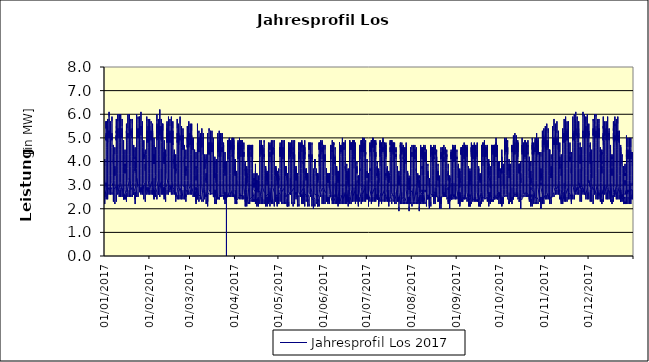
| Category | Jahresprofil Los 2017 |
|---|---|
| 01/01/2017 | 3 |
| 01/01/2017 | 3 |
| 01/01/2017 | 2.8 |
| 01/01/2017 | 2.7 |
| 01/01/2017 | 2.2 |
| 01/01/2017 | 2.6 |
| 01/01/2017 | 2.7 |
| 01/01/2017 | 2.5 |
| 01/01/2017 | 2.7 |
| 01/01/2017 | 2.6 |
| 01/01/2017 | 3.1 |
| 01/01/2017 | 2.9 |
| 01/01/2017 | 3.2 |
| 01/01/2017 | 3.3 |
| 01/01/2017 | 3.4 |
| 01/01/2017 | 3.6 |
| 01/01/2017 | 3.8 |
| 01/01/2017 | 4.1 |
| 01/01/2017 | 3.8 |
| 01/01/2017 | 3.8 |
| 01/01/2017 | 3.8 |
| 01/01/2017 | 3.3 |
| 01/01/2017 | 3.3 |
| 01/01/2017 | 2.9 |
| 01/01/2017 | 2.8 |
| 02/01/2017 | 2.6 |
| 02/01/2017 | 2.5 |
| 02/01/2017 | 2.4 |
| 02/01/2017 | 2.4 |
| 02/01/2017 | 2.9 |
| 02/01/2017 | 3.1 |
| 02/01/2017 | 4.2 |
| 02/01/2017 | 4.5 |
| 02/01/2017 | 4.5 |
| 02/01/2017 | 4.6 |
| 02/01/2017 | 5.2 |
| 02/01/2017 | 4.9 |
| 02/01/2017 | 5.1 |
| 02/01/2017 | 5 |
| 02/01/2017 | 4.9 |
| 02/01/2017 | 5.7 |
| 02/01/2017 | 5.4 |
| 02/01/2017 | 5.7 |
| 02/01/2017 | 5.4 |
| 02/01/2017 | 4.8 |
| 02/01/2017 | 4.1 |
| 02/01/2017 | 3.9 |
| 02/01/2017 | 3 |
| 02/01/2017 | 3.1 |
| 03/01/2017 | 2.7 |
| 03/01/2017 | 2.6 |
| 03/01/2017 | 2.4 |
| 03/01/2017 | 2.4 |
| 03/01/2017 | 2.9 |
| 03/01/2017 | 3.5 |
| 03/01/2017 | 4.1 |
| 03/01/2017 | 4.5 |
| 03/01/2017 | 4.8 |
| 03/01/2017 | 5 |
| 03/01/2017 | 5 |
| 03/01/2017 | 5.2 |
| 03/01/2017 | 4.8 |
| 03/01/2017 | 5.1 |
| 03/01/2017 | 5 |
| 03/01/2017 | 5.5 |
| 03/01/2017 | 5.8 |
| 03/01/2017 | 5.6 |
| 03/01/2017 | 5.2 |
| 03/01/2017 | 4.6 |
| 03/01/2017 | 4.3 |
| 03/01/2017 | 3.6 |
| 03/01/2017 | 3.2 |
| 03/01/2017 | 2.8 |
| 04/01/2017 | 2.9 |
| 04/01/2017 | 2.7 |
| 04/01/2017 | 2.6 |
| 04/01/2017 | 2.6 |
| 04/01/2017 | 2.8 |
| 04/01/2017 | 3.6 |
| 04/01/2017 | 4.1 |
| 04/01/2017 | 4.7 |
| 04/01/2017 | 4.9 |
| 04/01/2017 | 5.3 |
| 04/01/2017 | 5.3 |
| 04/01/2017 | 5 |
| 04/01/2017 | 5.3 |
| 04/01/2017 | 5.2 |
| 04/01/2017 | 5.1 |
| 04/01/2017 | 5.8 |
| 04/01/2017 | 6.1 |
| 04/01/2017 | 5.9 |
| 04/01/2017 | 5.6 |
| 04/01/2017 | 4.8 |
| 04/01/2017 | 4.4 |
| 04/01/2017 | 4 |
| 04/01/2017 | 3.4 |
| 04/01/2017 | 2.8 |
| 05/01/2017 | 2.9 |
| 05/01/2017 | 2.8 |
| 05/01/2017 | 2.6 |
| 05/01/2017 | 2.6 |
| 05/01/2017 | 2.8 |
| 05/01/2017 | 3.6 |
| 05/01/2017 | 4.6 |
| 05/01/2017 | 4.6 |
| 05/01/2017 | 4.7 |
| 05/01/2017 | 5.2 |
| 05/01/2017 | 5.1 |
| 05/01/2017 | 5.3 |
| 05/01/2017 | 5 |
| 05/01/2017 | 4.9 |
| 05/01/2017 | 5.3 |
| 05/01/2017 | 5.4 |
| 05/01/2017 | 5.7 |
| 05/01/2017 | 5.7 |
| 05/01/2017 | 5.3 |
| 05/01/2017 | 4.7 |
| 05/01/2017 | 4.3 |
| 05/01/2017 | 3.9 |
| 05/01/2017 | 3.4 |
| 05/01/2017 | 2.8 |
| 06/01/2017 | 2.9 |
| 06/01/2017 | 2.8 |
| 06/01/2017 | 2.6 |
| 06/01/2017 | 2.6 |
| 06/01/2017 | 2.7 |
| 06/01/2017 | 3.4 |
| 06/01/2017 | 4.4 |
| 06/01/2017 | 4.6 |
| 06/01/2017 | 4.8 |
| 06/01/2017 | 5.2 |
| 06/01/2017 | 5.2 |
| 06/01/2017 | 5.2 |
| 06/01/2017 | 5.2 |
| 06/01/2017 | 4.9 |
| 06/01/2017 | 5.1 |
| 06/01/2017 | 5.6 |
| 06/01/2017 | 5.9 |
| 06/01/2017 | 5.7 |
| 06/01/2017 | 5.2 |
| 06/01/2017 | 4.6 |
| 06/01/2017 | 3.9 |
| 06/01/2017 | 3.8 |
| 06/01/2017 | 3.2 |
| 06/01/2017 | 3.1 |
| 07/01/2017 | 2.9 |
| 07/01/2017 | 2.7 |
| 07/01/2017 | 2.3 |
| 07/01/2017 | 2.7 |
| 07/01/2017 | 2.6 |
| 07/01/2017 | 2.6 |
| 07/01/2017 | 3 |
| 07/01/2017 | 3.6 |
| 07/01/2017 | 3.7 |
| 07/01/2017 | 4.3 |
| 07/01/2017 | 4.1 |
| 07/01/2017 | 4.1 |
| 07/01/2017 | 4 |
| 07/01/2017 | 4.1 |
| 07/01/2017 | 3.9 |
| 07/01/2017 | 4.7 |
| 07/01/2017 | 4.6 |
| 07/01/2017 | 4.6 |
| 07/01/2017 | 4.4 |
| 07/01/2017 | 4.3 |
| 07/01/2017 | 3.9 |
| 07/01/2017 | 3.3 |
| 07/01/2017 | 3.2 |
| 07/01/2017 | 3 |
| 08/01/2017 | 2.8 |
| 08/01/2017 | 2.7 |
| 08/01/2017 | 2.4 |
| 08/01/2017 | 2.2 |
| 08/01/2017 | 2.3 |
| 08/01/2017 | 2.3 |
| 08/01/2017 | 2.5 |
| 08/01/2017 | 3 |
| 08/01/2017 | 3.2 |
| 08/01/2017 | 3.6 |
| 08/01/2017 | 3.7 |
| 08/01/2017 | 3.7 |
| 08/01/2017 | 3.8 |
| 08/01/2017 | 3.4 |
| 08/01/2017 | 3.7 |
| 08/01/2017 | 4 |
| 08/01/2017 | 4.2 |
| 08/01/2017 | 4.6 |
| 08/01/2017 | 4.3 |
| 08/01/2017 | 3.9 |
| 08/01/2017 | 3.6 |
| 08/01/2017 | 3.6 |
| 08/01/2017 | 3.2 |
| 08/01/2017 | 3 |
| 09/01/2017 | 2.8 |
| 09/01/2017 | 2.3 |
| 09/01/2017 | 2.6 |
| 09/01/2017 | 2.7 |
| 09/01/2017 | 3 |
| 09/01/2017 | 3.4 |
| 09/01/2017 | 4.3 |
| 09/01/2017 | 4.4 |
| 09/01/2017 | 5.1 |
| 09/01/2017 | 4.9 |
| 09/01/2017 | 4.9 |
| 09/01/2017 | 5.1 |
| 09/01/2017 | 4.9 |
| 09/01/2017 | 5.3 |
| 09/01/2017 | 5.2 |
| 09/01/2017 | 5.5 |
| 09/01/2017 | 5.6 |
| 09/01/2017 | 5.8 |
| 09/01/2017 | 5.4 |
| 09/01/2017 | 4.7 |
| 09/01/2017 | 4.4 |
| 09/01/2017 | 3.9 |
| 09/01/2017 | 3.3 |
| 09/01/2017 | 2.8 |
| 10/01/2017 | 3 |
| 10/01/2017 | 2.8 |
| 10/01/2017 | 2.6 |
| 10/01/2017 | 2.7 |
| 10/01/2017 | 2.9 |
| 10/01/2017 | 3.8 |
| 10/01/2017 | 4.3 |
| 10/01/2017 | 4.9 |
| 10/01/2017 | 4.9 |
| 10/01/2017 | 5.3 |
| 10/01/2017 | 5.3 |
| 10/01/2017 | 5.4 |
| 10/01/2017 | 5.1 |
| 10/01/2017 | 5 |
| 10/01/2017 | 5.3 |
| 10/01/2017 | 5.3 |
| 10/01/2017 | 6 |
| 10/01/2017 | 5.7 |
| 10/01/2017 | 5.7 |
| 10/01/2017 | 5 |
| 10/01/2017 | 4.1 |
| 10/01/2017 | 4 |
| 10/01/2017 | 3.5 |
| 10/01/2017 | 3 |
| 11/01/2017 | 2.6 |
| 11/01/2017 | 2.5 |
| 11/01/2017 | 2.8 |
| 11/01/2017 | 2.9 |
| 11/01/2017 | 3.1 |
| 11/01/2017 | 3.5 |
| 11/01/2017 | 4.5 |
| 11/01/2017 | 4.7 |
| 11/01/2017 | 4.8 |
| 11/01/2017 | 5.1 |
| 11/01/2017 | 5.1 |
| 11/01/2017 | 5.2 |
| 11/01/2017 | 5.4 |
| 11/01/2017 | 5.3 |
| 11/01/2017 | 5 |
| 11/01/2017 | 5.8 |
| 11/01/2017 | 6 |
| 11/01/2017 | 5.7 |
| 11/01/2017 | 5.3 |
| 11/01/2017 | 5 |
| 11/01/2017 | 4.1 |
| 11/01/2017 | 3.6 |
| 11/01/2017 | 3.6 |
| 11/01/2017 | 3 |
| 12/01/2017 | 2.7 |
| 12/01/2017 | 2.5 |
| 12/01/2017 | 2.8 |
| 12/01/2017 | 2.9 |
| 12/01/2017 | 3.1 |
| 12/01/2017 | 3.9 |
| 12/01/2017 | 4.5 |
| 12/01/2017 | 4.5 |
| 12/01/2017 | 5.1 |
| 12/01/2017 | 5 |
| 12/01/2017 | 5.4 |
| 12/01/2017 | 5 |
| 12/01/2017 | 5.2 |
| 12/01/2017 | 5 |
| 12/01/2017 | 5.2 |
| 12/01/2017 | 5.4 |
| 12/01/2017 | 5.6 |
| 12/01/2017 | 6 |
| 12/01/2017 | 5.5 |
| 12/01/2017 | 4.8 |
| 12/01/2017 | 4 |
| 12/01/2017 | 3.6 |
| 12/01/2017 | 3.6 |
| 12/01/2017 | 3.1 |
| 13/01/2017 | 2.7 |
| 13/01/2017 | 2.5 |
| 13/01/2017 | 2.8 |
| 13/01/2017 | 2.8 |
| 13/01/2017 | 3 |
| 13/01/2017 | 3.8 |
| 13/01/2017 | 4.3 |
| 13/01/2017 | 5 |
| 13/01/2017 | 5.2 |
| 13/01/2017 | 5.1 |
| 13/01/2017 | 5.4 |
| 13/01/2017 | 5.4 |
| 13/01/2017 | 5.3 |
| 13/01/2017 | 5 |
| 13/01/2017 | 5.1 |
| 13/01/2017 | 5.1 |
| 13/01/2017 | 5.8 |
| 13/01/2017 | 5.5 |
| 13/01/2017 | 5.4 |
| 13/01/2017 | 4.7 |
| 13/01/2017 | 4 |
| 13/01/2017 | 3.5 |
| 13/01/2017 | 3.3 |
| 13/01/2017 | 2.9 |
| 14/01/2017 | 2.6 |
| 14/01/2017 | 2.4 |
| 14/01/2017 | 2.5 |
| 14/01/2017 | 2.4 |
| 14/01/2017 | 2.8 |
| 14/01/2017 | 2.9 |
| 14/01/2017 | 3.3 |
| 14/01/2017 | 3.5 |
| 14/01/2017 | 4.1 |
| 14/01/2017 | 4.1 |
| 14/01/2017 | 4.3 |
| 14/01/2017 | 4.3 |
| 14/01/2017 | 4.1 |
| 14/01/2017 | 4.2 |
| 14/01/2017 | 4.4 |
| 14/01/2017 | 4.3 |
| 14/01/2017 | 4.5 |
| 14/01/2017 | 4.9 |
| 14/01/2017 | 4.5 |
| 14/01/2017 | 3.9 |
| 14/01/2017 | 3.5 |
| 14/01/2017 | 3.5 |
| 14/01/2017 | 3.3 |
| 14/01/2017 | 2.7 |
| 15/01/2017 | 2.5 |
| 15/01/2017 | 2.4 |
| 15/01/2017 | 2.6 |
| 15/01/2017 | 2.4 |
| 15/01/2017 | 2.5 |
| 15/01/2017 | 2.6 |
| 15/01/2017 | 2.8 |
| 15/01/2017 | 2.8 |
| 15/01/2017 | 3.5 |
| 15/01/2017 | 3.8 |
| 15/01/2017 | 3.9 |
| 15/01/2017 | 3.8 |
| 15/01/2017 | 3.9 |
| 15/01/2017 | 3.5 |
| 15/01/2017 | 3.7 |
| 15/01/2017 | 4.1 |
| 15/01/2017 | 4.1 |
| 15/01/2017 | 4.3 |
| 15/01/2017 | 4.5 |
| 15/01/2017 | 4 |
| 15/01/2017 | 3.8 |
| 15/01/2017 | 3.2 |
| 15/01/2017 | 2.9 |
| 15/01/2017 | 2.8 |
| 16/01/2017 | 2.5 |
| 16/01/2017 | 2.4 |
| 16/01/2017 | 2.3 |
| 16/01/2017 | 2.4 |
| 16/01/2017 | 2.7 |
| 16/01/2017 | 3.8 |
| 16/01/2017 | 4.2 |
| 16/01/2017 | 4.9 |
| 16/01/2017 | 5 |
| 16/01/2017 | 5.3 |
| 16/01/2017 | 5.2 |
| 16/01/2017 | 5.3 |
| 16/01/2017 | 5 |
| 16/01/2017 | 4.9 |
| 16/01/2017 | 5.1 |
| 16/01/2017 | 5.5 |
| 16/01/2017 | 5.5 |
| 16/01/2017 | 5.6 |
| 16/01/2017 | 5.6 |
| 16/01/2017 | 4.9 |
| 16/01/2017 | 4 |
| 16/01/2017 | 3.6 |
| 16/01/2017 | 3.5 |
| 16/01/2017 | 3.1 |
| 17/01/2017 | 2.7 |
| 17/01/2017 | 2.5 |
| 17/01/2017 | 2.8 |
| 17/01/2017 | 3 |
| 17/01/2017 | 3.2 |
| 17/01/2017 | 3.7 |
| 17/01/2017 | 4.7 |
| 17/01/2017 | 4.8 |
| 17/01/2017 | 4.9 |
| 17/01/2017 | 5.1 |
| 17/01/2017 | 5 |
| 17/01/2017 | 5.1 |
| 17/01/2017 | 5.2 |
| 17/01/2017 | 5.1 |
| 17/01/2017 | 5.2 |
| 17/01/2017 | 5.3 |
| 17/01/2017 | 6 |
| 17/01/2017 | 6 |
| 17/01/2017 | 5.4 |
| 17/01/2017 | 4.7 |
| 17/01/2017 | 4.3 |
| 17/01/2017 | 3.7 |
| 17/01/2017 | 3.2 |
| 17/01/2017 | 3.2 |
| 18/01/2017 | 2.8 |
| 18/01/2017 | 2.7 |
| 18/01/2017 | 2.5 |
| 18/01/2017 | 2.6 |
| 18/01/2017 | 2.8 |
| 18/01/2017 | 3.9 |
| 18/01/2017 | 4.4 |
| 18/01/2017 | 5.1 |
| 18/01/2017 | 5.2 |
| 18/01/2017 | 5.5 |
| 18/01/2017 | 5.4 |
| 18/01/2017 | 5.4 |
| 18/01/2017 | 5.1 |
| 18/01/2017 | 5.4 |
| 18/01/2017 | 5.4 |
| 18/01/2017 | 5.3 |
| 18/01/2017 | 5.9 |
| 18/01/2017 | 6 |
| 18/01/2017 | 5.5 |
| 18/01/2017 | 4.7 |
| 18/01/2017 | 4.3 |
| 18/01/2017 | 3.8 |
| 18/01/2017 | 3.2 |
| 18/01/2017 | 3.3 |
| 19/01/2017 | 2.9 |
| 19/01/2017 | 2.7 |
| 19/01/2017 | 2.5 |
| 19/01/2017 | 2.6 |
| 19/01/2017 | 2.8 |
| 19/01/2017 | 3.8 |
| 19/01/2017 | 4.4 |
| 19/01/2017 | 5 |
| 19/01/2017 | 5 |
| 19/01/2017 | 5.3 |
| 19/01/2017 | 5.2 |
| 19/01/2017 | 5.2 |
| 19/01/2017 | 5.3 |
| 19/01/2017 | 5.1 |
| 19/01/2017 | 5.1 |
| 19/01/2017 | 5.4 |
| 19/01/2017 | 5.6 |
| 19/01/2017 | 5.8 |
| 19/01/2017 | 5.7 |
| 19/01/2017 | 5 |
| 19/01/2017 | 4.2 |
| 19/01/2017 | 3.8 |
| 19/01/2017 | 3.2 |
| 19/01/2017 | 2.8 |
| 20/01/2017 | 2.9 |
| 20/01/2017 | 2.7 |
| 20/01/2017 | 2.5 |
| 20/01/2017 | 2.6 |
| 20/01/2017 | 3.3 |
| 20/01/2017 | 3.7 |
| 20/01/2017 | 4.7 |
| 20/01/2017 | 4.9 |
| 20/01/2017 | 5.1 |
| 20/01/2017 | 5.4 |
| 20/01/2017 | 5.2 |
| 20/01/2017 | 5.1 |
| 20/01/2017 | 5 |
| 20/01/2017 | 5.1 |
| 20/01/2017 | 5 |
| 20/01/2017 | 5.2 |
| 20/01/2017 | 5.7 |
| 20/01/2017 | 5.8 |
| 20/01/2017 | 5.6 |
| 20/01/2017 | 4.9 |
| 20/01/2017 | 4.2 |
| 20/01/2017 | 3.6 |
| 20/01/2017 | 3.5 |
| 20/01/2017 | 3.1 |
| 21/01/2017 | 2.8 |
| 21/01/2017 | 2.6 |
| 21/01/2017 | 2.7 |
| 21/01/2017 | 2.6 |
| 21/01/2017 | 2.6 |
| 21/01/2017 | 2.7 |
| 21/01/2017 | 3.1 |
| 21/01/2017 | 3.8 |
| 21/01/2017 | 3.9 |
| 21/01/2017 | 4.4 |
| 21/01/2017 | 4.5 |
| 21/01/2017 | 4.4 |
| 21/01/2017 | 4.2 |
| 21/01/2017 | 4.3 |
| 21/01/2017 | 4.3 |
| 21/01/2017 | 4.3 |
| 21/01/2017 | 4.5 |
| 21/01/2017 | 4.7 |
| 21/01/2017 | 4.7 |
| 21/01/2017 | 4.1 |
| 21/01/2017 | 3.7 |
| 21/01/2017 | 3.7 |
| 21/01/2017 | 3 |
| 21/01/2017 | 2.9 |
| 22/01/2017 | 2.7 |
| 22/01/2017 | 2.6 |
| 22/01/2017 | 2.2 |
| 22/01/2017 | 2.6 |
| 22/01/2017 | 2.7 |
| 22/01/2017 | 2.4 |
| 22/01/2017 | 2.6 |
| 22/01/2017 | 3.1 |
| 22/01/2017 | 3.3 |
| 22/01/2017 | 3.6 |
| 22/01/2017 | 3.7 |
| 22/01/2017 | 4 |
| 22/01/2017 | 4 |
| 22/01/2017 | 3.6 |
| 22/01/2017 | 3.6 |
| 22/01/2017 | 3.7 |
| 22/01/2017 | 4.6 |
| 22/01/2017 | 4.6 |
| 22/01/2017 | 4.1 |
| 22/01/2017 | 4.2 |
| 22/01/2017 | 3.5 |
| 22/01/2017 | 3.4 |
| 22/01/2017 | 3.1 |
| 22/01/2017 | 3 |
| 23/01/2017 | 2.7 |
| 23/01/2017 | 2.6 |
| 23/01/2017 | 2.5 |
| 23/01/2017 | 2.6 |
| 23/01/2017 | 3 |
| 23/01/2017 | 3.7 |
| 23/01/2017 | 4.6 |
| 23/01/2017 | 4.8 |
| 23/01/2017 | 4.9 |
| 23/01/2017 | 5.1 |
| 23/01/2017 | 5 |
| 23/01/2017 | 5 |
| 23/01/2017 | 5.2 |
| 23/01/2017 | 5 |
| 23/01/2017 | 5 |
| 23/01/2017 | 5.5 |
| 23/01/2017 | 6 |
| 23/01/2017 | 5.9 |
| 23/01/2017 | 5.3 |
| 23/01/2017 | 5.1 |
| 23/01/2017 | 4.2 |
| 23/01/2017 | 3.7 |
| 23/01/2017 | 3.2 |
| 23/01/2017 | 3.3 |
| 24/01/2017 | 2.9 |
| 24/01/2017 | 2.7 |
| 24/01/2017 | 2.5 |
| 24/01/2017 | 2.7 |
| 24/01/2017 | 3 |
| 24/01/2017 | 3.6 |
| 24/01/2017 | 4.6 |
| 24/01/2017 | 4.7 |
| 24/01/2017 | 5.3 |
| 24/01/2017 | 5 |
| 24/01/2017 | 5.3 |
| 24/01/2017 | 5.3 |
| 24/01/2017 | 5.4 |
| 24/01/2017 | 5.2 |
| 24/01/2017 | 5.2 |
| 24/01/2017 | 5.4 |
| 24/01/2017 | 5.9 |
| 24/01/2017 | 5.8 |
| 24/01/2017 | 5.6 |
| 24/01/2017 | 4.9 |
| 24/01/2017 | 4.5 |
| 24/01/2017 | 3.9 |
| 24/01/2017 | 3.3 |
| 24/01/2017 | 3 |
| 25/01/2017 | 3 |
| 25/01/2017 | 2.9 |
| 25/01/2017 | 2.7 |
| 25/01/2017 | 2.8 |
| 25/01/2017 | 3.1 |
| 25/01/2017 | 3.8 |
| 25/01/2017 | 4.4 |
| 25/01/2017 | 5 |
| 25/01/2017 | 5.1 |
| 25/01/2017 | 5.3 |
| 25/01/2017 | 5.2 |
| 25/01/2017 | 5.1 |
| 25/01/2017 | 5.2 |
| 25/01/2017 | 5.5 |
| 25/01/2017 | 5.4 |
| 25/01/2017 | 5.3 |
| 25/01/2017 | 5.9 |
| 25/01/2017 | 5.8 |
| 25/01/2017 | 5.7 |
| 25/01/2017 | 4.9 |
| 25/01/2017 | 4.5 |
| 25/01/2017 | 4 |
| 25/01/2017 | 3.4 |
| 25/01/2017 | 3 |
| 26/01/2017 | 2.6 |
| 26/01/2017 | 2.9 |
| 26/01/2017 | 2.7 |
| 26/01/2017 | 2.8 |
| 26/01/2017 | 3.1 |
| 26/01/2017 | 3.7 |
| 26/01/2017 | 4.8 |
| 26/01/2017 | 4.9 |
| 26/01/2017 | 4.9 |
| 26/01/2017 | 5.1 |
| 26/01/2017 | 5.5 |
| 26/01/2017 | 5.4 |
| 26/01/2017 | 5.4 |
| 26/01/2017 | 5.2 |
| 26/01/2017 | 5.1 |
| 26/01/2017 | 5.5 |
| 26/01/2017 | 6 |
| 26/01/2017 | 6.1 |
| 26/01/2017 | 5.4 |
| 26/01/2017 | 4.7 |
| 26/01/2017 | 4.4 |
| 26/01/2017 | 3.9 |
| 26/01/2017 | 3.4 |
| 26/01/2017 | 3 |
| 27/01/2017 | 2.6 |
| 27/01/2017 | 2.9 |
| 27/01/2017 | 2.7 |
| 27/01/2017 | 2.8 |
| 27/01/2017 | 3 |
| 27/01/2017 | 3.6 |
| 27/01/2017 | 4.6 |
| 27/01/2017 | 4.9 |
| 27/01/2017 | 5 |
| 27/01/2017 | 5.2 |
| 27/01/2017 | 5.5 |
| 27/01/2017 | 5.3 |
| 27/01/2017 | 5.1 |
| 27/01/2017 | 5.2 |
| 27/01/2017 | 4.9 |
| 27/01/2017 | 5.2 |
| 27/01/2017 | 5.7 |
| 27/01/2017 | 5.6 |
| 27/01/2017 | 5.3 |
| 27/01/2017 | 4.6 |
| 27/01/2017 | 3.9 |
| 27/01/2017 | 3.8 |
| 27/01/2017 | 3.2 |
| 27/01/2017 | 2.8 |
| 28/01/2017 | 3 |
| 28/01/2017 | 2.8 |
| 28/01/2017 | 2.4 |
| 28/01/2017 | 2.8 |
| 28/01/2017 | 2.8 |
| 28/01/2017 | 3 |
| 28/01/2017 | 3.4 |
| 28/01/2017 | 3.6 |
| 28/01/2017 | 4.3 |
| 28/01/2017 | 4.2 |
| 28/01/2017 | 4.3 |
| 28/01/2017 | 4.1 |
| 28/01/2017 | 4.3 |
| 28/01/2017 | 4.3 |
| 28/01/2017 | 4.2 |
| 28/01/2017 | 4.4 |
| 28/01/2017 | 4.4 |
| 28/01/2017 | 4.9 |
| 28/01/2017 | 4.9 |
| 28/01/2017 | 4.3 |
| 28/01/2017 | 3.9 |
| 28/01/2017 | 3.3 |
| 28/01/2017 | 3.1 |
| 28/01/2017 | 3.1 |
| 29/01/2017 | 3 |
| 29/01/2017 | 2.8 |
| 29/01/2017 | 2.4 |
| 29/01/2017 | 2.3 |
| 29/01/2017 | 2.4 |
| 29/01/2017 | 2.6 |
| 29/01/2017 | 2.9 |
| 29/01/2017 | 2.9 |
| 29/01/2017 | 3.6 |
| 29/01/2017 | 3.8 |
| 29/01/2017 | 3.9 |
| 29/01/2017 | 3.7 |
| 29/01/2017 | 3.6 |
| 29/01/2017 | 3.6 |
| 29/01/2017 | 3.6 |
| 29/01/2017 | 3.9 |
| 29/01/2017 | 4.5 |
| 29/01/2017 | 4.3 |
| 29/01/2017 | 4.3 |
| 29/01/2017 | 3.8 |
| 29/01/2017 | 3.6 |
| 29/01/2017 | 3.6 |
| 29/01/2017 | 3.2 |
| 29/01/2017 | 2.7 |
| 30/01/2017 | 2.9 |
| 30/01/2017 | 2.8 |
| 30/01/2017 | 2.6 |
| 30/01/2017 | 2.7 |
| 30/01/2017 | 2.9 |
| 30/01/2017 | 3.6 |
| 30/01/2017 | 4.3 |
| 30/01/2017 | 4.6 |
| 30/01/2017 | 5.1 |
| 30/01/2017 | 4.9 |
| 30/01/2017 | 5.3 |
| 30/01/2017 | 5.2 |
| 30/01/2017 | 5.2 |
| 30/01/2017 | 4.8 |
| 30/01/2017 | 5.1 |
| 30/01/2017 | 5.3 |
| 30/01/2017 | 5.6 |
| 30/01/2017 | 5.9 |
| 30/01/2017 | 5.7 |
| 30/01/2017 | 5 |
| 30/01/2017 | 4.3 |
| 30/01/2017 | 3.6 |
| 30/01/2017 | 3.2 |
| 30/01/2017 | 3 |
| 31/01/2017 | 2.6 |
| 31/01/2017 | 2.9 |
| 31/01/2017 | 2.7 |
| 31/01/2017 | 2.8 |
| 31/01/2017 | 2.9 |
| 31/01/2017 | 3.5 |
| 31/01/2017 | 4.2 |
| 31/01/2017 | 4.6 |
| 31/01/2017 | 5 |
| 31/01/2017 | 5.3 |
| 31/01/2017 | 5.1 |
| 31/01/2017 | 5.5 |
| 31/01/2017 | 4.9 |
| 31/01/2017 | 5 |
| 31/01/2017 | 4.8 |
| 31/01/2017 | 5.1 |
| 31/01/2017 | 5.6 |
| 31/01/2017 | 5.8 |
| 31/01/2017 | 5.5 |
| 31/01/2017 | 4.8 |
| 31/01/2017 | 4.1 |
| 31/01/2017 | 3.8 |
| 31/01/2017 | 3.4 |
| 31/01/2017 | 3.2 |
| 01/02/2017 | 2.8 |
| 01/02/2017 | 2.6 |
| 01/02/2017 | 2.8 |
| 01/02/2017 | 2.9 |
| 01/02/2017 | 3.1 |
| 01/02/2017 | 3.7 |
| 01/02/2017 | 4.5 |
| 01/02/2017 | 4.9 |
| 01/02/2017 | 5.3 |
| 01/02/2017 | 5.1 |
| 01/02/2017 | 5.5 |
| 01/02/2017 | 5.3 |
| 01/02/2017 | 5.2 |
| 01/02/2017 | 5.3 |
| 01/02/2017 | 4.9 |
| 01/02/2017 | 5 |
| 01/02/2017 | 5.5 |
| 01/02/2017 | 5.8 |
| 01/02/2017 | 5.5 |
| 01/02/2017 | 4.8 |
| 01/02/2017 | 4.1 |
| 01/02/2017 | 3.9 |
| 01/02/2017 | 3.5 |
| 01/02/2017 | 3.2 |
| 02/02/2017 | 2.8 |
| 02/02/2017 | 2.6 |
| 02/02/2017 | 2.8 |
| 02/02/2017 | 2.9 |
| 02/02/2017 | 3.1 |
| 02/02/2017 | 3.7 |
| 02/02/2017 | 4.4 |
| 02/02/2017 | 4.8 |
| 02/02/2017 | 5.1 |
| 02/02/2017 | 5 |
| 02/02/2017 | 5.3 |
| 02/02/2017 | 5.1 |
| 02/02/2017 | 4.9 |
| 02/02/2017 | 5 |
| 02/02/2017 | 5.2 |
| 02/02/2017 | 5.2 |
| 02/02/2017 | 5.7 |
| 02/02/2017 | 5.6 |
| 02/02/2017 | 5.3 |
| 02/02/2017 | 4.6 |
| 02/02/2017 | 4 |
| 02/02/2017 | 3.8 |
| 02/02/2017 | 3.5 |
| 02/02/2017 | 3.2 |
| 03/02/2017 | 2.8 |
| 03/02/2017 | 2.6 |
| 03/02/2017 | 2.8 |
| 03/02/2017 | 2.9 |
| 03/02/2017 | 3 |
| 03/02/2017 | 3.5 |
| 03/02/2017 | 4.2 |
| 03/02/2017 | 4.7 |
| 03/02/2017 | 5.2 |
| 03/02/2017 | 5.1 |
| 03/02/2017 | 5.3 |
| 03/02/2017 | 5 |
| 03/02/2017 | 5.1 |
| 03/02/2017 | 5 |
| 03/02/2017 | 5 |
| 03/02/2017 | 5 |
| 03/02/2017 | 5.4 |
| 03/02/2017 | 5.6 |
| 03/02/2017 | 5.1 |
| 03/02/2017 | 4.5 |
| 03/02/2017 | 4 |
| 03/02/2017 | 3.7 |
| 03/02/2017 | 3.2 |
| 03/02/2017 | 3 |
| 04/02/2017 | 2.7 |
| 04/02/2017 | 2.5 |
| 04/02/2017 | 2.6 |
| 04/02/2017 | 2.4 |
| 04/02/2017 | 2.8 |
| 04/02/2017 | 2.6 |
| 04/02/2017 | 3.3 |
| 04/02/2017 | 3.6 |
| 04/02/2017 | 4 |
| 04/02/2017 | 4 |
| 04/02/2017 | 4.1 |
| 04/02/2017 | 4.3 |
| 04/02/2017 | 3.9 |
| 04/02/2017 | 4.3 |
| 04/02/2017 | 4 |
| 04/02/2017 | 3.9 |
| 04/02/2017 | 4.7 |
| 04/02/2017 | 5 |
| 04/02/2017 | 4.3 |
| 04/02/2017 | 4.2 |
| 04/02/2017 | 3.5 |
| 04/02/2017 | 3.2 |
| 04/02/2017 | 3.2 |
| 04/02/2017 | 2.8 |
| 05/02/2017 | 2.7 |
| 05/02/2017 | 2.5 |
| 05/02/2017 | 2.6 |
| 05/02/2017 | 2.5 |
| 05/02/2017 | 2.7 |
| 05/02/2017 | 2.9 |
| 05/02/2017 | 3.2 |
| 05/02/2017 | 3.2 |
| 05/02/2017 | 3.4 |
| 05/02/2017 | 3.6 |
| 05/02/2017 | 4.1 |
| 05/02/2017 | 3.8 |
| 05/02/2017 | 3.7 |
| 05/02/2017 | 3.7 |
| 05/02/2017 | 3.5 |
| 05/02/2017 | 4 |
| 05/02/2017 | 4.5 |
| 05/02/2017 | 4.6 |
| 05/02/2017 | 4.5 |
| 05/02/2017 | 4 |
| 05/02/2017 | 3.8 |
| 05/02/2017 | 3.7 |
| 05/02/2017 | 3.4 |
| 05/02/2017 | 2.9 |
| 06/02/2017 | 2.7 |
| 06/02/2017 | 2.6 |
| 06/02/2017 | 2.4 |
| 06/02/2017 | 2.6 |
| 06/02/2017 | 3 |
| 06/02/2017 | 4 |
| 06/02/2017 | 4.5 |
| 06/02/2017 | 5.1 |
| 06/02/2017 | 5.2 |
| 06/02/2017 | 5.3 |
| 06/02/2017 | 5.6 |
| 06/02/2017 | 5.4 |
| 06/02/2017 | 5.5 |
| 06/02/2017 | 5.2 |
| 06/02/2017 | 4.9 |
| 06/02/2017 | 5.1 |
| 06/02/2017 | 5.8 |
| 06/02/2017 | 6 |
| 06/02/2017 | 5.7 |
| 06/02/2017 | 4.9 |
| 06/02/2017 | 4.1 |
| 06/02/2017 | 4.1 |
| 06/02/2017 | 3.5 |
| 06/02/2017 | 3.2 |
| 07/02/2017 | 2.8 |
| 07/02/2017 | 2.6 |
| 07/02/2017 | 2.9 |
| 07/02/2017 | 2.6 |
| 07/02/2017 | 3 |
| 07/02/2017 | 3.8 |
| 07/02/2017 | 4.9 |
| 07/02/2017 | 5 |
| 07/02/2017 | 5 |
| 07/02/2017 | 5.6 |
| 07/02/2017 | 5.3 |
| 07/02/2017 | 5.1 |
| 07/02/2017 | 5.1 |
| 07/02/2017 | 5.3 |
| 07/02/2017 | 5 |
| 07/02/2017 | 5.4 |
| 07/02/2017 | 5.7 |
| 07/02/2017 | 5.8 |
| 07/02/2017 | 5.5 |
| 07/02/2017 | 5.2 |
| 07/02/2017 | 4.3 |
| 07/02/2017 | 3.7 |
| 07/02/2017 | 3.6 |
| 07/02/2017 | 3.3 |
| 08/02/2017 | 2.9 |
| 08/02/2017 | 2.7 |
| 08/02/2017 | 2.5 |
| 08/02/2017 | 2.6 |
| 08/02/2017 | 3 |
| 08/02/2017 | 3.9 |
| 08/02/2017 | 4.5 |
| 08/02/2017 | 5.1 |
| 08/02/2017 | 5.2 |
| 08/02/2017 | 5.2 |
| 08/02/2017 | 5.5 |
| 08/02/2017 | 5.3 |
| 08/02/2017 | 5.3 |
| 08/02/2017 | 5.5 |
| 08/02/2017 | 5.1 |
| 08/02/2017 | 5.3 |
| 08/02/2017 | 5.9 |
| 08/02/2017 | 6.2 |
| 08/02/2017 | 5.5 |
| 08/02/2017 | 5.1 |
| 08/02/2017 | 4.2 |
| 08/02/2017 | 3.7 |
| 08/02/2017 | 3.6 |
| 08/02/2017 | 3.2 |
| 09/02/2017 | 2.8 |
| 09/02/2017 | 2.6 |
| 09/02/2017 | 2.9 |
| 09/02/2017 | 3.1 |
| 09/02/2017 | 2.9 |
| 09/02/2017 | 3.7 |
| 09/02/2017 | 4.8 |
| 09/02/2017 | 4.9 |
| 09/02/2017 | 5.4 |
| 09/02/2017 | 5.4 |
| 09/02/2017 | 5.2 |
| 09/02/2017 | 5.5 |
| 09/02/2017 | 5.4 |
| 09/02/2017 | 5.1 |
| 09/02/2017 | 5.2 |
| 09/02/2017 | 4.9 |
| 09/02/2017 | 5.4 |
| 09/02/2017 | 5.8 |
| 09/02/2017 | 5.6 |
| 09/02/2017 | 4.8 |
| 09/02/2017 | 4.5 |
| 09/02/2017 | 4.1 |
| 09/02/2017 | 3.5 |
| 09/02/2017 | 3.2 |
| 10/02/2017 | 2.7 |
| 10/02/2017 | 2.6 |
| 10/02/2017 | 2.8 |
| 10/02/2017 | 3 |
| 10/02/2017 | 3.3 |
| 10/02/2017 | 4 |
| 10/02/2017 | 4.4 |
| 10/02/2017 | 5.2 |
| 10/02/2017 | 5.3 |
| 10/02/2017 | 5.4 |
| 10/02/2017 | 5.6 |
| 10/02/2017 | 5.3 |
| 10/02/2017 | 5 |
| 10/02/2017 | 4.9 |
| 10/02/2017 | 5 |
| 10/02/2017 | 5.1 |
| 10/02/2017 | 5.4 |
| 10/02/2017 | 5.6 |
| 10/02/2017 | 5.3 |
| 10/02/2017 | 4.7 |
| 10/02/2017 | 3.9 |
| 10/02/2017 | 3.8 |
| 10/02/2017 | 3.2 |
| 10/02/2017 | 2.9 |
| 11/02/2017 | 2.6 |
| 11/02/2017 | 2.9 |
| 11/02/2017 | 2.5 |
| 11/02/2017 | 2.4 |
| 11/02/2017 | 2.9 |
| 11/02/2017 | 2.7 |
| 11/02/2017 | 3 |
| 11/02/2017 | 3.7 |
| 11/02/2017 | 3.9 |
| 11/02/2017 | 4.2 |
| 11/02/2017 | 4.2 |
| 11/02/2017 | 4.4 |
| 11/02/2017 | 4.1 |
| 11/02/2017 | 4 |
| 11/02/2017 | 4.2 |
| 11/02/2017 | 3.9 |
| 11/02/2017 | 4.6 |
| 11/02/2017 | 4.8 |
| 11/02/2017 | 4.9 |
| 11/02/2017 | 4.2 |
| 11/02/2017 | 3.8 |
| 11/02/2017 | 3.2 |
| 11/02/2017 | 3.1 |
| 11/02/2017 | 3.1 |
| 12/02/2017 | 2.9 |
| 12/02/2017 | 2.8 |
| 12/02/2017 | 2.5 |
| 12/02/2017 | 2.3 |
| 12/02/2017 | 2.5 |
| 12/02/2017 | 2.7 |
| 12/02/2017 | 2.9 |
| 12/02/2017 | 2.9 |
| 12/02/2017 | 3.6 |
| 12/02/2017 | 3.7 |
| 12/02/2017 | 3.7 |
| 12/02/2017 | 3.9 |
| 12/02/2017 | 3.8 |
| 12/02/2017 | 3.8 |
| 12/02/2017 | 3.5 |
| 12/02/2017 | 3.9 |
| 12/02/2017 | 4.1 |
| 12/02/2017 | 4.5 |
| 12/02/2017 | 4.2 |
| 12/02/2017 | 4.3 |
| 12/02/2017 | 3.5 |
| 12/02/2017 | 3.4 |
| 12/02/2017 | 3.1 |
| 12/02/2017 | 3.1 |
| 13/02/2017 | 2.9 |
| 13/02/2017 | 2.8 |
| 13/02/2017 | 2.6 |
| 13/02/2017 | 2.8 |
| 13/02/2017 | 3.2 |
| 13/02/2017 | 3.6 |
| 13/02/2017 | 4.4 |
| 13/02/2017 | 5.1 |
| 13/02/2017 | 5.1 |
| 13/02/2017 | 5.2 |
| 13/02/2017 | 5.4 |
| 13/02/2017 | 5.3 |
| 13/02/2017 | 5.3 |
| 13/02/2017 | 5 |
| 13/02/2017 | 5.2 |
| 13/02/2017 | 4.8 |
| 13/02/2017 | 5.6 |
| 13/02/2017 | 5.7 |
| 13/02/2017 | 5.3 |
| 13/02/2017 | 5.1 |
| 13/02/2017 | 4.2 |
| 13/02/2017 | 3.6 |
| 13/02/2017 | 3.6 |
| 13/02/2017 | 3.3 |
| 14/02/2017 | 2.9 |
| 14/02/2017 | 2.8 |
| 14/02/2017 | 2.6 |
| 14/02/2017 | 2.8 |
| 14/02/2017 | 3.2 |
| 14/02/2017 | 3.9 |
| 14/02/2017 | 4.7 |
| 14/02/2017 | 4.9 |
| 14/02/2017 | 4.9 |
| 14/02/2017 | 5.4 |
| 14/02/2017 | 5.1 |
| 14/02/2017 | 5.4 |
| 14/02/2017 | 4.9 |
| 14/02/2017 | 5 |
| 14/02/2017 | 5.2 |
| 14/02/2017 | 5 |
| 14/02/2017 | 5.3 |
| 14/02/2017 | 5.9 |
| 14/02/2017 | 5.6 |
| 14/02/2017 | 4.8 |
| 14/02/2017 | 4.3 |
| 14/02/2017 | 3.7 |
| 14/02/2017 | 3.2 |
| 14/02/2017 | 2.9 |
| 15/02/2017 | 3 |
| 15/02/2017 | 2.9 |
| 15/02/2017 | 2.7 |
| 15/02/2017 | 2.8 |
| 15/02/2017 | 3.2 |
| 15/02/2017 | 3.9 |
| 15/02/2017 | 4.8 |
| 15/02/2017 | 5 |
| 15/02/2017 | 5.1 |
| 15/02/2017 | 5.1 |
| 15/02/2017 | 5.3 |
| 15/02/2017 | 5.1 |
| 15/02/2017 | 5.1 |
| 15/02/2017 | 5.2 |
| 15/02/2017 | 4.8 |
| 15/02/2017 | 4.9 |
| 15/02/2017 | 5.6 |
| 15/02/2017 | 5.8 |
| 15/02/2017 | 5.5 |
| 15/02/2017 | 4.7 |
| 15/02/2017 | 4.2 |
| 15/02/2017 | 3.7 |
| 15/02/2017 | 3.1 |
| 15/02/2017 | 2.8 |
| 16/02/2017 | 3 |
| 16/02/2017 | 2.8 |
| 16/02/2017 | 2.6 |
| 16/02/2017 | 2.8 |
| 16/02/2017 | 3.1 |
| 16/02/2017 | 3.7 |
| 16/02/2017 | 4.6 |
| 16/02/2017 | 4.7 |
| 16/02/2017 | 5.2 |
| 16/02/2017 | 5.3 |
| 16/02/2017 | 5 |
| 16/02/2017 | 5.3 |
| 16/02/2017 | 5.2 |
| 16/02/2017 | 4.8 |
| 16/02/2017 | 4.9 |
| 16/02/2017 | 5 |
| 16/02/2017 | 5.5 |
| 16/02/2017 | 5.9 |
| 16/02/2017 | 5.7 |
| 16/02/2017 | 4.9 |
| 16/02/2017 | 4 |
| 16/02/2017 | 3.6 |
| 16/02/2017 | 3.6 |
| 16/02/2017 | 3.2 |
| 17/02/2017 | 2.9 |
| 17/02/2017 | 2.8 |
| 17/02/2017 | 2.6 |
| 17/02/2017 | 2.7 |
| 17/02/2017 | 3 |
| 17/02/2017 | 4 |
| 17/02/2017 | 4.3 |
| 17/02/2017 | 5 |
| 17/02/2017 | 5.2 |
| 17/02/2017 | 5.2 |
| 17/02/2017 | 5.3 |
| 17/02/2017 | 5 |
| 17/02/2017 | 4.8 |
| 17/02/2017 | 4.7 |
| 17/02/2017 | 4.7 |
| 17/02/2017 | 4.8 |
| 17/02/2017 | 5.1 |
| 17/02/2017 | 5.7 |
| 17/02/2017 | 5.4 |
| 17/02/2017 | 4.8 |
| 17/02/2017 | 4 |
| 17/02/2017 | 3.8 |
| 17/02/2017 | 3.2 |
| 17/02/2017 | 2.9 |
| 18/02/2017 | 2.8 |
| 18/02/2017 | 2.6 |
| 18/02/2017 | 2.8 |
| 18/02/2017 | 2.7 |
| 18/02/2017 | 2.7 |
| 18/02/2017 | 2.8 |
| 18/02/2017 | 3 |
| 18/02/2017 | 3.7 |
| 18/02/2017 | 3.8 |
| 18/02/2017 | 4.1 |
| 18/02/2017 | 4.1 |
| 18/02/2017 | 4.3 |
| 18/02/2017 | 4 |
| 18/02/2017 | 3.9 |
| 18/02/2017 | 4.1 |
| 18/02/2017 | 3.7 |
| 18/02/2017 | 4.4 |
| 18/02/2017 | 4.5 |
| 18/02/2017 | 4.5 |
| 18/02/2017 | 3.9 |
| 18/02/2017 | 3.9 |
| 18/02/2017 | 3.3 |
| 18/02/2017 | 3.1 |
| 18/02/2017 | 2.7 |
| 19/02/2017 | 2.6 |
| 19/02/2017 | 2.5 |
| 19/02/2017 | 2.7 |
| 19/02/2017 | 2.6 |
| 19/02/2017 | 2.3 |
| 19/02/2017 | 2.4 |
| 19/02/2017 | 2.9 |
| 19/02/2017 | 3 |
| 19/02/2017 | 3.1 |
| 19/02/2017 | 3.7 |
| 19/02/2017 | 3.6 |
| 19/02/2017 | 3.9 |
| 19/02/2017 | 3.8 |
| 19/02/2017 | 3.7 |
| 19/02/2017 | 3.5 |
| 19/02/2017 | 3.7 |
| 19/02/2017 | 4 |
| 19/02/2017 | 4.3 |
| 19/02/2017 | 4.3 |
| 19/02/2017 | 3.9 |
| 19/02/2017 | 3.6 |
| 19/02/2017 | 3.4 |
| 19/02/2017 | 3.1 |
| 19/02/2017 | 2.7 |
| 20/02/2017 | 2.5 |
| 20/02/2017 | 2.5 |
| 20/02/2017 | 2.4 |
| 20/02/2017 | 2.6 |
| 20/02/2017 | 2.9 |
| 20/02/2017 | 3.6 |
| 20/02/2017 | 4.3 |
| 20/02/2017 | 4.9 |
| 20/02/2017 | 5 |
| 20/02/2017 | 5 |
| 20/02/2017 | 5.2 |
| 20/02/2017 | 5.1 |
| 20/02/2017 | 5.1 |
| 20/02/2017 | 4.8 |
| 20/02/2017 | 4.9 |
| 20/02/2017 | 5 |
| 20/02/2017 | 5.2 |
| 20/02/2017 | 5.8 |
| 20/02/2017 | 5.4 |
| 20/02/2017 | 4.7 |
| 20/02/2017 | 4.2 |
| 20/02/2017 | 3.6 |
| 20/02/2017 | 3.1 |
| 20/02/2017 | 2.9 |
| 21/02/2017 | 2.6 |
| 21/02/2017 | 2.5 |
| 21/02/2017 | 2.4 |
| 21/02/2017 | 2.5 |
| 21/02/2017 | 2.8 |
| 21/02/2017 | 3.9 |
| 21/02/2017 | 4.5 |
| 21/02/2017 | 4.7 |
| 21/02/2017 | 5.2 |
| 21/02/2017 | 5.2 |
| 21/02/2017 | 4.9 |
| 21/02/2017 | 5.2 |
| 21/02/2017 | 5.2 |
| 21/02/2017 | 4.8 |
| 21/02/2017 | 5 |
| 21/02/2017 | 4.7 |
| 21/02/2017 | 5.5 |
| 21/02/2017 | 5.5 |
| 21/02/2017 | 5.6 |
| 21/02/2017 | 4.9 |
| 21/02/2017 | 4.3 |
| 21/02/2017 | 3.7 |
| 21/02/2017 | 3.2 |
| 21/02/2017 | 3 |
| 22/02/2017 | 2.7 |
| 22/02/2017 | 2.6 |
| 22/02/2017 | 2.4 |
| 22/02/2017 | 2.6 |
| 22/02/2017 | 2.9 |
| 22/02/2017 | 4 |
| 22/02/2017 | 4.7 |
| 22/02/2017 | 4.9 |
| 22/02/2017 | 4.9 |
| 22/02/2017 | 4.9 |
| 22/02/2017 | 5.1 |
| 22/02/2017 | 4.9 |
| 22/02/2017 | 4.9 |
| 22/02/2017 | 5 |
| 22/02/2017 | 5.1 |
| 22/02/2017 | 5.1 |
| 22/02/2017 | 5.2 |
| 22/02/2017 | 5.9 |
| 22/02/2017 | 5.6 |
| 22/02/2017 | 4.8 |
| 22/02/2017 | 4.2 |
| 22/02/2017 | 3.7 |
| 22/02/2017 | 3.2 |
| 22/02/2017 | 2.9 |
| 23/02/2017 | 2.6 |
| 23/02/2017 | 2.5 |
| 23/02/2017 | 2.4 |
| 23/02/2017 | 2.5 |
| 23/02/2017 | 2.8 |
| 23/02/2017 | 3.8 |
| 23/02/2017 | 4.4 |
| 23/02/2017 | 4.6 |
| 23/02/2017 | 5.1 |
| 23/02/2017 | 5.1 |
| 23/02/2017 | 5.3 |
| 23/02/2017 | 5.1 |
| 23/02/2017 | 5 |
| 23/02/2017 | 5.1 |
| 23/02/2017 | 4.7 |
| 23/02/2017 | 4.7 |
| 23/02/2017 | 5.2 |
| 23/02/2017 | 5.5 |
| 23/02/2017 | 5.2 |
| 23/02/2017 | 4.6 |
| 23/02/2017 | 4.1 |
| 23/02/2017 | 3.6 |
| 23/02/2017 | 3.1 |
| 23/02/2017 | 2.8 |
| 24/02/2017 | 2.5 |
| 24/02/2017 | 2.4 |
| 24/02/2017 | 2.8 |
| 24/02/2017 | 2.9 |
| 24/02/2017 | 3.2 |
| 24/02/2017 | 3.5 |
| 24/02/2017 | 4.1 |
| 24/02/2017 | 4.9 |
| 24/02/2017 | 5 |
| 24/02/2017 | 5 |
| 24/02/2017 | 5.1 |
| 24/02/2017 | 4.9 |
| 24/02/2017 | 5.1 |
| 24/02/2017 | 5 |
| 24/02/2017 | 4.5 |
| 24/02/2017 | 4.5 |
| 24/02/2017 | 4.8 |
| 24/02/2017 | 5.4 |
| 24/02/2017 | 5 |
| 24/02/2017 | 4.4 |
| 24/02/2017 | 4 |
| 24/02/2017 | 3.4 |
| 24/02/2017 | 3.3 |
| 24/02/2017 | 3 |
| 25/02/2017 | 2.9 |
| 25/02/2017 | 2.8 |
| 25/02/2017 | 2.5 |
| 25/02/2017 | 2.4 |
| 25/02/2017 | 2.4 |
| 25/02/2017 | 3 |
| 25/02/2017 | 3.1 |
| 25/02/2017 | 3.2 |
| 25/02/2017 | 3.8 |
| 25/02/2017 | 4.1 |
| 25/02/2017 | 4 |
| 25/02/2017 | 4.2 |
| 25/02/2017 | 3.9 |
| 25/02/2017 | 3.8 |
| 25/02/2017 | 4 |
| 25/02/2017 | 4 |
| 25/02/2017 | 4.3 |
| 25/02/2017 | 4.7 |
| 25/02/2017 | 4.6 |
| 25/02/2017 | 4 |
| 25/02/2017 | 3.5 |
| 25/02/2017 | 3.4 |
| 25/02/2017 | 3.2 |
| 25/02/2017 | 2.8 |
| 26/02/2017 | 2.8 |
| 26/02/2017 | 2.7 |
| 26/02/2017 | 2.4 |
| 26/02/2017 | 2.3 |
| 26/02/2017 | 2.5 |
| 26/02/2017 | 2.6 |
| 26/02/2017 | 2.5 |
| 26/02/2017 | 3 |
| 26/02/2017 | 3.2 |
| 26/02/2017 | 3.7 |
| 26/02/2017 | 3.6 |
| 26/02/2017 | 3.8 |
| 26/02/2017 | 3.7 |
| 26/02/2017 | 3.7 |
| 26/02/2017 | 3.4 |
| 26/02/2017 | 3.6 |
| 26/02/2017 | 4 |
| 26/02/2017 | 4.1 |
| 26/02/2017 | 4.5 |
| 26/02/2017 | 4.1 |
| 26/02/2017 | 3.6 |
| 26/02/2017 | 3.5 |
| 26/02/2017 | 3.2 |
| 26/02/2017 | 2.8 |
| 27/02/2017 | 2.7 |
| 27/02/2017 | 2.7 |
| 27/02/2017 | 2.6 |
| 27/02/2017 | 2.8 |
| 27/02/2017 | 3.2 |
| 27/02/2017 | 3.6 |
| 27/02/2017 | 4.1 |
| 27/02/2017 | 4.8 |
| 27/02/2017 | 4.8 |
| 27/02/2017 | 4.8 |
| 27/02/2017 | 5 |
| 27/02/2017 | 4.9 |
| 27/02/2017 | 5 |
| 27/02/2017 | 4.6 |
| 27/02/2017 | 4.7 |
| 27/02/2017 | 4.6 |
| 27/02/2017 | 4.9 |
| 27/02/2017 | 5.4 |
| 27/02/2017 | 5.5 |
| 27/02/2017 | 4.8 |
| 27/02/2017 | 4.2 |
| 27/02/2017 | 3.7 |
| 27/02/2017 | 3.2 |
| 27/02/2017 | 2.9 |
| 28/02/2017 | 2.7 |
| 28/02/2017 | 2.7 |
| 28/02/2017 | 2.6 |
| 28/02/2017 | 2.7 |
| 28/02/2017 | 3 |
| 28/02/2017 | 3.9 |
| 28/02/2017 | 4.4 |
| 28/02/2017 | 4.6 |
| 28/02/2017 | 5.1 |
| 28/02/2017 | 5 |
| 28/02/2017 | 5.2 |
| 28/02/2017 | 5 |
| 28/02/2017 | 5 |
| 28/02/2017 | 4.6 |
| 28/02/2017 | 4.8 |
| 28/02/2017 | 4.9 |
| 28/02/2017 | 5.1 |
| 28/02/2017 | 5.6 |
| 28/02/2017 | 5.7 |
| 28/02/2017 | 5 |
| 28/02/2017 | 4.4 |
| 28/02/2017 | 3.7 |
| 28/02/2017 | 3.2 |
| 28/02/2017 | 3 |
| 01/03/2017 | 2.8 |
| 01/03/2017 | 2.8 |
| 01/03/2017 | 2.6 |
| 01/03/2017 | 2.8 |
| 01/03/2017 | 3.1 |
| 01/03/2017 | 3.5 |
| 01/03/2017 | 4.5 |
| 01/03/2017 | 4.7 |
| 01/03/2017 | 4.7 |
| 01/03/2017 | 5.2 |
| 01/03/2017 | 4.9 |
| 01/03/2017 | 5.2 |
| 01/03/2017 | 4.7 |
| 01/03/2017 | 4.8 |
| 01/03/2017 | 4.8 |
| 01/03/2017 | 4.8 |
| 01/03/2017 | 4.9 |
| 01/03/2017 | 5.5 |
| 01/03/2017 | 5.6 |
| 01/03/2017 | 4.9 |
| 01/03/2017 | 4.3 |
| 01/03/2017 | 3.7 |
| 01/03/2017 | 3.2 |
| 01/03/2017 | 3 |
| 02/03/2017 | 2.8 |
| 02/03/2017 | 2.7 |
| 02/03/2017 | 2.6 |
| 02/03/2017 | 2.7 |
| 02/03/2017 | 3 |
| 02/03/2017 | 3.8 |
| 02/03/2017 | 4.3 |
| 02/03/2017 | 4.5 |
| 02/03/2017 | 4.9 |
| 02/03/2017 | 4.9 |
| 02/03/2017 | 5.1 |
| 02/03/2017 | 4.9 |
| 02/03/2017 | 4.9 |
| 02/03/2017 | 4.9 |
| 02/03/2017 | 4.5 |
| 02/03/2017 | 4.9 |
| 02/03/2017 | 4.9 |
| 02/03/2017 | 5.6 |
| 02/03/2017 | 5.3 |
| 02/03/2017 | 4.7 |
| 02/03/2017 | 4.1 |
| 02/03/2017 | 3.6 |
| 02/03/2017 | 3.1 |
| 02/03/2017 | 2.9 |
| 03/03/2017 | 2.7 |
| 03/03/2017 | 2.6 |
| 03/03/2017 | 2.5 |
| 03/03/2017 | 2.6 |
| 03/03/2017 | 2.9 |
| 03/03/2017 | 3.6 |
| 03/03/2017 | 4 |
| 03/03/2017 | 4.8 |
| 03/03/2017 | 4.9 |
| 03/03/2017 | 4.9 |
| 03/03/2017 | 4.9 |
| 03/03/2017 | 4.7 |
| 03/03/2017 | 4.9 |
| 03/03/2017 | 4.8 |
| 03/03/2017 | 4.8 |
| 03/03/2017 | 4.7 |
| 03/03/2017 | 4.5 |
| 03/03/2017 | 5 |
| 03/03/2017 | 5 |
| 03/03/2017 | 4.5 |
| 03/03/2017 | 4.1 |
| 03/03/2017 | 3.4 |
| 03/03/2017 | 3.4 |
| 03/03/2017 | 2.6 |
| 04/03/2017 | 2.6 |
| 04/03/2017 | 2.5 |
| 04/03/2017 | 2.7 |
| 04/03/2017 | 2.7 |
| 04/03/2017 | 2.7 |
| 04/03/2017 | 2.6 |
| 04/03/2017 | 3.1 |
| 04/03/2017 | 3.3 |
| 04/03/2017 | 3.8 |
| 04/03/2017 | 4 |
| 04/03/2017 | 3.9 |
| 04/03/2017 | 4.2 |
| 04/03/2017 | 3.9 |
| 04/03/2017 | 3.8 |
| 04/03/2017 | 3.9 |
| 04/03/2017 | 3.9 |
| 04/03/2017 | 3.7 |
| 04/03/2017 | 4.5 |
| 04/03/2017 | 4.2 |
| 04/03/2017 | 4.2 |
| 04/03/2017 | 3.5 |
| 04/03/2017 | 3.4 |
| 04/03/2017 | 2.8 |
| 04/03/2017 | 2.9 |
| 05/03/2017 | 2.5 |
| 05/03/2017 | 2.5 |
| 05/03/2017 | 2.2 |
| 05/03/2017 | 2.6 |
| 05/03/2017 | 2.3 |
| 05/03/2017 | 2.3 |
| 05/03/2017 | 2.6 |
| 05/03/2017 | 3.1 |
| 05/03/2017 | 3.2 |
| 05/03/2017 | 3.2 |
| 05/03/2017 | 3.6 |
| 05/03/2017 | 3.8 |
| 05/03/2017 | 3.7 |
| 05/03/2017 | 3.2 |
| 05/03/2017 | 3.4 |
| 05/03/2017 | 3.5 |
| 05/03/2017 | 3.5 |
| 05/03/2017 | 4.4 |
| 05/03/2017 | 4.1 |
| 05/03/2017 | 3.7 |
| 05/03/2017 | 3.2 |
| 05/03/2017 | 3.1 |
| 05/03/2017 | 2.8 |
| 05/03/2017 | 2.9 |
| 06/03/2017 | 2.4 |
| 06/03/2017 | 2.4 |
| 06/03/2017 | 2.4 |
| 06/03/2017 | 2.5 |
| 06/03/2017 | 2.9 |
| 06/03/2017 | 3.7 |
| 06/03/2017 | 4 |
| 06/03/2017 | 4.7 |
| 06/03/2017 | 4.7 |
| 06/03/2017 | 4.7 |
| 06/03/2017 | 4.8 |
| 06/03/2017 | 4.7 |
| 06/03/2017 | 4.8 |
| 06/03/2017 | 4.4 |
| 06/03/2017 | 4.5 |
| 06/03/2017 | 4.3 |
| 06/03/2017 | 4.7 |
| 06/03/2017 | 5.6 |
| 06/03/2017 | 5.5 |
| 06/03/2017 | 4.9 |
| 06/03/2017 | 3.8 |
| 06/03/2017 | 3.7 |
| 06/03/2017 | 3.2 |
| 06/03/2017 | 3.1 |
| 07/03/2017 | 2.4 |
| 07/03/2017 | 2.4 |
| 07/03/2017 | 2.3 |
| 07/03/2017 | 2.5 |
| 07/03/2017 | 2.7 |
| 07/03/2017 | 3.5 |
| 07/03/2017 | 4.3 |
| 07/03/2017 | 4.5 |
| 07/03/2017 | 4.9 |
| 07/03/2017 | 4.9 |
| 07/03/2017 | 5 |
| 07/03/2017 | 4.8 |
| 07/03/2017 | 4.9 |
| 07/03/2017 | 4.4 |
| 07/03/2017 | 4.5 |
| 07/03/2017 | 4.6 |
| 07/03/2017 | 4.9 |
| 07/03/2017 | 5.3 |
| 07/03/2017 | 5.2 |
| 07/03/2017 | 4.6 |
| 07/03/2017 | 3.9 |
| 07/03/2017 | 3.8 |
| 07/03/2017 | 3.3 |
| 07/03/2017 | 2.6 |
| 08/03/2017 | 2.5 |
| 08/03/2017 | 2.5 |
| 08/03/2017 | 2.4 |
| 08/03/2017 | 2.5 |
| 08/03/2017 | 2.8 |
| 08/03/2017 | 3.5 |
| 08/03/2017 | 4.4 |
| 08/03/2017 | 4.6 |
| 08/03/2017 | 4.6 |
| 08/03/2017 | 5.1 |
| 08/03/2017 | 4.7 |
| 08/03/2017 | 5 |
| 08/03/2017 | 4.6 |
| 08/03/2017 | 4.6 |
| 08/03/2017 | 4.6 |
| 08/03/2017 | 4.5 |
| 08/03/2017 | 4.7 |
| 08/03/2017 | 5.1 |
| 08/03/2017 | 5.2 |
| 08/03/2017 | 4.5 |
| 08/03/2017 | 3.8 |
| 08/03/2017 | 3.8 |
| 08/03/2017 | 3.3 |
| 08/03/2017 | 2.6 |
| 09/03/2017 | 2.4 |
| 09/03/2017 | 2.4 |
| 09/03/2017 | 2.3 |
| 09/03/2017 | 2.4 |
| 09/03/2017 | 2.7 |
| 09/03/2017 | 3.4 |
| 09/03/2017 | 4.2 |
| 09/03/2017 | 4.4 |
| 09/03/2017 | 4.8 |
| 09/03/2017 | 4.8 |
| 09/03/2017 | 4.9 |
| 09/03/2017 | 4.7 |
| 09/03/2017 | 4.7 |
| 09/03/2017 | 4.7 |
| 09/03/2017 | 4.8 |
| 09/03/2017 | 4.6 |
| 09/03/2017 | 4.7 |
| 09/03/2017 | 5.3 |
| 09/03/2017 | 5.4 |
| 09/03/2017 | 4.8 |
| 09/03/2017 | 4.1 |
| 09/03/2017 | 3.6 |
| 09/03/2017 | 3.2 |
| 09/03/2017 | 3 |
| 10/03/2017 | 2.4 |
| 10/03/2017 | 2.3 |
| 10/03/2017 | 2.3 |
| 10/03/2017 | 2.4 |
| 10/03/2017 | 3.1 |
| 10/03/2017 | 3.6 |
| 10/03/2017 | 3.9 |
| 10/03/2017 | 4.7 |
| 10/03/2017 | 4.7 |
| 10/03/2017 | 4.7 |
| 10/03/2017 | 4.8 |
| 10/03/2017 | 5 |
| 10/03/2017 | 4.8 |
| 10/03/2017 | 4.7 |
| 10/03/2017 | 4.6 |
| 10/03/2017 | 4.4 |
| 10/03/2017 | 4.3 |
| 10/03/2017 | 5.2 |
| 10/03/2017 | 5.1 |
| 10/03/2017 | 4.6 |
| 10/03/2017 | 3.6 |
| 10/03/2017 | 3.4 |
| 10/03/2017 | 2.9 |
| 10/03/2017 | 2.7 |
| 11/03/2017 | 2.7 |
| 11/03/2017 | 2.7 |
| 11/03/2017 | 2.5 |
| 11/03/2017 | 2.4 |
| 11/03/2017 | 2.4 |
| 11/03/2017 | 2.8 |
| 11/03/2017 | 3.1 |
| 11/03/2017 | 3.3 |
| 11/03/2017 | 3.7 |
| 11/03/2017 | 3.9 |
| 11/03/2017 | 3.8 |
| 11/03/2017 | 4.1 |
| 11/03/2017 | 3.8 |
| 11/03/2017 | 3.7 |
| 11/03/2017 | 3.8 |
| 11/03/2017 | 3.7 |
| 11/03/2017 | 3.7 |
| 11/03/2017 | 4.2 |
| 11/03/2017 | 4.3 |
| 11/03/2017 | 3.9 |
| 11/03/2017 | 3.6 |
| 11/03/2017 | 3 |
| 11/03/2017 | 2.9 |
| 11/03/2017 | 2.5 |
| 12/03/2017 | 2.6 |
| 12/03/2017 | 2.2 |
| 12/03/2017 | 2.4 |
| 12/03/2017 | 2.4 |
| 12/03/2017 | 2.6 |
| 12/03/2017 | 2.5 |
| 12/03/2017 | 2.7 |
| 12/03/2017 | 2.7 |
| 12/03/2017 | 3.3 |
| 12/03/2017 | 3.2 |
| 12/03/2017 | 3.5 |
| 12/03/2017 | 3.3 |
| 12/03/2017 | 3.2 |
| 12/03/2017 | 3.1 |
| 12/03/2017 | 3.3 |
| 12/03/2017 | 3.4 |
| 12/03/2017 | 3.5 |
| 12/03/2017 | 4.2 |
| 12/03/2017 | 4.3 |
| 12/03/2017 | 3.9 |
| 12/03/2017 | 3.3 |
| 12/03/2017 | 3.1 |
| 12/03/2017 | 2.9 |
| 12/03/2017 | 2.5 |
| 13/03/2017 | 2.6 |
| 13/03/2017 | 2.1 |
| 13/03/2017 | 2.6 |
| 13/03/2017 | 2.3 |
| 13/03/2017 | 2.6 |
| 13/03/2017 | 3.3 |
| 13/03/2017 | 3.9 |
| 13/03/2017 | 4.6 |
| 13/03/2017 | 4.6 |
| 13/03/2017 | 4.6 |
| 13/03/2017 | 4.7 |
| 13/03/2017 | 4.6 |
| 13/03/2017 | 4.7 |
| 13/03/2017 | 4.7 |
| 13/03/2017 | 4.3 |
| 13/03/2017 | 4.6 |
| 13/03/2017 | 4.5 |
| 13/03/2017 | 5.2 |
| 13/03/2017 | 5.1 |
| 13/03/2017 | 4.5 |
| 13/03/2017 | 3.8 |
| 13/03/2017 | 3.2 |
| 13/03/2017 | 2.8 |
| 13/03/2017 | 2.7 |
| 14/03/2017 | 2.6 |
| 14/03/2017 | 2.6 |
| 14/03/2017 | 2.6 |
| 14/03/2017 | 2.7 |
| 14/03/2017 | 3 |
| 14/03/2017 | 3.5 |
| 14/03/2017 | 4.2 |
| 14/03/2017 | 4.4 |
| 14/03/2017 | 4.8 |
| 14/03/2017 | 4.8 |
| 14/03/2017 | 4.8 |
| 14/03/2017 | 4.7 |
| 14/03/2017 | 4.7 |
| 14/03/2017 | 4.8 |
| 14/03/2017 | 4.3 |
| 14/03/2017 | 4.3 |
| 14/03/2017 | 4.7 |
| 14/03/2017 | 5.4 |
| 14/03/2017 | 5.3 |
| 14/03/2017 | 4.7 |
| 14/03/2017 | 4 |
| 14/03/2017 | 3.3 |
| 14/03/2017 | 2.9 |
| 14/03/2017 | 2.8 |
| 15/03/2017 | 2.7 |
| 15/03/2017 | 2.7 |
| 15/03/2017 | 2.6 |
| 15/03/2017 | 2.7 |
| 15/03/2017 | 3 |
| 15/03/2017 | 3.6 |
| 15/03/2017 | 4.3 |
| 15/03/2017 | 4.5 |
| 15/03/2017 | 4.5 |
| 15/03/2017 | 4.9 |
| 15/03/2017 | 5 |
| 15/03/2017 | 4.9 |
| 15/03/2017 | 4.9 |
| 15/03/2017 | 4.4 |
| 15/03/2017 | 4.4 |
| 15/03/2017 | 4.7 |
| 15/03/2017 | 4.5 |
| 15/03/2017 | 5.3 |
| 15/03/2017 | 5.3 |
| 15/03/2017 | 4.7 |
| 15/03/2017 | 3.9 |
| 15/03/2017 | 3.3 |
| 15/03/2017 | 2.9 |
| 15/03/2017 | 2.7 |
| 16/03/2017 | 2.6 |
| 16/03/2017 | 2.6 |
| 16/03/2017 | 2.6 |
| 16/03/2017 | 2.7 |
| 16/03/2017 | 3 |
| 16/03/2017 | 3.5 |
| 16/03/2017 | 4.1 |
| 16/03/2017 | 4.3 |
| 16/03/2017 | 4.7 |
| 16/03/2017 | 4.7 |
| 16/03/2017 | 4.8 |
| 16/03/2017 | 4.6 |
| 16/03/2017 | 4.7 |
| 16/03/2017 | 4.7 |
| 16/03/2017 | 4.7 |
| 16/03/2017 | 4.4 |
| 16/03/2017 | 4.7 |
| 16/03/2017 | 4.9 |
| 16/03/2017 | 5.3 |
| 16/03/2017 | 4.4 |
| 16/03/2017 | 3.8 |
| 16/03/2017 | 3.7 |
| 16/03/2017 | 2.8 |
| 16/03/2017 | 2.7 |
| 17/03/2017 | 2.6 |
| 17/03/2017 | 2.6 |
| 17/03/2017 | 2.5 |
| 17/03/2017 | 2.7 |
| 17/03/2017 | 2.9 |
| 17/03/2017 | 3.2 |
| 17/03/2017 | 3.9 |
| 17/03/2017 | 4.7 |
| 17/03/2017 | 4.7 |
| 17/03/2017 | 4.7 |
| 17/03/2017 | 4.7 |
| 17/03/2017 | 4.5 |
| 17/03/2017 | 4.8 |
| 17/03/2017 | 4.7 |
| 17/03/2017 | 4.6 |
| 17/03/2017 | 4.4 |
| 17/03/2017 | 4.5 |
| 17/03/2017 | 4.9 |
| 17/03/2017 | 5 |
| 17/03/2017 | 4.2 |
| 17/03/2017 | 3.8 |
| 17/03/2017 | 3.6 |
| 17/03/2017 | 3.1 |
| 17/03/2017 | 2.5 |
| 18/03/2017 | 2.5 |
| 18/03/2017 | 2.5 |
| 18/03/2017 | 2.3 |
| 18/03/2017 | 2.2 |
| 18/03/2017 | 2.7 |
| 18/03/2017 | 2.5 |
| 18/03/2017 | 2.8 |
| 18/03/2017 | 3.5 |
| 18/03/2017 | 3.4 |
| 18/03/2017 | 4 |
| 18/03/2017 | 3.9 |
| 18/03/2017 | 3.7 |
| 18/03/2017 | 3.5 |
| 18/03/2017 | 3.3 |
| 18/03/2017 | 3.4 |
| 18/03/2017 | 3.4 |
| 18/03/2017 | 3.7 |
| 18/03/2017 | 4.1 |
| 18/03/2017 | 4.2 |
| 18/03/2017 | 4 |
| 18/03/2017 | 3.4 |
| 18/03/2017 | 3.2 |
| 18/03/2017 | 2.6 |
| 18/03/2017 | 2.8 |
| 19/03/2017 | 2.5 |
| 19/03/2017 | 2.5 |
| 19/03/2017 | 2.3 |
| 19/03/2017 | 2.2 |
| 19/03/2017 | 2.4 |
| 19/03/2017 | 2.2 |
| 19/03/2017 | 2.5 |
| 19/03/2017 | 3 |
| 19/03/2017 | 3 |
| 19/03/2017 | 3.4 |
| 19/03/2017 | 3.2 |
| 19/03/2017 | 3.5 |
| 19/03/2017 | 3.4 |
| 19/03/2017 | 3.4 |
| 19/03/2017 | 3.1 |
| 19/03/2017 | 3.1 |
| 19/03/2017 | 3.2 |
| 19/03/2017 | 4 |
| 19/03/2017 | 4.1 |
| 19/03/2017 | 3.5 |
| 19/03/2017 | 3.1 |
| 19/03/2017 | 3.4 |
| 19/03/2017 | 2.7 |
| 19/03/2017 | 2.8 |
| 20/03/2017 | 2.4 |
| 20/03/2017 | 2.5 |
| 20/03/2017 | 2.5 |
| 20/03/2017 | 2.7 |
| 20/03/2017 | 2.9 |
| 20/03/2017 | 3.5 |
| 20/03/2017 | 4.1 |
| 20/03/2017 | 4.3 |
| 20/03/2017 | 4.7 |
| 20/03/2017 | 4.7 |
| 20/03/2017 | 4.8 |
| 20/03/2017 | 4.8 |
| 20/03/2017 | 4.4 |
| 20/03/2017 | 4.5 |
| 20/03/2017 | 4.5 |
| 20/03/2017 | 4.4 |
| 20/03/2017 | 4.8 |
| 20/03/2017 | 5 |
| 20/03/2017 | 5.2 |
| 20/03/2017 | 4.6 |
| 20/03/2017 | 4.2 |
| 20/03/2017 | 3.5 |
| 20/03/2017 | 3.1 |
| 20/03/2017 | 2.5 |
| 21/03/2017 | 2.4 |
| 21/03/2017 | 2.5 |
| 21/03/2017 | 2.4 |
| 21/03/2017 | 2.6 |
| 21/03/2017 | 2.8 |
| 21/03/2017 | 3.3 |
| 21/03/2017 | 3.9 |
| 21/03/2017 | 4.6 |
| 21/03/2017 | 4.5 |
| 21/03/2017 | 4.5 |
| 21/03/2017 | 4.5 |
| 21/03/2017 | 4.9 |
| 21/03/2017 | 4.5 |
| 21/03/2017 | 4.6 |
| 21/03/2017 | 4.7 |
| 21/03/2017 | 4.2 |
| 21/03/2017 | 4.7 |
| 21/03/2017 | 5.2 |
| 21/03/2017 | 5.3 |
| 21/03/2017 | 4.8 |
| 21/03/2017 | 3.8 |
| 21/03/2017 | 3.6 |
| 21/03/2017 | 3.2 |
| 21/03/2017 | 2.6 |
| 22/03/2017 | 2.5 |
| 22/03/2017 | 2.6 |
| 22/03/2017 | 2.5 |
| 22/03/2017 | 2.7 |
| 22/03/2017 | 2.9 |
| 22/03/2017 | 3.4 |
| 22/03/2017 | 4 |
| 22/03/2017 | 4.3 |
| 22/03/2017 | 4.7 |
| 22/03/2017 | 4.7 |
| 22/03/2017 | 4.8 |
| 22/03/2017 | 4.7 |
| 22/03/2017 | 4.8 |
| 22/03/2017 | 4.3 |
| 22/03/2017 | 4.3 |
| 22/03/2017 | 4.2 |
| 22/03/2017 | 4.7 |
| 22/03/2017 | 5 |
| 22/03/2017 | 5.2 |
| 22/03/2017 | 4.7 |
| 22/03/2017 | 3.8 |
| 22/03/2017 | 3.7 |
| 22/03/2017 | 3.2 |
| 22/03/2017 | 2.6 |
| 23/03/2017 | 2.5 |
| 23/03/2017 | 2.5 |
| 23/03/2017 | 2.5 |
| 23/03/2017 | 2.6 |
| 23/03/2017 | 2.9 |
| 23/03/2017 | 3.2 |
| 23/03/2017 | 3.9 |
| 23/03/2017 | 4.6 |
| 23/03/2017 | 4.5 |
| 23/03/2017 | 4.5 |
| 23/03/2017 | 4.5 |
| 23/03/2017 | 4.4 |
| 23/03/2017 | 4.5 |
| 23/03/2017 | 4.5 |
| 23/03/2017 | 4.6 |
| 23/03/2017 | 4.5 |
| 23/03/2017 | 4.4 |
| 23/03/2017 | 5.2 |
| 23/03/2017 | 4.8 |
| 23/03/2017 | 4.4 |
| 23/03/2017 | 3.7 |
| 23/03/2017 | 3.6 |
| 23/03/2017 | 3.2 |
| 23/03/2017 | 2.6 |
| 24/03/2017 | 2.5 |
| 24/03/2017 | 2.5 |
| 24/03/2017 | 2.4 |
| 24/03/2017 | 2.6 |
| 24/03/2017 | 2.8 |
| 24/03/2017 | 3.5 |
| 24/03/2017 | 4.1 |
| 24/03/2017 | 4.5 |
| 24/03/2017 | 4.5 |
| 24/03/2017 | 4.5 |
| 24/03/2017 | 4.5 |
| 24/03/2017 | 4.8 |
| 24/03/2017 | 4.7 |
| 24/03/2017 | 4.5 |
| 24/03/2017 | 4.5 |
| 24/03/2017 | 4.4 |
| 24/03/2017 | 4.3 |
| 24/03/2017 | 4.7 |
| 24/03/2017 | 4.6 |
| 24/03/2017 | 4.3 |
| 24/03/2017 | 3.7 |
| 24/03/2017 | 3.5 |
| 24/03/2017 | 2.9 |
| 24/03/2017 | 2.9 |
| 25/03/2017 | 2.4 |
| 25/03/2017 | 2.4 |
| 25/03/2017 | 2.2 |
| 25/03/2017 | 2.2 |
| 25/03/2017 | 2.7 |
| 25/03/2017 | 2.4 |
| 25/03/2017 | 2.6 |
| 25/03/2017 | 3.3 |
| 25/03/2017 | 3.7 |
| 25/03/2017 | 3.8 |
| 25/03/2017 | 3.7 |
| 25/03/2017 | 4 |
| 25/03/2017 | 3.9 |
| 25/03/2017 | 3.8 |
| 25/03/2017 | 3.4 |
| 25/03/2017 | 3.4 |
| 25/03/2017 | 3.9 |
| 25/03/2017 | 3.9 |
| 25/03/2017 | 4.4 |
| 25/03/2017 | 3.6 |
| 25/03/2017 | 3.3 |
| 25/03/2017 | 3.1 |
| 25/03/2017 | 3 |
| 25/03/2017 | 2.4 |
| 26/03/2017 | 2.5 |
| 26/03/2017 | 0 |
| 26/03/2017 | 2.3 |
| 26/03/2017 | 2.2 |
| 26/03/2017 | 2.4 |
| 26/03/2017 | 2.3 |
| 26/03/2017 | 2.6 |
| 26/03/2017 | 2.6 |
| 26/03/2017 | 3.2 |
| 26/03/2017 | 3.3 |
| 26/03/2017 | 3.7 |
| 26/03/2017 | 3.5 |
| 26/03/2017 | 3.3 |
| 26/03/2017 | 3.1 |
| 26/03/2017 | 3.3 |
| 26/03/2017 | 2.9 |
| 26/03/2017 | 2.9 |
| 26/03/2017 | 3.6 |
| 26/03/2017 | 3.9 |
| 26/03/2017 | 4 |
| 26/03/2017 | 3.6 |
| 26/03/2017 | 3.2 |
| 26/03/2017 | 3.1 |
| 26/03/2017 | 2.5 |
| 27/03/2017 | 2.5 |
| 27/03/2017 | 2.6 |
| 27/03/2017 | 2.5 |
| 27/03/2017 | 2.7 |
| 27/03/2017 | 2.9 |
| 27/03/2017 | 3.6 |
| 27/03/2017 | 3.9 |
| 27/03/2017 | 4.5 |
| 27/03/2017 | 4.5 |
| 27/03/2017 | 4.7 |
| 27/03/2017 | 4.9 |
| 27/03/2017 | 4.9 |
| 27/03/2017 | 4.9 |
| 27/03/2017 | 4.8 |
| 27/03/2017 | 4.4 |
| 27/03/2017 | 4.1 |
| 27/03/2017 | 4.1 |
| 27/03/2017 | 4.8 |
| 27/03/2017 | 4.9 |
| 27/03/2017 | 4.6 |
| 27/03/2017 | 4.2 |
| 27/03/2017 | 3.4 |
| 27/03/2017 | 3 |
| 27/03/2017 | 2.7 |
| 28/03/2017 | 2.5 |
| 28/03/2017 | 2.5 |
| 28/03/2017 | 2.5 |
| 28/03/2017 | 2.6 |
| 28/03/2017 | 2.8 |
| 28/03/2017 | 3.4 |
| 28/03/2017 | 4.2 |
| 28/03/2017 | 4.3 |
| 28/03/2017 | 4.8 |
| 28/03/2017 | 5 |
| 28/03/2017 | 4.6 |
| 28/03/2017 | 4.6 |
| 28/03/2017 | 4.5 |
| 28/03/2017 | 4.4 |
| 28/03/2017 | 4.5 |
| 28/03/2017 | 4.5 |
| 28/03/2017 | 4.5 |
| 28/03/2017 | 5 |
| 28/03/2017 | 5 |
| 28/03/2017 | 4.8 |
| 28/03/2017 | 3.9 |
| 28/03/2017 | 3.5 |
| 28/03/2017 | 3.1 |
| 28/03/2017 | 2.8 |
| 29/03/2017 | 2.6 |
| 29/03/2017 | 2.6 |
| 29/03/2017 | 2.5 |
| 29/03/2017 | 2.7 |
| 29/03/2017 | 2.9 |
| 29/03/2017 | 3.5 |
| 29/03/2017 | 4.3 |
| 29/03/2017 | 4.5 |
| 29/03/2017 | 4.5 |
| 29/03/2017 | 4.7 |
| 29/03/2017 | 4.8 |
| 29/03/2017 | 4.8 |
| 29/03/2017 | 4.8 |
| 29/03/2017 | 4.6 |
| 29/03/2017 | 4.7 |
| 29/03/2017 | 4.5 |
| 29/03/2017 | 4.5 |
| 29/03/2017 | 4.9 |
| 29/03/2017 | 4.9 |
| 29/03/2017 | 4.7 |
| 29/03/2017 | 3.9 |
| 29/03/2017 | 3.5 |
| 29/03/2017 | 3.2 |
| 29/03/2017 | 2.8 |
| 30/03/2017 | 2.6 |
| 30/03/2017 | 2.6 |
| 30/03/2017 | 2.5 |
| 30/03/2017 | 2.7 |
| 30/03/2017 | 2.8 |
| 30/03/2017 | 3.3 |
| 30/03/2017 | 4.2 |
| 30/03/2017 | 4.3 |
| 30/03/2017 | 4.8 |
| 30/03/2017 | 5 |
| 30/03/2017 | 4.6 |
| 30/03/2017 | 4.6 |
| 30/03/2017 | 4.5 |
| 30/03/2017 | 4.4 |
| 30/03/2017 | 4.4 |
| 30/03/2017 | 4.2 |
| 30/03/2017 | 4.3 |
| 30/03/2017 | 4.5 |
| 30/03/2017 | 5 |
| 30/03/2017 | 4.4 |
| 30/03/2017 | 4.2 |
| 30/03/2017 | 3.4 |
| 30/03/2017 | 3.1 |
| 30/03/2017 | 2.7 |
| 31/03/2017 | 2.6 |
| 31/03/2017 | 2.6 |
| 31/03/2017 | 2.5 |
| 31/03/2017 | 2.6 |
| 31/03/2017 | 2.7 |
| 31/03/2017 | 3.6 |
| 31/03/2017 | 3.9 |
| 31/03/2017 | 4.7 |
| 31/03/2017 | 4.8 |
| 31/03/2017 | 5 |
| 31/03/2017 | 4.5 |
| 31/03/2017 | 4.9 |
| 31/03/2017 | 4.7 |
| 31/03/2017 | 4.4 |
| 31/03/2017 | 4.3 |
| 31/03/2017 | 4.1 |
| 31/03/2017 | 4.2 |
| 31/03/2017 | 4.6 |
| 31/03/2017 | 4.7 |
| 31/03/2017 | 4.3 |
| 31/03/2017 | 3.8 |
| 31/03/2017 | 3.3 |
| 31/03/2017 | 2.9 |
| 31/03/2017 | 2.5 |
| 01/04/2017 | 2.5 |
| 01/04/2017 | 2.5 |
| 01/04/2017 | 2.2 |
| 01/04/2017 | 2.2 |
| 01/04/2017 | 2.6 |
| 01/04/2017 | 2.4 |
| 01/04/2017 | 2.8 |
| 01/04/2017 | 3.5 |
| 01/04/2017 | 3.4 |
| 01/04/2017 | 3.8 |
| 01/04/2017 | 3.7 |
| 01/04/2017 | 4.1 |
| 01/04/2017 | 3.8 |
| 01/04/2017 | 3.5 |
| 01/04/2017 | 3.6 |
| 01/04/2017 | 3.7 |
| 01/04/2017 | 3.5 |
| 01/04/2017 | 4 |
| 01/04/2017 | 4.1 |
| 01/04/2017 | 4 |
| 01/04/2017 | 3.3 |
| 01/04/2017 | 2.9 |
| 01/04/2017 | 2.9 |
| 01/04/2017 | 2.8 |
| 02/04/2017 | 2.4 |
| 02/04/2017 | 2.5 |
| 02/04/2017 | 2.2 |
| 02/04/2017 | 2.2 |
| 02/04/2017 | 2.3 |
| 02/04/2017 | 2.2 |
| 02/04/2017 | 2.5 |
| 02/04/2017 | 3 |
| 02/04/2017 | 3 |
| 02/04/2017 | 3.1 |
| 02/04/2017 | 3.5 |
| 02/04/2017 | 3.3 |
| 02/04/2017 | 3.2 |
| 02/04/2017 | 3 |
| 02/04/2017 | 3.2 |
| 02/04/2017 | 3 |
| 02/04/2017 | 3.1 |
| 02/04/2017 | 3.6 |
| 02/04/2017 | 3.6 |
| 02/04/2017 | 3.6 |
| 02/04/2017 | 3.6 |
| 02/04/2017 | 3.1 |
| 02/04/2017 | 2.9 |
| 02/04/2017 | 2.4 |
| 03/04/2017 | 2.4 |
| 03/04/2017 | 2.4 |
| 03/04/2017 | 2.4 |
| 03/04/2017 | 2.6 |
| 03/04/2017 | 2.8 |
| 03/04/2017 | 3.4 |
| 03/04/2017 | 4.1 |
| 03/04/2017 | 4.3 |
| 03/04/2017 | 4.8 |
| 03/04/2017 | 4.5 |
| 03/04/2017 | 4.6 |
| 03/04/2017 | 4.7 |
| 03/04/2017 | 4.7 |
| 03/04/2017 | 4.7 |
| 03/04/2017 | 4.3 |
| 03/04/2017 | 4.1 |
| 03/04/2017 | 4.4 |
| 03/04/2017 | 4.6 |
| 03/04/2017 | 4.9 |
| 03/04/2017 | 4.6 |
| 03/04/2017 | 4.1 |
| 03/04/2017 | 3.2 |
| 03/04/2017 | 2.9 |
| 03/04/2017 | 2.5 |
| 04/04/2017 | 2.4 |
| 04/04/2017 | 2.4 |
| 04/04/2017 | 2.4 |
| 04/04/2017 | 2.5 |
| 04/04/2017 | 2.7 |
| 04/04/2017 | 3.6 |
| 04/04/2017 | 3.9 |
| 04/04/2017 | 4.6 |
| 04/04/2017 | 4.6 |
| 04/04/2017 | 4.7 |
| 04/04/2017 | 4.9 |
| 04/04/2017 | 4.9 |
| 04/04/2017 | 4.9 |
| 04/04/2017 | 4.8 |
| 04/04/2017 | 4.4 |
| 04/04/2017 | 4.5 |
| 04/04/2017 | 4.3 |
| 04/04/2017 | 4.8 |
| 04/04/2017 | 5 |
| 04/04/2017 | 4.3 |
| 04/04/2017 | 3.8 |
| 04/04/2017 | 3.4 |
| 04/04/2017 | 3 |
| 04/04/2017 | 2.7 |
| 05/04/2017 | 2.5 |
| 05/04/2017 | 2.5 |
| 05/04/2017 | 2.4 |
| 05/04/2017 | 2.6 |
| 05/04/2017 | 2.8 |
| 05/04/2017 | 3.2 |
| 05/04/2017 | 4.1 |
| 05/04/2017 | 4.3 |
| 05/04/2017 | 4.8 |
| 05/04/2017 | 4.9 |
| 05/04/2017 | 4.6 |
| 05/04/2017 | 4.7 |
| 05/04/2017 | 4.6 |
| 05/04/2017 | 4.5 |
| 05/04/2017 | 4.6 |
| 05/04/2017 | 4.5 |
| 05/04/2017 | 4.2 |
| 05/04/2017 | 4.7 |
| 05/04/2017 | 4.9 |
| 05/04/2017 | 4.7 |
| 05/04/2017 | 3.8 |
| 05/04/2017 | 3.4 |
| 05/04/2017 | 3 |
| 05/04/2017 | 2.6 |
| 06/04/2017 | 2.5 |
| 06/04/2017 | 2.5 |
| 06/04/2017 | 2.4 |
| 06/04/2017 | 2.6 |
| 06/04/2017 | 2.7 |
| 06/04/2017 | 3.6 |
| 06/04/2017 | 3.9 |
| 06/04/2017 | 4.6 |
| 06/04/2017 | 4.6 |
| 06/04/2017 | 4.7 |
| 06/04/2017 | 4.9 |
| 06/04/2017 | 4.9 |
| 06/04/2017 | 4.9 |
| 06/04/2017 | 4.8 |
| 06/04/2017 | 4.3 |
| 06/04/2017 | 4.3 |
| 06/04/2017 | 4.5 |
| 06/04/2017 | 4.4 |
| 06/04/2017 | 4.5 |
| 06/04/2017 | 4.5 |
| 06/04/2017 | 4.2 |
| 06/04/2017 | 3.3 |
| 06/04/2017 | 3 |
| 06/04/2017 | 2.6 |
| 07/04/2017 | 2.5 |
| 07/04/2017 | 2.4 |
| 07/04/2017 | 2.4 |
| 07/04/2017 | 2.5 |
| 07/04/2017 | 2.6 |
| 07/04/2017 | 3.4 |
| 07/04/2017 | 4.2 |
| 07/04/2017 | 4.5 |
| 07/04/2017 | 4.6 |
| 07/04/2017 | 4.7 |
| 07/04/2017 | 4.8 |
| 07/04/2017 | 4.8 |
| 07/04/2017 | 4.5 |
| 07/04/2017 | 4.3 |
| 07/04/2017 | 4.2 |
| 07/04/2017 | 4.2 |
| 07/04/2017 | 4.4 |
| 07/04/2017 | 4.4 |
| 07/04/2017 | 4.3 |
| 07/04/2017 | 4.3 |
| 07/04/2017 | 3.7 |
| 07/04/2017 | 3.2 |
| 07/04/2017 | 3.2 |
| 07/04/2017 | 2.9 |
| 08/04/2017 | 2.4 |
| 08/04/2017 | 2.3 |
| 08/04/2017 | 2.6 |
| 08/04/2017 | 2.1 |
| 08/04/2017 | 2.6 |
| 08/04/2017 | 2.8 |
| 08/04/2017 | 2.7 |
| 08/04/2017 | 3.3 |
| 08/04/2017 | 3.7 |
| 08/04/2017 | 3.6 |
| 08/04/2017 | 4 |
| 08/04/2017 | 3.9 |
| 08/04/2017 | 3.7 |
| 08/04/2017 | 3.4 |
| 08/04/2017 | 3.6 |
| 08/04/2017 | 3.7 |
| 08/04/2017 | 3.7 |
| 08/04/2017 | 3.9 |
| 08/04/2017 | 3.8 |
| 08/04/2017 | 3.6 |
| 08/04/2017 | 3.3 |
| 08/04/2017 | 3.3 |
| 08/04/2017 | 2.8 |
| 08/04/2017 | 2.7 |
| 09/04/2017 | 2.3 |
| 09/04/2017 | 2.3 |
| 09/04/2017 | 2.1 |
| 09/04/2017 | 2.1 |
| 09/04/2017 | 2.3 |
| 09/04/2017 | 2.5 |
| 09/04/2017 | 2.3 |
| 09/04/2017 | 2.8 |
| 09/04/2017 | 2.9 |
| 09/04/2017 | 3.4 |
| 09/04/2017 | 3.3 |
| 09/04/2017 | 3.7 |
| 09/04/2017 | 3.1 |
| 09/04/2017 | 3.5 |
| 09/04/2017 | 3.2 |
| 09/04/2017 | 3 |
| 09/04/2017 | 3.2 |
| 09/04/2017 | 3.6 |
| 09/04/2017 | 3.8 |
| 09/04/2017 | 3.7 |
| 09/04/2017 | 3.5 |
| 09/04/2017 | 3 |
| 09/04/2017 | 2.8 |
| 09/04/2017 | 2.7 |
| 10/04/2017 | 2.2 |
| 10/04/2017 | 2.3 |
| 10/04/2017 | 2.3 |
| 10/04/2017 | 2.4 |
| 10/04/2017 | 2.5 |
| 10/04/2017 | 3.3 |
| 10/04/2017 | 3.7 |
| 10/04/2017 | 4.1 |
| 10/04/2017 | 4.4 |
| 10/04/2017 | 4.7 |
| 10/04/2017 | 4.5 |
| 10/04/2017 | 4.6 |
| 10/04/2017 | 4.5 |
| 10/04/2017 | 4.4 |
| 10/04/2017 | 4.4 |
| 10/04/2017 | 4 |
| 10/04/2017 | 4.5 |
| 10/04/2017 | 4.2 |
| 10/04/2017 | 4.7 |
| 10/04/2017 | 4.4 |
| 10/04/2017 | 4 |
| 10/04/2017 | 3.4 |
| 10/04/2017 | 3.1 |
| 10/04/2017 | 2.9 |
| 11/04/2017 | 2.3 |
| 11/04/2017 | 2.3 |
| 11/04/2017 | 2.2 |
| 11/04/2017 | 2.4 |
| 11/04/2017 | 2.9 |
| 11/04/2017 | 3.1 |
| 11/04/2017 | 4 |
| 11/04/2017 | 4.4 |
| 11/04/2017 | 4.7 |
| 11/04/2017 | 4.5 |
| 11/04/2017 | 4.7 |
| 11/04/2017 | 4.7 |
| 11/04/2017 | 4.7 |
| 11/04/2017 | 4.5 |
| 11/04/2017 | 4.5 |
| 11/04/2017 | 4.3 |
| 11/04/2017 | 4.3 |
| 11/04/2017 | 4.4 |
| 11/04/2017 | 4.3 |
| 11/04/2017 | 4.1 |
| 11/04/2017 | 3.7 |
| 11/04/2017 | 3.5 |
| 11/04/2017 | 3.2 |
| 11/04/2017 | 2.5 |
| 12/04/2017 | 2.4 |
| 12/04/2017 | 2.4 |
| 12/04/2017 | 2.3 |
| 12/04/2017 | 2.4 |
| 12/04/2017 | 2.9 |
| 12/04/2017 | 3.2 |
| 12/04/2017 | 3.7 |
| 12/04/2017 | 4.1 |
| 12/04/2017 | 4.4 |
| 12/04/2017 | 4.7 |
| 12/04/2017 | 4.5 |
| 12/04/2017 | 4.5 |
| 12/04/2017 | 4.4 |
| 12/04/2017 | 4.2 |
| 12/04/2017 | 4.2 |
| 12/04/2017 | 4.3 |
| 12/04/2017 | 4.3 |
| 12/04/2017 | 4.3 |
| 12/04/2017 | 4.7 |
| 12/04/2017 | 4.5 |
| 12/04/2017 | 3.7 |
| 12/04/2017 | 3.5 |
| 12/04/2017 | 3.3 |
| 12/04/2017 | 2.5 |
| 13/04/2017 | 2.4 |
| 13/04/2017 | 2.3 |
| 13/04/2017 | 2.3 |
| 13/04/2017 | 2.4 |
| 13/04/2017 | 2.9 |
| 13/04/2017 | 3 |
| 13/04/2017 | 3.6 |
| 13/04/2017 | 4.4 |
| 13/04/2017 | 4.7 |
| 13/04/2017 | 4.5 |
| 13/04/2017 | 4.7 |
| 13/04/2017 | 4.7 |
| 13/04/2017 | 4.6 |
| 13/04/2017 | 4.4 |
| 13/04/2017 | 4.4 |
| 13/04/2017 | 4.1 |
| 13/04/2017 | 4.1 |
| 13/04/2017 | 4.5 |
| 13/04/2017 | 4.3 |
| 13/04/2017 | 4.3 |
| 13/04/2017 | 4.1 |
| 13/04/2017 | 3.4 |
| 13/04/2017 | 3.2 |
| 13/04/2017 | 2.5 |
| 14/04/2017 | 2.6 |
| 14/04/2017 | 2.5 |
| 14/04/2017 | 2.3 |
| 14/04/2017 | 2.3 |
| 14/04/2017 | 2.4 |
| 14/04/2017 | 2.3 |
| 14/04/2017 | 2.7 |
| 14/04/2017 | 2.9 |
| 14/04/2017 | 3 |
| 14/04/2017 | 3.2 |
| 14/04/2017 | 3.3 |
| 14/04/2017 | 3.5 |
| 14/04/2017 | 3.2 |
| 14/04/2017 | 3 |
| 14/04/2017 | 3.1 |
| 14/04/2017 | 2.9 |
| 14/04/2017 | 3 |
| 14/04/2017 | 3.2 |
| 14/04/2017 | 3.3 |
| 14/04/2017 | 3.2 |
| 14/04/2017 | 3.3 |
| 14/04/2017 | 3.1 |
| 14/04/2017 | 2.8 |
| 14/04/2017 | 2.8 |
| 15/04/2017 | 2.7 |
| 15/04/2017 | 2.2 |
| 15/04/2017 | 2.5 |
| 15/04/2017 | 2.5 |
| 15/04/2017 | 2.3 |
| 15/04/2017 | 2.5 |
| 15/04/2017 | 2.7 |
| 15/04/2017 | 2.9 |
| 15/04/2017 | 3.5 |
| 15/04/2017 | 3.5 |
| 15/04/2017 | 3.9 |
| 15/04/2017 | 3.9 |
| 15/04/2017 | 3.5 |
| 15/04/2017 | 3.3 |
| 15/04/2017 | 3.4 |
| 15/04/2017 | 3.2 |
| 15/04/2017 | 3.4 |
| 15/04/2017 | 3.3 |
| 15/04/2017 | 3.4 |
| 15/04/2017 | 3.6 |
| 15/04/2017 | 3.2 |
| 15/04/2017 | 3 |
| 15/04/2017 | 3 |
| 15/04/2017 | 2.5 |
| 16/04/2017 | 2.3 |
| 16/04/2017 | 2.4 |
| 16/04/2017 | 2.2 |
| 16/04/2017 | 2.2 |
| 16/04/2017 | 2.4 |
| 16/04/2017 | 2.1 |
| 16/04/2017 | 2.5 |
| 16/04/2017 | 2.9 |
| 16/04/2017 | 2.8 |
| 16/04/2017 | 3.2 |
| 16/04/2017 | 3.1 |
| 16/04/2017 | 3 |
| 16/04/2017 | 2.9 |
| 16/04/2017 | 2.8 |
| 16/04/2017 | 2.9 |
| 16/04/2017 | 2.9 |
| 16/04/2017 | 3.2 |
| 16/04/2017 | 3.1 |
| 16/04/2017 | 3 |
| 16/04/2017 | 3.5 |
| 16/04/2017 | 3.4 |
| 16/04/2017 | 2.7 |
| 16/04/2017 | 2.9 |
| 16/04/2017 | 2.5 |
| 17/04/2017 | 2.3 |
| 17/04/2017 | 2.4 |
| 17/04/2017 | 2.2 |
| 17/04/2017 | 2.2 |
| 17/04/2017 | 2.4 |
| 17/04/2017 | 2.1 |
| 17/04/2017 | 2.5 |
| 17/04/2017 | 2.9 |
| 17/04/2017 | 2.8 |
| 17/04/2017 | 3.1 |
| 17/04/2017 | 3 |
| 17/04/2017 | 3 |
| 17/04/2017 | 2.8 |
| 17/04/2017 | 2.8 |
| 17/04/2017 | 2.9 |
| 17/04/2017 | 2.9 |
| 17/04/2017 | 2.7 |
| 17/04/2017 | 3.1 |
| 17/04/2017 | 2.9 |
| 17/04/2017 | 3.4 |
| 17/04/2017 | 3.4 |
| 17/04/2017 | 3.2 |
| 17/04/2017 | 2.9 |
| 17/04/2017 | 2.8 |
| 18/04/2017 | 2.7 |
| 18/04/2017 | 2.2 |
| 18/04/2017 | 2.2 |
| 18/04/2017 | 2.4 |
| 18/04/2017 | 3 |
| 18/04/2017 | 3.2 |
| 18/04/2017 | 4 |
| 18/04/2017 | 4.2 |
| 18/04/2017 | 4.6 |
| 18/04/2017 | 4.7 |
| 18/04/2017 | 4.9 |
| 18/04/2017 | 4.5 |
| 18/04/2017 | 4.6 |
| 18/04/2017 | 4.6 |
| 18/04/2017 | 4.2 |
| 18/04/2017 | 4.6 |
| 18/04/2017 | 4.7 |
| 18/04/2017 | 4.5 |
| 18/04/2017 | 4.6 |
| 18/04/2017 | 4.4 |
| 18/04/2017 | 4.2 |
| 18/04/2017 | 3.6 |
| 18/04/2017 | 3.2 |
| 18/04/2017 | 2.9 |
| 19/04/2017 | 2.3 |
| 19/04/2017 | 2.3 |
| 19/04/2017 | 2.2 |
| 19/04/2017 | 2.5 |
| 19/04/2017 | 2.6 |
| 19/04/2017 | 3.3 |
| 19/04/2017 | 4.1 |
| 19/04/2017 | 4.3 |
| 19/04/2017 | 4.3 |
| 19/04/2017 | 4.4 |
| 19/04/2017 | 4.6 |
| 19/04/2017 | 4.8 |
| 19/04/2017 | 4.9 |
| 19/04/2017 | 4.3 |
| 19/04/2017 | 4.4 |
| 19/04/2017 | 4.6 |
| 19/04/2017 | 4.7 |
| 19/04/2017 | 4.4 |
| 19/04/2017 | 4.5 |
| 19/04/2017 | 4.3 |
| 19/04/2017 | 4.2 |
| 19/04/2017 | 3.6 |
| 19/04/2017 | 3.3 |
| 19/04/2017 | 2.9 |
| 20/04/2017 | 2.3 |
| 20/04/2017 | 2.3 |
| 20/04/2017 | 2.2 |
| 20/04/2017 | 2.4 |
| 20/04/2017 | 3.1 |
| 20/04/2017 | 3.2 |
| 20/04/2017 | 4 |
| 20/04/2017 | 4.2 |
| 20/04/2017 | 4.6 |
| 20/04/2017 | 4.7 |
| 20/04/2017 | 4.4 |
| 20/04/2017 | 4.5 |
| 20/04/2017 | 4.6 |
| 20/04/2017 | 4.6 |
| 20/04/2017 | 4.6 |
| 20/04/2017 | 4.3 |
| 20/04/2017 | 4.4 |
| 20/04/2017 | 4.6 |
| 20/04/2017 | 4.1 |
| 20/04/2017 | 4.5 |
| 20/04/2017 | 4 |
| 20/04/2017 | 3.5 |
| 20/04/2017 | 3.2 |
| 20/04/2017 | 2.9 |
| 21/04/2017 | 2.7 |
| 21/04/2017 | 2.2 |
| 21/04/2017 | 2.2 |
| 21/04/2017 | 2.4 |
| 21/04/2017 | 3 |
| 21/04/2017 | 3.5 |
| 21/04/2017 | 3.7 |
| 21/04/2017 | 4.6 |
| 21/04/2017 | 4.6 |
| 21/04/2017 | 4.7 |
| 21/04/2017 | 4.9 |
| 21/04/2017 | 4.9 |
| 21/04/2017 | 4.8 |
| 21/04/2017 | 4.6 |
| 21/04/2017 | 4.6 |
| 21/04/2017 | 4.2 |
| 21/04/2017 | 4.3 |
| 21/04/2017 | 4.2 |
| 21/04/2017 | 4.1 |
| 21/04/2017 | 3.9 |
| 21/04/2017 | 3.6 |
| 21/04/2017 | 3.4 |
| 21/04/2017 | 3 |
| 21/04/2017 | 2.7 |
| 22/04/2017 | 2.7 |
| 22/04/2017 | 2.1 |
| 22/04/2017 | 2.4 |
| 22/04/2017 | 2.5 |
| 22/04/2017 | 2.4 |
| 22/04/2017 | 2.5 |
| 22/04/2017 | 2.8 |
| 22/04/2017 | 3 |
| 22/04/2017 | 3.4 |
| 22/04/2017 | 3.7 |
| 22/04/2017 | 3.6 |
| 22/04/2017 | 3.7 |
| 22/04/2017 | 3.5 |
| 22/04/2017 | 3.8 |
| 22/04/2017 | 3.4 |
| 22/04/2017 | 3.3 |
| 22/04/2017 | 3.5 |
| 22/04/2017 | 3.5 |
| 22/04/2017 | 3.4 |
| 22/04/2017 | 3.8 |
| 22/04/2017 | 3.6 |
| 22/04/2017 | 3.1 |
| 22/04/2017 | 3 |
| 22/04/2017 | 2.5 |
| 23/04/2017 | 2.6 |
| 23/04/2017 | 2.2 |
| 23/04/2017 | 2.5 |
| 23/04/2017 | 2.5 |
| 23/04/2017 | 2.1 |
| 23/04/2017 | 2.2 |
| 23/04/2017 | 2.6 |
| 23/04/2017 | 2.6 |
| 23/04/2017 | 3.1 |
| 23/04/2017 | 3.1 |
| 23/04/2017 | 3.5 |
| 23/04/2017 | 3.4 |
| 23/04/2017 | 3.4 |
| 23/04/2017 | 3.3 |
| 23/04/2017 | 3.1 |
| 23/04/2017 | 3 |
| 23/04/2017 | 3.5 |
| 23/04/2017 | 3.2 |
| 23/04/2017 | 3.6 |
| 23/04/2017 | 3.4 |
| 23/04/2017 | 3.3 |
| 23/04/2017 | 3.3 |
| 23/04/2017 | 2.6 |
| 23/04/2017 | 2.6 |
| 24/04/2017 | 2.6 |
| 24/04/2017 | 2.2 |
| 24/04/2017 | 2.2 |
| 24/04/2017 | 2.4 |
| 24/04/2017 | 2.5 |
| 24/04/2017 | 3.3 |
| 24/04/2017 | 4 |
| 24/04/2017 | 4.2 |
| 24/04/2017 | 4.2 |
| 24/04/2017 | 4.3 |
| 24/04/2017 | 4.6 |
| 24/04/2017 | 4.8 |
| 24/04/2017 | 4.4 |
| 24/04/2017 | 4.4 |
| 24/04/2017 | 4.6 |
| 24/04/2017 | 4.2 |
| 24/04/2017 | 4.4 |
| 24/04/2017 | 4.5 |
| 24/04/2017 | 4.5 |
| 24/04/2017 | 4.2 |
| 24/04/2017 | 3.8 |
| 24/04/2017 | 3.4 |
| 24/04/2017 | 3.1 |
| 24/04/2017 | 2.8 |
| 25/04/2017 | 2.6 |
| 25/04/2017 | 2.1 |
| 25/04/2017 | 2.6 |
| 25/04/2017 | 2.3 |
| 25/04/2017 | 2.9 |
| 25/04/2017 | 3.6 |
| 25/04/2017 | 3.8 |
| 25/04/2017 | 4.5 |
| 25/04/2017 | 4.5 |
| 25/04/2017 | 4.6 |
| 25/04/2017 | 4.8 |
| 25/04/2017 | 4.5 |
| 25/04/2017 | 4.6 |
| 25/04/2017 | 4.6 |
| 25/04/2017 | 4.7 |
| 25/04/2017 | 4.6 |
| 25/04/2017 | 4.2 |
| 25/04/2017 | 4.3 |
| 25/04/2017 | 4.3 |
| 25/04/2017 | 4.4 |
| 25/04/2017 | 4 |
| 25/04/2017 | 3.5 |
| 25/04/2017 | 3.2 |
| 25/04/2017 | 2.9 |
| 26/04/2017 | 2.2 |
| 26/04/2017 | 2.2 |
| 26/04/2017 | 2.2 |
| 26/04/2017 | 2.4 |
| 26/04/2017 | 3 |
| 26/04/2017 | 3.2 |
| 26/04/2017 | 4 |
| 26/04/2017 | 4.2 |
| 26/04/2017 | 4.7 |
| 26/04/2017 | 4.9 |
| 26/04/2017 | 4.6 |
| 26/04/2017 | 4.8 |
| 26/04/2017 | 4.8 |
| 26/04/2017 | 4.3 |
| 26/04/2017 | 4.4 |
| 26/04/2017 | 4.6 |
| 26/04/2017 | 4.7 |
| 26/04/2017 | 4.3 |
| 26/04/2017 | 4.3 |
| 26/04/2017 | 4.4 |
| 26/04/2017 | 3.9 |
| 26/04/2017 | 3.6 |
| 26/04/2017 | 3.2 |
| 26/04/2017 | 2.9 |
| 27/04/2017 | 2.2 |
| 27/04/2017 | 2.2 |
| 27/04/2017 | 2.2 |
| 27/04/2017 | 2.4 |
| 27/04/2017 | 2.9 |
| 27/04/2017 | 3.5 |
| 27/04/2017 | 3.9 |
| 27/04/2017 | 4.5 |
| 27/04/2017 | 4.5 |
| 27/04/2017 | 4.7 |
| 27/04/2017 | 4.9 |
| 27/04/2017 | 4.5 |
| 27/04/2017 | 4.6 |
| 27/04/2017 | 4.6 |
| 27/04/2017 | 4.6 |
| 27/04/2017 | 4.3 |
| 27/04/2017 | 4.4 |
| 27/04/2017 | 4.6 |
| 27/04/2017 | 4.5 |
| 27/04/2017 | 4.1 |
| 27/04/2017 | 3.8 |
| 27/04/2017 | 3.5 |
| 27/04/2017 | 3.2 |
| 27/04/2017 | 2.9 |
| 28/04/2017 | 2.7 |
| 28/04/2017 | 2.2 |
| 28/04/2017 | 2.1 |
| 28/04/2017 | 2.3 |
| 28/04/2017 | 2.8 |
| 28/04/2017 | 3.4 |
| 28/04/2017 | 4.1 |
| 28/04/2017 | 4.5 |
| 28/04/2017 | 4.6 |
| 28/04/2017 | 4.7 |
| 28/04/2017 | 4.9 |
| 28/04/2017 | 4.9 |
| 28/04/2017 | 4.8 |
| 28/04/2017 | 4.6 |
| 28/04/2017 | 4.6 |
| 28/04/2017 | 4.2 |
| 28/04/2017 | 4.2 |
| 28/04/2017 | 4.2 |
| 28/04/2017 | 4 |
| 28/04/2017 | 4 |
| 28/04/2017 | 3.8 |
| 28/04/2017 | 3.4 |
| 28/04/2017 | 3 |
| 28/04/2017 | 2.7 |
| 29/04/2017 | 2.6 |
| 29/04/2017 | 2.6 |
| 29/04/2017 | 2.4 |
| 29/04/2017 | 2.5 |
| 29/04/2017 | 2.3 |
| 29/04/2017 | 2.4 |
| 29/04/2017 | 2.8 |
| 29/04/2017 | 2.9 |
| 29/04/2017 | 3.3 |
| 29/04/2017 | 3.7 |
| 29/04/2017 | 3.6 |
| 29/04/2017 | 3.7 |
| 29/04/2017 | 3.5 |
| 29/04/2017 | 3.8 |
| 29/04/2017 | 3.4 |
| 29/04/2017 | 3.7 |
| 29/04/2017 | 3.4 |
| 29/04/2017 | 3.5 |
| 29/04/2017 | 3.8 |
| 29/04/2017 | 3.4 |
| 29/04/2017 | 3.4 |
| 29/04/2017 | 3.1 |
| 29/04/2017 | 3 |
| 29/04/2017 | 2.5 |
| 30/04/2017 | 2.6 |
| 30/04/2017 | 2.1 |
| 30/04/2017 | 2.4 |
| 30/04/2017 | 2.5 |
| 30/04/2017 | 2.5 |
| 30/04/2017 | 2.2 |
| 30/04/2017 | 2.5 |
| 30/04/2017 | 2.5 |
| 30/04/2017 | 3 |
| 30/04/2017 | 3.1 |
| 30/04/2017 | 3.5 |
| 30/04/2017 | 3.4 |
| 30/04/2017 | 3.5 |
| 30/04/2017 | 3.3 |
| 30/04/2017 | 3.1 |
| 30/04/2017 | 3 |
| 30/04/2017 | 3.4 |
| 30/04/2017 | 3.2 |
| 30/04/2017 | 3.5 |
| 30/04/2017 | 3.6 |
| 30/04/2017 | 3.6 |
| 30/04/2017 | 3.3 |
| 30/04/2017 | 2.6 |
| 30/04/2017 | 2.4 |
| 01/05/2017 | 2.5 |
| 01/05/2017 | 2.4 |
| 01/05/2017 | 2.2 |
| 01/05/2017 | 2.2 |
| 01/05/2017 | 2.3 |
| 01/05/2017 | 2.2 |
| 01/05/2017 | 2.7 |
| 01/05/2017 | 2.8 |
| 01/05/2017 | 3.3 |
| 01/05/2017 | 3.3 |
| 01/05/2017 | 3.5 |
| 01/05/2017 | 3.7 |
| 01/05/2017 | 3.6 |
| 01/05/2017 | 3.5 |
| 01/05/2017 | 3.1 |
| 01/05/2017 | 2.9 |
| 01/05/2017 | 3 |
| 01/05/2017 | 3.3 |
| 01/05/2017 | 3.2 |
| 01/05/2017 | 3.4 |
| 01/05/2017 | 3.4 |
| 01/05/2017 | 3.2 |
| 01/05/2017 | 2.8 |
| 01/05/2017 | 2.7 |
| 02/05/2017 | 2.6 |
| 02/05/2017 | 2.6 |
| 02/05/2017 | 2.6 |
| 02/05/2017 | 2.3 |
| 02/05/2017 | 2.8 |
| 02/05/2017 | 3.4 |
| 02/05/2017 | 3.7 |
| 02/05/2017 | 4.4 |
| 02/05/2017 | 4.4 |
| 02/05/2017 | 4.6 |
| 02/05/2017 | 4.8 |
| 02/05/2017 | 4.5 |
| 02/05/2017 | 4.6 |
| 02/05/2017 | 4.6 |
| 02/05/2017 | 4.2 |
| 02/05/2017 | 4.5 |
| 02/05/2017 | 4.6 |
| 02/05/2017 | 4.3 |
| 02/05/2017 | 4.2 |
| 02/05/2017 | 4 |
| 02/05/2017 | 3.7 |
| 02/05/2017 | 3.5 |
| 02/05/2017 | 3.2 |
| 02/05/2017 | 2.9 |
| 03/05/2017 | 2.7 |
| 03/05/2017 | 2.2 |
| 03/05/2017 | 2.2 |
| 03/05/2017 | 2.4 |
| 03/05/2017 | 2.8 |
| 03/05/2017 | 3.5 |
| 03/05/2017 | 3.9 |
| 03/05/2017 | 4.1 |
| 03/05/2017 | 4.7 |
| 03/05/2017 | 4.9 |
| 03/05/2017 | 4.6 |
| 03/05/2017 | 4.7 |
| 03/05/2017 | 4.9 |
| 03/05/2017 | 4.3 |
| 03/05/2017 | 4.4 |
| 03/05/2017 | 4.5 |
| 03/05/2017 | 4.6 |
| 03/05/2017 | 4.3 |
| 03/05/2017 | 4.2 |
| 03/05/2017 | 4.4 |
| 03/05/2017 | 3.7 |
| 03/05/2017 | 3.6 |
| 03/05/2017 | 3.2 |
| 03/05/2017 | 2.9 |
| 04/05/2017 | 2.7 |
| 04/05/2017 | 2.2 |
| 04/05/2017 | 2.2 |
| 04/05/2017 | 2.3 |
| 04/05/2017 | 2.8 |
| 04/05/2017 | 3.4 |
| 04/05/2017 | 3.8 |
| 04/05/2017 | 4.5 |
| 04/05/2017 | 4.5 |
| 04/05/2017 | 4.7 |
| 04/05/2017 | 4.9 |
| 04/05/2017 | 4.5 |
| 04/05/2017 | 4.6 |
| 04/05/2017 | 4.6 |
| 04/05/2017 | 4.6 |
| 04/05/2017 | 4.3 |
| 04/05/2017 | 4.3 |
| 04/05/2017 | 4.1 |
| 04/05/2017 | 4.5 |
| 04/05/2017 | 4.2 |
| 04/05/2017 | 4 |
| 04/05/2017 | 3.5 |
| 04/05/2017 | 3.2 |
| 04/05/2017 | 2.9 |
| 05/05/2017 | 2.7 |
| 05/05/2017 | 2.2 |
| 05/05/2017 | 2.6 |
| 05/05/2017 | 2.3 |
| 05/05/2017 | 2.7 |
| 05/05/2017 | 3.2 |
| 05/05/2017 | 4 |
| 05/05/2017 | 4.4 |
| 05/05/2017 | 4.5 |
| 05/05/2017 | 4.7 |
| 05/05/2017 | 4.9 |
| 05/05/2017 | 4.9 |
| 05/05/2017 | 4.8 |
| 05/05/2017 | 4.6 |
| 05/05/2017 | 4.6 |
| 05/05/2017 | 4.2 |
| 05/05/2017 | 4.1 |
| 05/05/2017 | 4.3 |
| 05/05/2017 | 3.9 |
| 05/05/2017 | 4.1 |
| 05/05/2017 | 3.6 |
| 05/05/2017 | 3.4 |
| 05/05/2017 | 3 |
| 05/05/2017 | 2.7 |
| 06/05/2017 | 2.6 |
| 06/05/2017 | 2.6 |
| 06/05/2017 | 2.4 |
| 06/05/2017 | 2.4 |
| 06/05/2017 | 2.2 |
| 06/05/2017 | 2.3 |
| 06/05/2017 | 2.7 |
| 06/05/2017 | 3.3 |
| 06/05/2017 | 3.3 |
| 06/05/2017 | 3.7 |
| 06/05/2017 | 3.6 |
| 06/05/2017 | 3.6 |
| 06/05/2017 | 3.5 |
| 06/05/2017 | 3.8 |
| 06/05/2017 | 3.5 |
| 06/05/2017 | 3.7 |
| 06/05/2017 | 3.4 |
| 06/05/2017 | 3.5 |
| 06/05/2017 | 3.8 |
| 06/05/2017 | 3.6 |
| 06/05/2017 | 3.1 |
| 06/05/2017 | 3 |
| 06/05/2017 | 3 |
| 06/05/2017 | 2.5 |
| 07/05/2017 | 2.6 |
| 07/05/2017 | 2.1 |
| 07/05/2017 | 2.4 |
| 07/05/2017 | 2.4 |
| 07/05/2017 | 2.4 |
| 07/05/2017 | 2.1 |
| 07/05/2017 | 2.4 |
| 07/05/2017 | 2.9 |
| 07/05/2017 | 3 |
| 07/05/2017 | 3.1 |
| 07/05/2017 | 3.5 |
| 07/05/2017 | 3.4 |
| 07/05/2017 | 3.5 |
| 07/05/2017 | 3.4 |
| 07/05/2017 | 3.1 |
| 07/05/2017 | 3 |
| 07/05/2017 | 3.4 |
| 07/05/2017 | 3.3 |
| 07/05/2017 | 3.5 |
| 07/05/2017 | 3.2 |
| 07/05/2017 | 3.4 |
| 07/05/2017 | 3.2 |
| 07/05/2017 | 3.1 |
| 07/05/2017 | 2.6 |
| 08/05/2017 | 2.6 |
| 08/05/2017 | 2.1 |
| 08/05/2017 | 2.1 |
| 08/05/2017 | 2.3 |
| 08/05/2017 | 2.8 |
| 08/05/2017 | 3 |
| 08/05/2017 | 3.8 |
| 08/05/2017 | 4 |
| 08/05/2017 | 4.6 |
| 08/05/2017 | 4.8 |
| 08/05/2017 | 4.6 |
| 08/05/2017 | 4.8 |
| 08/05/2017 | 4.4 |
| 08/05/2017 | 4.5 |
| 08/05/2017 | 4.6 |
| 08/05/2017 | 4.1 |
| 08/05/2017 | 4.2 |
| 08/05/2017 | 4.6 |
| 08/05/2017 | 4.4 |
| 08/05/2017 | 3.9 |
| 08/05/2017 | 3.8 |
| 08/05/2017 | 3.4 |
| 08/05/2017 | 3 |
| 08/05/2017 | 2.7 |
| 09/05/2017 | 2.6 |
| 09/05/2017 | 2.6 |
| 09/05/2017 | 2.6 |
| 09/05/2017 | 2.7 |
| 09/05/2017 | 2.6 |
| 09/05/2017 | 3.3 |
| 09/05/2017 | 4.1 |
| 09/05/2017 | 4.3 |
| 09/05/2017 | 4.4 |
| 09/05/2017 | 4.6 |
| 09/05/2017 | 4.8 |
| 09/05/2017 | 4.5 |
| 09/05/2017 | 4.6 |
| 09/05/2017 | 4.6 |
| 09/05/2017 | 4.2 |
| 09/05/2017 | 4.5 |
| 09/05/2017 | 4.5 |
| 09/05/2017 | 4.4 |
| 09/05/2017 | 4.1 |
| 09/05/2017 | 4.1 |
| 09/05/2017 | 4 |
| 09/05/2017 | 3.5 |
| 09/05/2017 | 3.1 |
| 09/05/2017 | 2.9 |
| 10/05/2017 | 2.7 |
| 10/05/2017 | 2.2 |
| 10/05/2017 | 2.2 |
| 10/05/2017 | 2.3 |
| 10/05/2017 | 2.7 |
| 10/05/2017 | 3.4 |
| 10/05/2017 | 3.8 |
| 10/05/2017 | 4.5 |
| 10/05/2017 | 4.6 |
| 10/05/2017 | 4.8 |
| 10/05/2017 | 4.6 |
| 10/05/2017 | 4.7 |
| 10/05/2017 | 4.9 |
| 10/05/2017 | 4.4 |
| 10/05/2017 | 4.4 |
| 10/05/2017 | 4.5 |
| 10/05/2017 | 4.5 |
| 10/05/2017 | 4.3 |
| 10/05/2017 | 4.2 |
| 10/05/2017 | 4 |
| 10/05/2017 | 3.9 |
| 10/05/2017 | 3.6 |
| 10/05/2017 | 3.2 |
| 10/05/2017 | 2.9 |
| 11/05/2017 | 2.7 |
| 11/05/2017 | 2.2 |
| 11/05/2017 | 2.1 |
| 11/05/2017 | 2.3 |
| 11/05/2017 | 2.6 |
| 11/05/2017 | 3.3 |
| 11/05/2017 | 3.7 |
| 11/05/2017 | 4.4 |
| 11/05/2017 | 4.4 |
| 11/05/2017 | 4.7 |
| 11/05/2017 | 4.9 |
| 11/05/2017 | 4.5 |
| 11/05/2017 | 4.6 |
| 11/05/2017 | 4.6 |
| 11/05/2017 | 4.6 |
| 11/05/2017 | 4.2 |
| 11/05/2017 | 4.2 |
| 11/05/2017 | 4.1 |
| 11/05/2017 | 4.4 |
| 11/05/2017 | 4.3 |
| 11/05/2017 | 3.8 |
| 11/05/2017 | 3.5 |
| 11/05/2017 | 3.2 |
| 11/05/2017 | 2.9 |
| 12/05/2017 | 2.7 |
| 12/05/2017 | 2.2 |
| 12/05/2017 | 2.6 |
| 12/05/2017 | 2.7 |
| 12/05/2017 | 2.5 |
| 12/05/2017 | 3.1 |
| 12/05/2017 | 3.9 |
| 12/05/2017 | 4.3 |
| 12/05/2017 | 4.4 |
| 12/05/2017 | 4.7 |
| 12/05/2017 | 4.9 |
| 12/05/2017 | 4.9 |
| 12/05/2017 | 4.8 |
| 12/05/2017 | 4.6 |
| 12/05/2017 | 4.6 |
| 12/05/2017 | 4.1 |
| 12/05/2017 | 4 |
| 12/05/2017 | 4.3 |
| 12/05/2017 | 3.9 |
| 12/05/2017 | 3.7 |
| 12/05/2017 | 3.8 |
| 12/05/2017 | 3.4 |
| 12/05/2017 | 2.9 |
| 12/05/2017 | 2.7 |
| 13/05/2017 | 2.6 |
| 13/05/2017 | 2.6 |
| 13/05/2017 | 2.4 |
| 13/05/2017 | 2.4 |
| 13/05/2017 | 2.5 |
| 13/05/2017 | 2.7 |
| 13/05/2017 | 2.6 |
| 13/05/2017 | 3.3 |
| 13/05/2017 | 3.2 |
| 13/05/2017 | 3.6 |
| 13/05/2017 | 3.6 |
| 13/05/2017 | 3.6 |
| 13/05/2017 | 3.5 |
| 13/05/2017 | 3.8 |
| 13/05/2017 | 3.5 |
| 13/05/2017 | 3.6 |
| 13/05/2017 | 3.3 |
| 13/05/2017 | 3.6 |
| 13/05/2017 | 3.7 |
| 13/05/2017 | 3.7 |
| 13/05/2017 | 3.4 |
| 13/05/2017 | 3 |
| 13/05/2017 | 3 |
| 13/05/2017 | 2.5 |
| 14/05/2017 | 2.6 |
| 14/05/2017 | 2.1 |
| 14/05/2017 | 2.4 |
| 14/05/2017 | 2.4 |
| 14/05/2017 | 2.3 |
| 14/05/2017 | 2.5 |
| 14/05/2017 | 2.4 |
| 14/05/2017 | 2.9 |
| 14/05/2017 | 2.9 |
| 14/05/2017 | 3.1 |
| 14/05/2017 | 3.5 |
| 14/05/2017 | 3.4 |
| 14/05/2017 | 3.5 |
| 14/05/2017 | 3.4 |
| 14/05/2017 | 3.1 |
| 14/05/2017 | 2.9 |
| 14/05/2017 | 3.3 |
| 14/05/2017 | 3.3 |
| 14/05/2017 | 3.4 |
| 14/05/2017 | 3.4 |
| 14/05/2017 | 3.2 |
| 14/05/2017 | 3.2 |
| 14/05/2017 | 3.1 |
| 14/05/2017 | 2.6 |
| 15/05/2017 | 2.5 |
| 15/05/2017 | 2.1 |
| 15/05/2017 | 2.1 |
| 15/05/2017 | 2.2 |
| 15/05/2017 | 2.6 |
| 15/05/2017 | 3.4 |
| 15/05/2017 | 3.7 |
| 15/05/2017 | 4.4 |
| 15/05/2017 | 4.5 |
| 15/05/2017 | 4.8 |
| 15/05/2017 | 4.6 |
| 15/05/2017 | 4.8 |
| 15/05/2017 | 4.5 |
| 15/05/2017 | 4.5 |
| 15/05/2017 | 4.6 |
| 15/05/2017 | 4.1 |
| 15/05/2017 | 4.1 |
| 15/05/2017 | 4.1 |
| 15/05/2017 | 4.4 |
| 15/05/2017 | 4 |
| 15/05/2017 | 3.6 |
| 15/05/2017 | 3.4 |
| 15/05/2017 | 3 |
| 15/05/2017 | 2.7 |
| 16/05/2017 | 2.6 |
| 16/05/2017 | 2.6 |
| 16/05/2017 | 2.5 |
| 16/05/2017 | 2.7 |
| 16/05/2017 | 2.5 |
| 16/05/2017 | 3.2 |
| 16/05/2017 | 4 |
| 16/05/2017 | 4.3 |
| 16/05/2017 | 4.3 |
| 16/05/2017 | 4.6 |
| 16/05/2017 | 4.8 |
| 16/05/2017 | 4.5 |
| 16/05/2017 | 4.6 |
| 16/05/2017 | 4.6 |
| 16/05/2017 | 4.2 |
| 16/05/2017 | 4.4 |
| 16/05/2017 | 4.5 |
| 16/05/2017 | 4.4 |
| 16/05/2017 | 4.6 |
| 16/05/2017 | 4.2 |
| 16/05/2017 | 3.7 |
| 16/05/2017 | 3.5 |
| 16/05/2017 | 3.1 |
| 16/05/2017 | 2.9 |
| 17/05/2017 | 2.7 |
| 17/05/2017 | 2.2 |
| 17/05/2017 | 2.6 |
| 17/05/2017 | 2.2 |
| 17/05/2017 | 2.6 |
| 17/05/2017 | 3.3 |
| 17/05/2017 | 3.7 |
| 17/05/2017 | 4.4 |
| 17/05/2017 | 4.6 |
| 17/05/2017 | 4.8 |
| 17/05/2017 | 4.6 |
| 17/05/2017 | 4.7 |
| 17/05/2017 | 4.9 |
| 17/05/2017 | 4.4 |
| 17/05/2017 | 4.4 |
| 17/05/2017 | 4.4 |
| 17/05/2017 | 4.4 |
| 17/05/2017 | 4.4 |
| 17/05/2017 | 4.1 |
| 17/05/2017 | 4.1 |
| 17/05/2017 | 3.7 |
| 17/05/2017 | 3.5 |
| 17/05/2017 | 3.2 |
| 17/05/2017 | 2.9 |
| 18/05/2017 | 2.7 |
| 18/05/2017 | 2.2 |
| 18/05/2017 | 2.6 |
| 18/05/2017 | 2.7 |
| 18/05/2017 | 2.5 |
| 18/05/2017 | 3.2 |
| 18/05/2017 | 4.1 |
| 18/05/2017 | 4.3 |
| 18/05/2017 | 4.3 |
| 18/05/2017 | 4.7 |
| 18/05/2017 | 4.4 |
| 18/05/2017 | 4.5 |
| 18/05/2017 | 4.6 |
| 18/05/2017 | 4.6 |
| 18/05/2017 | 4.7 |
| 18/05/2017 | 4.2 |
| 18/05/2017 | 4.1 |
| 18/05/2017 | 4.2 |
| 18/05/2017 | 4.4 |
| 18/05/2017 | 3.9 |
| 18/05/2017 | 4 |
| 18/05/2017 | 3.5 |
| 18/05/2017 | 3.1 |
| 18/05/2017 | 2.9 |
| 19/05/2017 | 2.7 |
| 19/05/2017 | 2.1 |
| 19/05/2017 | 2.6 |
| 19/05/2017 | 2.7 |
| 19/05/2017 | 2.9 |
| 19/05/2017 | 3 |
| 19/05/2017 | 3.8 |
| 19/05/2017 | 4.2 |
| 19/05/2017 | 4.4 |
| 19/05/2017 | 4.7 |
| 19/05/2017 | 4.9 |
| 19/05/2017 | 4.9 |
| 19/05/2017 | 4.3 |
| 19/05/2017 | 4.6 |
| 19/05/2017 | 4.6 |
| 19/05/2017 | 4.1 |
| 19/05/2017 | 4.4 |
| 19/05/2017 | 4.4 |
| 19/05/2017 | 4.3 |
| 19/05/2017 | 3.8 |
| 19/05/2017 | 3.6 |
| 19/05/2017 | 3.4 |
| 19/05/2017 | 2.9 |
| 19/05/2017 | 2.6 |
| 20/05/2017 | 2.6 |
| 20/05/2017 | 2.6 |
| 20/05/2017 | 2.3 |
| 20/05/2017 | 2.3 |
| 20/05/2017 | 2.4 |
| 20/05/2017 | 2.6 |
| 20/05/2017 | 2.6 |
| 20/05/2017 | 3.2 |
| 20/05/2017 | 3.7 |
| 20/05/2017 | 3.6 |
| 20/05/2017 | 3.6 |
| 20/05/2017 | 3.6 |
| 20/05/2017 | 3.5 |
| 20/05/2017 | 3.3 |
| 20/05/2017 | 3.5 |
| 20/05/2017 | 3.6 |
| 20/05/2017 | 3.2 |
| 20/05/2017 | 3.6 |
| 20/05/2017 | 3.7 |
| 20/05/2017 | 3.4 |
| 20/05/2017 | 3.2 |
| 20/05/2017 | 3 |
| 20/05/2017 | 3 |
| 20/05/2017 | 2.5 |
| 21/05/2017 | 2.6 |
| 21/05/2017 | 2.1 |
| 21/05/2017 | 2.4 |
| 21/05/2017 | 2.3 |
| 21/05/2017 | 2.2 |
| 21/05/2017 | 2.4 |
| 21/05/2017 | 2.3 |
| 21/05/2017 | 2.8 |
| 21/05/2017 | 2.9 |
| 21/05/2017 | 3.1 |
| 21/05/2017 | 3.5 |
| 21/05/2017 | 3.4 |
| 21/05/2017 | 3.5 |
| 21/05/2017 | 3.4 |
| 21/05/2017 | 3.1 |
| 21/05/2017 | 2.9 |
| 21/05/2017 | 3.2 |
| 21/05/2017 | 3.4 |
| 21/05/2017 | 3.4 |
| 21/05/2017 | 3 |
| 21/05/2017 | 3.4 |
| 21/05/2017 | 3.2 |
| 21/05/2017 | 3 |
| 21/05/2017 | 2.6 |
| 22/05/2017 | 2.5 |
| 22/05/2017 | 2.1 |
| 22/05/2017 | 2.1 |
| 22/05/2017 | 2.2 |
| 22/05/2017 | 2.5 |
| 22/05/2017 | 3.3 |
| 22/05/2017 | 3.6 |
| 22/05/2017 | 4.3 |
| 22/05/2017 | 4.5 |
| 22/05/2017 | 4.8 |
| 22/05/2017 | 4.6 |
| 22/05/2017 | 4.8 |
| 22/05/2017 | 4.5 |
| 22/05/2017 | 4.5 |
| 22/05/2017 | 4.6 |
| 22/05/2017 | 4.6 |
| 22/05/2017 | 4.5 |
| 22/05/2017 | 4.2 |
| 22/05/2017 | 4.3 |
| 22/05/2017 | 4.1 |
| 22/05/2017 | 3.8 |
| 22/05/2017 | 3.3 |
| 22/05/2017 | 3 |
| 22/05/2017 | 2.7 |
| 23/05/2017 | 2.6 |
| 23/05/2017 | 2.6 |
| 23/05/2017 | 2.5 |
| 23/05/2017 | 2.6 |
| 23/05/2017 | 2.9 |
| 23/05/2017 | 3.1 |
| 23/05/2017 | 3.9 |
| 23/05/2017 | 4.2 |
| 23/05/2017 | 4.3 |
| 23/05/2017 | 4.6 |
| 23/05/2017 | 4.8 |
| 23/05/2017 | 4.4 |
| 23/05/2017 | 4.6 |
| 23/05/2017 | 4.6 |
| 23/05/2017 | 4.2 |
| 23/05/2017 | 4.4 |
| 23/05/2017 | 4.4 |
| 23/05/2017 | 4.5 |
| 23/05/2017 | 4.5 |
| 23/05/2017 | 3.8 |
| 23/05/2017 | 4 |
| 23/05/2017 | 3.5 |
| 23/05/2017 | 3.1 |
| 23/05/2017 | 2.9 |
| 24/05/2017 | 2.7 |
| 24/05/2017 | 2.1 |
| 24/05/2017 | 2.6 |
| 24/05/2017 | 2.6 |
| 24/05/2017 | 2.7 |
| 24/05/2017 | 3.4 |
| 24/05/2017 | 3.5 |
| 24/05/2017 | 3.9 |
| 24/05/2017 | 4.3 |
| 24/05/2017 | 4.4 |
| 24/05/2017 | 4.7 |
| 24/05/2017 | 4.8 |
| 24/05/2017 | 4.8 |
| 24/05/2017 | 4.7 |
| 24/05/2017 | 4.1 |
| 24/05/2017 | 4.2 |
| 24/05/2017 | 4.2 |
| 24/05/2017 | 4.3 |
| 24/05/2017 | 4.3 |
| 24/05/2017 | 4 |
| 24/05/2017 | 3.9 |
| 24/05/2017 | 3.3 |
| 24/05/2017 | 3 |
| 24/05/2017 | 2.4 |
| 25/05/2017 | 2.4 |
| 25/05/2017 | 2.4 |
| 25/05/2017 | 2.1 |
| 25/05/2017 | 2 |
| 25/05/2017 | 2.4 |
| 25/05/2017 | 2.4 |
| 25/05/2017 | 2.5 |
| 25/05/2017 | 3.1 |
| 25/05/2017 | 3.2 |
| 25/05/2017 | 3.3 |
| 25/05/2017 | 3.5 |
| 25/05/2017 | 3.7 |
| 25/05/2017 | 3.1 |
| 25/05/2017 | 3 |
| 25/05/2017 | 3.2 |
| 25/05/2017 | 3.3 |
| 25/05/2017 | 3.3 |
| 25/05/2017 | 3.4 |
| 25/05/2017 | 3.5 |
| 25/05/2017 | 3.3 |
| 25/05/2017 | 3.2 |
| 25/05/2017 | 3.1 |
| 25/05/2017 | 2.7 |
| 25/05/2017 | 2.5 |
| 26/05/2017 | 2.4 |
| 26/05/2017 | 2.4 |
| 26/05/2017 | 2.2 |
| 26/05/2017 | 2.1 |
| 26/05/2017 | 2.2 |
| 26/05/2017 | 2.7 |
| 26/05/2017 | 3 |
| 26/05/2017 | 3.2 |
| 26/05/2017 | 3.5 |
| 26/05/2017 | 4.1 |
| 26/05/2017 | 4 |
| 26/05/2017 | 4.1 |
| 26/05/2017 | 4.1 |
| 26/05/2017 | 3.9 |
| 26/05/2017 | 3.9 |
| 26/05/2017 | 3.8 |
| 26/05/2017 | 3.7 |
| 26/05/2017 | 4 |
| 26/05/2017 | 3.8 |
| 26/05/2017 | 3.5 |
| 26/05/2017 | 3.2 |
| 26/05/2017 | 3.2 |
| 26/05/2017 | 3.1 |
| 26/05/2017 | 2.6 |
| 27/05/2017 | 2.6 |
| 27/05/2017 | 2.5 |
| 27/05/2017 | 2.3 |
| 27/05/2017 | 2.2 |
| 27/05/2017 | 2.3 |
| 27/05/2017 | 2.5 |
| 27/05/2017 | 2.5 |
| 27/05/2017 | 3.1 |
| 27/05/2017 | 3.6 |
| 27/05/2017 | 3.6 |
| 27/05/2017 | 3.6 |
| 27/05/2017 | 3.6 |
| 27/05/2017 | 3.5 |
| 27/05/2017 | 3.4 |
| 27/05/2017 | 3.5 |
| 27/05/2017 | 3.6 |
| 27/05/2017 | 3.7 |
| 27/05/2017 | 3.7 |
| 27/05/2017 | 3.6 |
| 27/05/2017 | 3.5 |
| 27/05/2017 | 3.5 |
| 27/05/2017 | 3 |
| 27/05/2017 | 3 |
| 27/05/2017 | 2.5 |
| 28/05/2017 | 2.6 |
| 28/05/2017 | 2.1 |
| 28/05/2017 | 2.4 |
| 28/05/2017 | 2.3 |
| 28/05/2017 | 2.1 |
| 28/05/2017 | 2.4 |
| 28/05/2017 | 2.3 |
| 28/05/2017 | 2.8 |
| 28/05/2017 | 2.9 |
| 28/05/2017 | 3.1 |
| 28/05/2017 | 3.5 |
| 28/05/2017 | 3.4 |
| 28/05/2017 | 3.5 |
| 28/05/2017 | 3.4 |
| 28/05/2017 | 3.1 |
| 28/05/2017 | 3.4 |
| 28/05/2017 | 3.2 |
| 28/05/2017 | 3.4 |
| 28/05/2017 | 3.3 |
| 28/05/2017 | 3.3 |
| 28/05/2017 | 3.2 |
| 28/05/2017 | 3.2 |
| 28/05/2017 | 3 |
| 28/05/2017 | 2.6 |
| 29/05/2017 | 2.5 |
| 29/05/2017 | 2.1 |
| 29/05/2017 | 2.1 |
| 29/05/2017 | 2.2 |
| 29/05/2017 | 2.4 |
| 29/05/2017 | 3.2 |
| 29/05/2017 | 4 |
| 29/05/2017 | 4.3 |
| 29/05/2017 | 4.4 |
| 29/05/2017 | 4.8 |
| 29/05/2017 | 4.6 |
| 29/05/2017 | 4.8 |
| 29/05/2017 | 4.5 |
| 29/05/2017 | 4.6 |
| 29/05/2017 | 4.6 |
| 29/05/2017 | 4.6 |
| 29/05/2017 | 4.5 |
| 29/05/2017 | 4.2 |
| 29/05/2017 | 4.3 |
| 29/05/2017 | 3.8 |
| 29/05/2017 | 3.6 |
| 29/05/2017 | 3.3 |
| 29/05/2017 | 3 |
| 29/05/2017 | 2.8 |
| 30/05/2017 | 2.6 |
| 30/05/2017 | 2.6 |
| 30/05/2017 | 2.5 |
| 30/05/2017 | 2.6 |
| 30/05/2017 | 2.8 |
| 30/05/2017 | 3 |
| 30/05/2017 | 3.9 |
| 30/05/2017 | 4.1 |
| 30/05/2017 | 4.2 |
| 30/05/2017 | 4.6 |
| 30/05/2017 | 4.9 |
| 30/05/2017 | 4.5 |
| 30/05/2017 | 4.7 |
| 30/05/2017 | 4.7 |
| 30/05/2017 | 4.3 |
| 30/05/2017 | 4.4 |
| 30/05/2017 | 4.4 |
| 30/05/2017 | 4.5 |
| 30/05/2017 | 4.5 |
| 30/05/2017 | 4.1 |
| 30/05/2017 | 3.8 |
| 30/05/2017 | 3.5 |
| 30/05/2017 | 3.2 |
| 30/05/2017 | 2.9 |
| 31/05/2017 | 2.7 |
| 31/05/2017 | 2.2 |
| 31/05/2017 | 2.6 |
| 31/05/2017 | 2.7 |
| 31/05/2017 | 2.9 |
| 31/05/2017 | 3.2 |
| 31/05/2017 | 4.1 |
| 31/05/2017 | 4.3 |
| 31/05/2017 | 4.5 |
| 31/05/2017 | 4.9 |
| 31/05/2017 | 4.7 |
| 31/05/2017 | 4.8 |
| 31/05/2017 | 4.5 |
| 31/05/2017 | 4.5 |
| 31/05/2017 | 4.5 |
| 31/05/2017 | 4.5 |
| 31/05/2017 | 4.4 |
| 31/05/2017 | 4.5 |
| 31/05/2017 | 4.6 |
| 31/05/2017 | 4.1 |
| 31/05/2017 | 3.8 |
| 31/05/2017 | 3.6 |
| 31/05/2017 | 3.2 |
| 31/05/2017 | 2.9 |
| 01/06/2017 | 2.7 |
| 01/06/2017 | 2.2 |
| 01/06/2017 | 2.6 |
| 01/06/2017 | 2.7 |
| 01/06/2017 | 2.8 |
| 01/06/2017 | 3.1 |
| 01/06/2017 | 4 |
| 01/06/2017 | 4.2 |
| 01/06/2017 | 4.3 |
| 01/06/2017 | 4.7 |
| 01/06/2017 | 4.5 |
| 01/06/2017 | 4.6 |
| 01/06/2017 | 4.7 |
| 01/06/2017 | 4.7 |
| 01/06/2017 | 4.3 |
| 01/06/2017 | 4.3 |
| 01/06/2017 | 4.1 |
| 01/06/2017 | 4.3 |
| 01/06/2017 | 4.3 |
| 01/06/2017 | 3.9 |
| 01/06/2017 | 3.7 |
| 01/06/2017 | 3.5 |
| 01/06/2017 | 3.2 |
| 01/06/2017 | 2.9 |
| 02/06/2017 | 2.7 |
| 02/06/2017 | 2.2 |
| 02/06/2017 | 2.6 |
| 02/06/2017 | 2.6 |
| 02/06/2017 | 2.8 |
| 02/06/2017 | 3.4 |
| 02/06/2017 | 3.8 |
| 02/06/2017 | 4.1 |
| 02/06/2017 | 4.3 |
| 02/06/2017 | 4.7 |
| 02/06/2017 | 4.5 |
| 02/06/2017 | 4.5 |
| 02/06/2017 | 4.4 |
| 02/06/2017 | 4.3 |
| 02/06/2017 | 4.2 |
| 02/06/2017 | 4.2 |
| 02/06/2017 | 4 |
| 02/06/2017 | 4 |
| 02/06/2017 | 4.3 |
| 02/06/2017 | 4 |
| 02/06/2017 | 3.8 |
| 02/06/2017 | 3.4 |
| 02/06/2017 | 3 |
| 02/06/2017 | 2.7 |
| 03/06/2017 | 2.7 |
| 03/06/2017 | 2.6 |
| 03/06/2017 | 2.4 |
| 03/06/2017 | 2.3 |
| 03/06/2017 | 2.3 |
| 03/06/2017 | 2.6 |
| 03/06/2017 | 2.5 |
| 03/06/2017 | 3.1 |
| 03/06/2017 | 3.7 |
| 03/06/2017 | 3.7 |
| 03/06/2017 | 3.7 |
| 03/06/2017 | 3.7 |
| 03/06/2017 | 3.6 |
| 03/06/2017 | 3.5 |
| 03/06/2017 | 3.6 |
| 03/06/2017 | 3.2 |
| 03/06/2017 | 3.3 |
| 03/06/2017 | 3.7 |
| 03/06/2017 | 3.7 |
| 03/06/2017 | 3.6 |
| 03/06/2017 | 3.5 |
| 03/06/2017 | 3.1 |
| 03/06/2017 | 2.6 |
| 03/06/2017 | 2.4 |
| 04/06/2017 | 2.4 |
| 04/06/2017 | 2.3 |
| 04/06/2017 | 2.5 |
| 04/06/2017 | 2.3 |
| 04/06/2017 | 2.2 |
| 04/06/2017 | 2.2 |
| 04/06/2017 | 2.4 |
| 04/06/2017 | 2.6 |
| 04/06/2017 | 3 |
| 04/06/2017 | 3.5 |
| 04/06/2017 | 3.5 |
| 04/06/2017 | 3.1 |
| 04/06/2017 | 3.1 |
| 04/06/2017 | 3.1 |
| 04/06/2017 | 3.4 |
| 04/06/2017 | 3.3 |
| 04/06/2017 | 3.1 |
| 04/06/2017 | 3.3 |
| 04/06/2017 | 3.5 |
| 04/06/2017 | 3.2 |
| 04/06/2017 | 3.4 |
| 04/06/2017 | 3.1 |
| 04/06/2017 | 3 |
| 04/06/2017 | 2.4 |
| 05/06/2017 | 2.4 |
| 05/06/2017 | 2.3 |
| 05/06/2017 | 2.5 |
| 05/06/2017 | 2.3 |
| 05/06/2017 | 2.2 |
| 05/06/2017 | 2.2 |
| 05/06/2017 | 2.4 |
| 05/06/2017 | 2.6 |
| 05/06/2017 | 3 |
| 05/06/2017 | 3.5 |
| 05/06/2017 | 3.5 |
| 05/06/2017 | 3.1 |
| 05/06/2017 | 3.1 |
| 05/06/2017 | 3.1 |
| 05/06/2017 | 2.9 |
| 05/06/2017 | 3.4 |
| 05/06/2017 | 3.2 |
| 05/06/2017 | 3.3 |
| 05/06/2017 | 3.5 |
| 05/06/2017 | 3.2 |
| 05/06/2017 | 3.4 |
| 05/06/2017 | 3.1 |
| 05/06/2017 | 3.1 |
| 05/06/2017 | 2.9 |
| 06/06/2017 | 2.7 |
| 06/06/2017 | 2.6 |
| 06/06/2017 | 2.5 |
| 06/06/2017 | 2.5 |
| 06/06/2017 | 2.6 |
| 06/06/2017 | 3.2 |
| 06/06/2017 | 3.8 |
| 06/06/2017 | 4.2 |
| 06/06/2017 | 4.1 |
| 06/06/2017 | 4.7 |
| 06/06/2017 | 4.5 |
| 06/06/2017 | 4.6 |
| 06/06/2017 | 4.7 |
| 06/06/2017 | 4.6 |
| 06/06/2017 | 4.2 |
| 06/06/2017 | 4.4 |
| 06/06/2017 | 4.5 |
| 06/06/2017 | 4.4 |
| 06/06/2017 | 4.4 |
| 06/06/2017 | 4 |
| 06/06/2017 | 3.8 |
| 06/06/2017 | 3.3 |
| 06/06/2017 | 3.2 |
| 06/06/2017 | 2.5 |
| 07/06/2017 | 2.3 |
| 07/06/2017 | 2.2 |
| 07/06/2017 | 2.6 |
| 07/06/2017 | 2.6 |
| 07/06/2017 | 2.6 |
| 07/06/2017 | 3.4 |
| 07/06/2017 | 3.4 |
| 07/06/2017 | 3.9 |
| 07/06/2017 | 4.4 |
| 07/06/2017 | 4.5 |
| 07/06/2017 | 4.8 |
| 07/06/2017 | 4.9 |
| 07/06/2017 | 4.5 |
| 07/06/2017 | 4.4 |
| 07/06/2017 | 4.4 |
| 07/06/2017 | 4.5 |
| 07/06/2017 | 4.4 |
| 07/06/2017 | 4.4 |
| 07/06/2017 | 4.4 |
| 07/06/2017 | 4 |
| 07/06/2017 | 3.8 |
| 07/06/2017 | 3.4 |
| 07/06/2017 | 3.2 |
| 07/06/2017 | 2.5 |
| 08/06/2017 | 2.3 |
| 08/06/2017 | 2.2 |
| 08/06/2017 | 2.6 |
| 08/06/2017 | 2.6 |
| 08/06/2017 | 2.6 |
| 08/06/2017 | 3.3 |
| 08/06/2017 | 3.8 |
| 08/06/2017 | 4.3 |
| 08/06/2017 | 4.2 |
| 08/06/2017 | 4.8 |
| 08/06/2017 | 4.7 |
| 08/06/2017 | 4.7 |
| 08/06/2017 | 4.8 |
| 08/06/2017 | 4.7 |
| 08/06/2017 | 4.1 |
| 08/06/2017 | 4.2 |
| 08/06/2017 | 4.2 |
| 08/06/2017 | 4.2 |
| 08/06/2017 | 4.2 |
| 08/06/2017 | 3.9 |
| 08/06/2017 | 3.7 |
| 08/06/2017 | 3.3 |
| 08/06/2017 | 3.2 |
| 08/06/2017 | 2.5 |
| 09/06/2017 | 2.3 |
| 09/06/2017 | 2.2 |
| 09/06/2017 | 2.6 |
| 09/06/2017 | 2.6 |
| 09/06/2017 | 2.5 |
| 09/06/2017 | 3.1 |
| 09/06/2017 | 3.6 |
| 09/06/2017 | 4.2 |
| 09/06/2017 | 4.2 |
| 09/06/2017 | 4.3 |
| 09/06/2017 | 4.6 |
| 09/06/2017 | 4.6 |
| 09/06/2017 | 4.5 |
| 09/06/2017 | 4.2 |
| 09/06/2017 | 4.1 |
| 09/06/2017 | 4.2 |
| 09/06/2017 | 4.1 |
| 09/06/2017 | 3.9 |
| 09/06/2017 | 4.2 |
| 09/06/2017 | 3.4 |
| 09/06/2017 | 3.3 |
| 09/06/2017 | 3.2 |
| 09/06/2017 | 3 |
| 09/06/2017 | 2.9 |
| 10/06/2017 | 2.3 |
| 10/06/2017 | 2.2 |
| 10/06/2017 | 2.4 |
| 10/06/2017 | 2.3 |
| 10/06/2017 | 2.4 |
| 10/06/2017 | 2.6 |
| 10/06/2017 | 2.5 |
| 10/06/2017 | 3.2 |
| 10/06/2017 | 3.7 |
| 10/06/2017 | 3.7 |
| 10/06/2017 | 3.8 |
| 10/06/2017 | 3.8 |
| 10/06/2017 | 3.7 |
| 10/06/2017 | 3.6 |
| 10/06/2017 | 3.7 |
| 10/06/2017 | 3.4 |
| 10/06/2017 | 3.5 |
| 10/06/2017 | 3.8 |
| 10/06/2017 | 3.8 |
| 10/06/2017 | 3.2 |
| 10/06/2017 | 3.4 |
| 10/06/2017 | 3.1 |
| 10/06/2017 | 2.7 |
| 10/06/2017 | 2.7 |
| 11/06/2017 | 2.2 |
| 11/06/2017 | 2.2 |
| 11/06/2017 | 2.5 |
| 11/06/2017 | 2.3 |
| 11/06/2017 | 2.1 |
| 11/06/2017 | 2.4 |
| 11/06/2017 | 2.3 |
| 11/06/2017 | 2.8 |
| 11/06/2017 | 2.9 |
| 11/06/2017 | 3.2 |
| 11/06/2017 | 3.2 |
| 11/06/2017 | 3.6 |
| 11/06/2017 | 3.2 |
| 11/06/2017 | 3.1 |
| 11/06/2017 | 3.3 |
| 11/06/2017 | 3.2 |
| 11/06/2017 | 3.5 |
| 11/06/2017 | 3.6 |
| 11/06/2017 | 3.5 |
| 11/06/2017 | 3.4 |
| 11/06/2017 | 3.2 |
| 11/06/2017 | 3.4 |
| 11/06/2017 | 2.8 |
| 11/06/2017 | 2.8 |
| 12/06/2017 | 2.2 |
| 12/06/2017 | 2.2 |
| 12/06/2017 | 2.2 |
| 12/06/2017 | 2.2 |
| 12/06/2017 | 2.5 |
| 12/06/2017 | 3.3 |
| 12/06/2017 | 3.6 |
| 12/06/2017 | 4.3 |
| 12/06/2017 | 4.5 |
| 12/06/2017 | 4.4 |
| 12/06/2017 | 4.8 |
| 12/06/2017 | 4.5 |
| 12/06/2017 | 4.8 |
| 12/06/2017 | 4.3 |
| 12/06/2017 | 4.4 |
| 12/06/2017 | 4.4 |
| 12/06/2017 | 4.4 |
| 12/06/2017 | 4.4 |
| 12/06/2017 | 4.5 |
| 12/06/2017 | 4 |
| 12/06/2017 | 3.6 |
| 12/06/2017 | 3.5 |
| 12/06/2017 | 3.2 |
| 12/06/2017 | 2.5 |
| 13/06/2017 | 2.3 |
| 13/06/2017 | 2.2 |
| 13/06/2017 | 2.6 |
| 13/06/2017 | 2.7 |
| 13/06/2017 | 2.8 |
| 13/06/2017 | 3.1 |
| 13/06/2017 | 3.9 |
| 13/06/2017 | 4.2 |
| 13/06/2017 | 4.3 |
| 13/06/2017 | 4.7 |
| 13/06/2017 | 4.5 |
| 13/06/2017 | 4.7 |
| 13/06/2017 | 4.4 |
| 13/06/2017 | 4.5 |
| 13/06/2017 | 4.6 |
| 13/06/2017 | 4.3 |
| 13/06/2017 | 4.3 |
| 13/06/2017 | 4.2 |
| 13/06/2017 | 4.2 |
| 13/06/2017 | 3.8 |
| 13/06/2017 | 3.8 |
| 13/06/2017 | 3.6 |
| 13/06/2017 | 2.9 |
| 13/06/2017 | 2.6 |
| 14/06/2017 | 2.4 |
| 14/06/2017 | 2.3 |
| 14/06/2017 | 2.2 |
| 14/06/2017 | 2.7 |
| 14/06/2017 | 2.9 |
| 14/06/2017 | 3.2 |
| 14/06/2017 | 4.1 |
| 14/06/2017 | 4.4 |
| 14/06/2017 | 4.6 |
| 14/06/2017 | 4.5 |
| 14/06/2017 | 4.8 |
| 14/06/2017 | 5 |
| 14/06/2017 | 4.7 |
| 14/06/2017 | 4.8 |
| 14/06/2017 | 4.3 |
| 14/06/2017 | 4.3 |
| 14/06/2017 | 4.3 |
| 14/06/2017 | 4.2 |
| 14/06/2017 | 4.3 |
| 14/06/2017 | 3.8 |
| 14/06/2017 | 3.8 |
| 14/06/2017 | 3.7 |
| 14/06/2017 | 2.9 |
| 14/06/2017 | 2.7 |
| 15/06/2017 | 2.4 |
| 15/06/2017 | 2.3 |
| 15/06/2017 | 2.2 |
| 15/06/2017 | 2.7 |
| 15/06/2017 | 2.9 |
| 15/06/2017 | 3.1 |
| 15/06/2017 | 4 |
| 15/06/2017 | 4.2 |
| 15/06/2017 | 4.4 |
| 15/06/2017 | 4.8 |
| 15/06/2017 | 4.7 |
| 15/06/2017 | 4.8 |
| 15/06/2017 | 4.5 |
| 15/06/2017 | 4.5 |
| 15/06/2017 | 4.6 |
| 15/06/2017 | 4.6 |
| 15/06/2017 | 4.5 |
| 15/06/2017 | 4.5 |
| 15/06/2017 | 4.5 |
| 15/06/2017 | 4.1 |
| 15/06/2017 | 3.7 |
| 15/06/2017 | 3.7 |
| 15/06/2017 | 2.9 |
| 15/06/2017 | 2.7 |
| 16/06/2017 | 2.4 |
| 16/06/2017 | 2.3 |
| 16/06/2017 | 2.2 |
| 16/06/2017 | 2.7 |
| 16/06/2017 | 2.8 |
| 16/06/2017 | 3.5 |
| 16/06/2017 | 3.8 |
| 16/06/2017 | 4.2 |
| 16/06/2017 | 4.4 |
| 16/06/2017 | 4.9 |
| 16/06/2017 | 4.6 |
| 16/06/2017 | 4.7 |
| 16/06/2017 | 4.7 |
| 16/06/2017 | 4.5 |
| 16/06/2017 | 4.5 |
| 16/06/2017 | 4.5 |
| 16/06/2017 | 4.4 |
| 16/06/2017 | 4.2 |
| 16/06/2017 | 4 |
| 16/06/2017 | 3.7 |
| 16/06/2017 | 3.8 |
| 16/06/2017 | 3.6 |
| 16/06/2017 | 3.2 |
| 16/06/2017 | 2.5 |
| 17/06/2017 | 2.3 |
| 17/06/2017 | 2.2 |
| 17/06/2017 | 2.5 |
| 17/06/2017 | 2.3 |
| 17/06/2017 | 2.4 |
| 17/06/2017 | 2.6 |
| 17/06/2017 | 2.5 |
| 17/06/2017 | 3.2 |
| 17/06/2017 | 3.3 |
| 17/06/2017 | 3.8 |
| 17/06/2017 | 3.9 |
| 17/06/2017 | 3.9 |
| 17/06/2017 | 3.8 |
| 17/06/2017 | 3.7 |
| 17/06/2017 | 3.4 |
| 17/06/2017 | 3.5 |
| 17/06/2017 | 3.6 |
| 17/06/2017 | 3.4 |
| 17/06/2017 | 3.3 |
| 17/06/2017 | 3.3 |
| 17/06/2017 | 3.4 |
| 17/06/2017 | 3.2 |
| 17/06/2017 | 2.8 |
| 17/06/2017 | 2.8 |
| 18/06/2017 | 2.3 |
| 18/06/2017 | 2.3 |
| 18/06/2017 | 2.5 |
| 18/06/2017 | 2.3 |
| 18/06/2017 | 2.1 |
| 18/06/2017 | 2.4 |
| 18/06/2017 | 2.3 |
| 18/06/2017 | 2.8 |
| 18/06/2017 | 3 |
| 18/06/2017 | 3.3 |
| 18/06/2017 | 3.2 |
| 18/06/2017 | 3.7 |
| 18/06/2017 | 3.3 |
| 18/06/2017 | 3.2 |
| 18/06/2017 | 3.5 |
| 18/06/2017 | 3.3 |
| 18/06/2017 | 3.1 |
| 18/06/2017 | 3.1 |
| 18/06/2017 | 3.6 |
| 18/06/2017 | 3 |
| 18/06/2017 | 3.2 |
| 18/06/2017 | 2.9 |
| 18/06/2017 | 2.9 |
| 18/06/2017 | 2.4 |
| 19/06/2017 | 2.3 |
| 19/06/2017 | 2.3 |
| 19/06/2017 | 2.2 |
| 19/06/2017 | 2.2 |
| 19/06/2017 | 2.5 |
| 19/06/2017 | 3.3 |
| 19/06/2017 | 3.6 |
| 19/06/2017 | 4.4 |
| 19/06/2017 | 4.6 |
| 19/06/2017 | 4.5 |
| 19/06/2017 | 4.9 |
| 19/06/2017 | 4.6 |
| 19/06/2017 | 4.9 |
| 19/06/2017 | 4.5 |
| 19/06/2017 | 4.6 |
| 19/06/2017 | 4.6 |
| 19/06/2017 | 4.6 |
| 19/06/2017 | 4.5 |
| 19/06/2017 | 4.6 |
| 19/06/2017 | 4.1 |
| 19/06/2017 | 3.6 |
| 19/06/2017 | 3.6 |
| 19/06/2017 | 2.9 |
| 19/06/2017 | 2.6 |
| 20/06/2017 | 2.3 |
| 20/06/2017 | 2.3 |
| 20/06/2017 | 2.2 |
| 20/06/2017 | 2.7 |
| 20/06/2017 | 2.9 |
| 20/06/2017 | 3.1 |
| 20/06/2017 | 3.9 |
| 20/06/2017 | 4.2 |
| 20/06/2017 | 4.4 |
| 20/06/2017 | 4.8 |
| 20/06/2017 | 4.6 |
| 20/06/2017 | 4.8 |
| 20/06/2017 | 4.5 |
| 20/06/2017 | 4.6 |
| 20/06/2017 | 4.8 |
| 20/06/2017 | 4.5 |
| 20/06/2017 | 4.5 |
| 20/06/2017 | 4.3 |
| 20/06/2017 | 4.3 |
| 20/06/2017 | 3.9 |
| 20/06/2017 | 3.8 |
| 20/06/2017 | 3.7 |
| 20/06/2017 | 3 |
| 20/06/2017 | 2.8 |
| 21/06/2017 | 2.5 |
| 21/06/2017 | 2.4 |
| 21/06/2017 | 2.3 |
| 21/06/2017 | 2.3 |
| 21/06/2017 | 2.5 |
| 21/06/2017 | 3.2 |
| 21/06/2017 | 4.1 |
| 21/06/2017 | 4.4 |
| 21/06/2017 | 4.7 |
| 21/06/2017 | 4.6 |
| 21/06/2017 | 4.9 |
| 21/06/2017 | 4.6 |
| 21/06/2017 | 4.8 |
| 21/06/2017 | 4.9 |
| 21/06/2017 | 4.5 |
| 21/06/2017 | 4.5 |
| 21/06/2017 | 4.5 |
| 21/06/2017 | 4.3 |
| 21/06/2017 | 4.3 |
| 21/06/2017 | 3.9 |
| 21/06/2017 | 3.8 |
| 21/06/2017 | 3.3 |
| 21/06/2017 | 3.1 |
| 21/06/2017 | 2.8 |
| 22/06/2017 | 2.5 |
| 22/06/2017 | 2.4 |
| 22/06/2017 | 2.3 |
| 22/06/2017 | 2.3 |
| 22/06/2017 | 2.9 |
| 22/06/2017 | 3.2 |
| 22/06/2017 | 4 |
| 22/06/2017 | 4.3 |
| 22/06/2017 | 4.5 |
| 22/06/2017 | 4.9 |
| 22/06/2017 | 4.7 |
| 22/06/2017 | 4.9 |
| 22/06/2017 | 4.6 |
| 22/06/2017 | 4.6 |
| 22/06/2017 | 4.7 |
| 22/06/2017 | 4.3 |
| 22/06/2017 | 4.2 |
| 22/06/2017 | 4.6 |
| 22/06/2017 | 4.1 |
| 22/06/2017 | 4.2 |
| 22/06/2017 | 3.7 |
| 22/06/2017 | 3.2 |
| 22/06/2017 | 3 |
| 22/06/2017 | 2.8 |
| 23/06/2017 | 2.5 |
| 23/06/2017 | 2.4 |
| 23/06/2017 | 2.2 |
| 23/06/2017 | 2.7 |
| 23/06/2017 | 2.8 |
| 23/06/2017 | 3.5 |
| 23/06/2017 | 3.8 |
| 23/06/2017 | 4.2 |
| 23/06/2017 | 4.5 |
| 23/06/2017 | 4.4 |
| 23/06/2017 | 4.7 |
| 23/06/2017 | 4.8 |
| 23/06/2017 | 4.8 |
| 23/06/2017 | 4.7 |
| 23/06/2017 | 4.7 |
| 23/06/2017 | 4.2 |
| 23/06/2017 | 4.6 |
| 23/06/2017 | 4.3 |
| 23/06/2017 | 4.1 |
| 23/06/2017 | 3.8 |
| 23/06/2017 | 3.8 |
| 23/06/2017 | 3.1 |
| 23/06/2017 | 2.8 |
| 23/06/2017 | 2.6 |
| 24/06/2017 | 2.4 |
| 24/06/2017 | 2.3 |
| 24/06/2017 | 2.5 |
| 24/06/2017 | 2.4 |
| 24/06/2017 | 2.4 |
| 24/06/2017 | 2.6 |
| 24/06/2017 | 2.5 |
| 24/06/2017 | 3.2 |
| 24/06/2017 | 3.3 |
| 24/06/2017 | 3.9 |
| 24/06/2017 | 3.9 |
| 24/06/2017 | 4 |
| 24/06/2017 | 3.9 |
| 24/06/2017 | 3.8 |
| 24/06/2017 | 3.5 |
| 24/06/2017 | 3.7 |
| 24/06/2017 | 3.8 |
| 24/06/2017 | 3.5 |
| 24/06/2017 | 3.4 |
| 24/06/2017 | 3.4 |
| 24/06/2017 | 3.4 |
| 24/06/2017 | 3.3 |
| 24/06/2017 | 2.9 |
| 24/06/2017 | 2.4 |
| 25/06/2017 | 2.4 |
| 25/06/2017 | 2.3 |
| 25/06/2017 | 2.1 |
| 25/06/2017 | 2.4 |
| 25/06/2017 | 2.2 |
| 25/06/2017 | 2.4 |
| 25/06/2017 | 2.3 |
| 25/06/2017 | 2.8 |
| 25/06/2017 | 3 |
| 25/06/2017 | 3.3 |
| 25/06/2017 | 3.3 |
| 25/06/2017 | 3.3 |
| 25/06/2017 | 3.4 |
| 25/06/2017 | 3.3 |
| 25/06/2017 | 3.1 |
| 25/06/2017 | 3.4 |
| 25/06/2017 | 3.3 |
| 25/06/2017 | 3.2 |
| 25/06/2017 | 3.1 |
| 25/06/2017 | 3.1 |
| 25/06/2017 | 3.2 |
| 25/06/2017 | 3 |
| 25/06/2017 | 3 |
| 25/06/2017 | 2.5 |
| 26/06/2017 | 2.4 |
| 26/06/2017 | 2.4 |
| 26/06/2017 | 2.3 |
| 26/06/2017 | 2.3 |
| 26/06/2017 | 2.5 |
| 26/06/2017 | 3.3 |
| 26/06/2017 | 3.6 |
| 26/06/2017 | 4.4 |
| 26/06/2017 | 4.6 |
| 26/06/2017 | 4.6 |
| 26/06/2017 | 4.4 |
| 26/06/2017 | 4.7 |
| 26/06/2017 | 4.5 |
| 26/06/2017 | 4.6 |
| 26/06/2017 | 4.7 |
| 26/06/2017 | 4.3 |
| 26/06/2017 | 4.3 |
| 26/06/2017 | 4.6 |
| 26/06/2017 | 4.1 |
| 26/06/2017 | 4.3 |
| 26/06/2017 | 3.6 |
| 26/06/2017 | 3.7 |
| 26/06/2017 | 3 |
| 26/06/2017 | 2.7 |
| 27/06/2017 | 2.4 |
| 27/06/2017 | 2.3 |
| 27/06/2017 | 2.2 |
| 27/06/2017 | 2.7 |
| 27/06/2017 | 2.9 |
| 27/06/2017 | 3.1 |
| 27/06/2017 | 3.9 |
| 27/06/2017 | 4.2 |
| 27/06/2017 | 4.5 |
| 27/06/2017 | 4.9 |
| 27/06/2017 | 4.7 |
| 27/06/2017 | 4.9 |
| 27/06/2017 | 4.7 |
| 27/06/2017 | 4.7 |
| 27/06/2017 | 4.4 |
| 27/06/2017 | 4.7 |
| 27/06/2017 | 4.7 |
| 27/06/2017 | 4.4 |
| 27/06/2017 | 4.4 |
| 27/06/2017 | 4 |
| 27/06/2017 | 3.8 |
| 27/06/2017 | 3.3 |
| 27/06/2017 | 3.1 |
| 27/06/2017 | 2.9 |
| 28/06/2017 | 2.6 |
| 28/06/2017 | 2.5 |
| 28/06/2017 | 2.3 |
| 28/06/2017 | 2.3 |
| 28/06/2017 | 2.5 |
| 28/06/2017 | 3.3 |
| 28/06/2017 | 4.1 |
| 28/06/2017 | 4.4 |
| 28/06/2017 | 4.7 |
| 28/06/2017 | 4.6 |
| 28/06/2017 | 5 |
| 28/06/2017 | 4.7 |
| 28/06/2017 | 5 |
| 28/06/2017 | 4.5 |
| 28/06/2017 | 4.6 |
| 28/06/2017 | 4.7 |
| 28/06/2017 | 4.7 |
| 28/06/2017 | 4.4 |
| 28/06/2017 | 4.4 |
| 28/06/2017 | 4 |
| 28/06/2017 | 3.7 |
| 28/06/2017 | 3.4 |
| 28/06/2017 | 3.2 |
| 28/06/2017 | 2.9 |
| 29/06/2017 | 2.6 |
| 29/06/2017 | 2.5 |
| 29/06/2017 | 2.3 |
| 29/06/2017 | 2.3 |
| 29/06/2017 | 3 |
| 29/06/2017 | 3.2 |
| 29/06/2017 | 4 |
| 29/06/2017 | 4.3 |
| 29/06/2017 | 4.5 |
| 29/06/2017 | 4.5 |
| 29/06/2017 | 4.8 |
| 29/06/2017 | 5 |
| 29/06/2017 | 4.7 |
| 29/06/2017 | 4.8 |
| 29/06/2017 | 4.4 |
| 29/06/2017 | 4.5 |
| 29/06/2017 | 4.4 |
| 29/06/2017 | 4.7 |
| 29/06/2017 | 4.2 |
| 29/06/2017 | 3.8 |
| 29/06/2017 | 3.7 |
| 29/06/2017 | 3.3 |
| 29/06/2017 | 3.2 |
| 29/06/2017 | 2.9 |
| 30/06/2017 | 2.6 |
| 30/06/2017 | 2.5 |
| 30/06/2017 | 2.3 |
| 30/06/2017 | 2.3 |
| 30/06/2017 | 2.9 |
| 30/06/2017 | 3 |
| 30/06/2017 | 3.8 |
| 30/06/2017 | 4.2 |
| 30/06/2017 | 4.5 |
| 30/06/2017 | 4.5 |
| 30/06/2017 | 4.8 |
| 30/06/2017 | 4.9 |
| 30/06/2017 | 4.9 |
| 30/06/2017 | 4.8 |
| 30/06/2017 | 4.3 |
| 30/06/2017 | 4.4 |
| 30/06/2017 | 4.3 |
| 30/06/2017 | 4.4 |
| 30/06/2017 | 4.2 |
| 30/06/2017 | 3.9 |
| 30/06/2017 | 3.7 |
| 30/06/2017 | 3.2 |
| 30/06/2017 | 3 |
| 30/06/2017 | 2.7 |
| 01/07/2017 | 2.5 |
| 01/07/2017 | 2.4 |
| 01/07/2017 | 2.6 |
| 01/07/2017 | 2.4 |
| 01/07/2017 | 2.4 |
| 01/07/2017 | 2.6 |
| 01/07/2017 | 2.5 |
| 01/07/2017 | 3.2 |
| 01/07/2017 | 3.3 |
| 01/07/2017 | 3.9 |
| 01/07/2017 | 4 |
| 01/07/2017 | 4.1 |
| 01/07/2017 | 4 |
| 01/07/2017 | 3.9 |
| 01/07/2017 | 3.6 |
| 01/07/2017 | 3.3 |
| 01/07/2017 | 3.5 |
| 01/07/2017 | 3.6 |
| 01/07/2017 | 3.5 |
| 01/07/2017 | 3.5 |
| 01/07/2017 | 3.4 |
| 01/07/2017 | 3.4 |
| 01/07/2017 | 3 |
| 01/07/2017 | 2.5 |
| 02/07/2017 | 2.5 |
| 02/07/2017 | 2.4 |
| 02/07/2017 | 2.1 |
| 02/07/2017 | 2.4 |
| 02/07/2017 | 2.2 |
| 02/07/2017 | 2.5 |
| 02/07/2017 | 2.3 |
| 02/07/2017 | 2.9 |
| 02/07/2017 | 3 |
| 02/07/2017 | 3.3 |
| 02/07/2017 | 3.4 |
| 02/07/2017 | 3.3 |
| 02/07/2017 | 3.5 |
| 02/07/2017 | 3.4 |
| 02/07/2017 | 3.2 |
| 02/07/2017 | 3.1 |
| 02/07/2017 | 3.4 |
| 02/07/2017 | 3.3 |
| 02/07/2017 | 3.2 |
| 02/07/2017 | 3.2 |
| 02/07/2017 | 3.2 |
| 02/07/2017 | 3.1 |
| 02/07/2017 | 3.1 |
| 02/07/2017 | 2.6 |
| 03/07/2017 | 2.4 |
| 03/07/2017 | 2.4 |
| 03/07/2017 | 2.3 |
| 03/07/2017 | 2.3 |
| 03/07/2017 | 2.5 |
| 03/07/2017 | 3.4 |
| 03/07/2017 | 3.6 |
| 03/07/2017 | 4.4 |
| 03/07/2017 | 4.7 |
| 03/07/2017 | 4.6 |
| 03/07/2017 | 4.5 |
| 03/07/2017 | 4.8 |
| 03/07/2017 | 4.6 |
| 03/07/2017 | 4.7 |
| 03/07/2017 | 4.4 |
| 03/07/2017 | 4.5 |
| 03/07/2017 | 4.4 |
| 03/07/2017 | 4.7 |
| 03/07/2017 | 4.2 |
| 03/07/2017 | 3.8 |
| 03/07/2017 | 3.6 |
| 03/07/2017 | 3.7 |
| 03/07/2017 | 3.1 |
| 03/07/2017 | 2.8 |
| 04/07/2017 | 2.5 |
| 04/07/2017 | 2.4 |
| 04/07/2017 | 2.3 |
| 04/07/2017 | 2.2 |
| 04/07/2017 | 2.9 |
| 04/07/2017 | 3.2 |
| 04/07/2017 | 3.9 |
| 04/07/2017 | 4.2 |
| 04/07/2017 | 4.5 |
| 04/07/2017 | 4.9 |
| 04/07/2017 | 4.7 |
| 04/07/2017 | 4.9 |
| 04/07/2017 | 4.7 |
| 04/07/2017 | 4.8 |
| 04/07/2017 | 4.5 |
| 04/07/2017 | 4.8 |
| 04/07/2017 | 4.8 |
| 04/07/2017 | 4.4 |
| 04/07/2017 | 4.4 |
| 04/07/2017 | 4.1 |
| 04/07/2017 | 3.8 |
| 04/07/2017 | 3.3 |
| 04/07/2017 | 3.2 |
| 04/07/2017 | 2.9 |
| 05/07/2017 | 2.6 |
| 05/07/2017 | 2.5 |
| 05/07/2017 | 2.4 |
| 05/07/2017 | 2.3 |
| 05/07/2017 | 2.5 |
| 05/07/2017 | 3.3 |
| 05/07/2017 | 4.1 |
| 05/07/2017 | 4.4 |
| 05/07/2017 | 4.7 |
| 05/07/2017 | 4.6 |
| 05/07/2017 | 5 |
| 05/07/2017 | 4.7 |
| 05/07/2017 | 5 |
| 05/07/2017 | 4.6 |
| 05/07/2017 | 4.7 |
| 05/07/2017 | 4.8 |
| 05/07/2017 | 4.7 |
| 05/07/2017 | 4.4 |
| 05/07/2017 | 4.4 |
| 05/07/2017 | 4.1 |
| 05/07/2017 | 3.8 |
| 05/07/2017 | 3.4 |
| 05/07/2017 | 3.2 |
| 05/07/2017 | 2.9 |
| 06/07/2017 | 2.6 |
| 06/07/2017 | 2.5 |
| 06/07/2017 | 2.3 |
| 06/07/2017 | 2.3 |
| 06/07/2017 | 2.5 |
| 06/07/2017 | 3.2 |
| 06/07/2017 | 4 |
| 06/07/2017 | 4.3 |
| 06/07/2017 | 4.5 |
| 06/07/2017 | 4.9 |
| 06/07/2017 | 4.8 |
| 06/07/2017 | 4.9 |
| 06/07/2017 | 4.7 |
| 06/07/2017 | 4.8 |
| 06/07/2017 | 4.4 |
| 06/07/2017 | 4.5 |
| 06/07/2017 | 4.4 |
| 06/07/2017 | 4.7 |
| 06/07/2017 | 4.2 |
| 06/07/2017 | 3.9 |
| 06/07/2017 | 3.7 |
| 06/07/2017 | 3.3 |
| 06/07/2017 | 3.1 |
| 06/07/2017 | 2.9 |
| 07/07/2017 | 2.6 |
| 07/07/2017 | 2.5 |
| 07/07/2017 | 2.3 |
| 07/07/2017 | 2.3 |
| 07/07/2017 | 2.9 |
| 07/07/2017 | 3 |
| 07/07/2017 | 3.8 |
| 07/07/2017 | 4.2 |
| 07/07/2017 | 4.5 |
| 07/07/2017 | 4.9 |
| 07/07/2017 | 4.7 |
| 07/07/2017 | 4.8 |
| 07/07/2017 | 4.8 |
| 07/07/2017 | 4.7 |
| 07/07/2017 | 4.3 |
| 07/07/2017 | 4.4 |
| 07/07/2017 | 4.2 |
| 07/07/2017 | 4.3 |
| 07/07/2017 | 4.1 |
| 07/07/2017 | 3.9 |
| 07/07/2017 | 3.8 |
| 07/07/2017 | 3.2 |
| 07/07/2017 | 2.9 |
| 07/07/2017 | 2.6 |
| 08/07/2017 | 2.5 |
| 08/07/2017 | 2.4 |
| 08/07/2017 | 2.6 |
| 08/07/2017 | 2.4 |
| 08/07/2017 | 2.5 |
| 08/07/2017 | 2.6 |
| 08/07/2017 | 2.5 |
| 08/07/2017 | 3.2 |
| 08/07/2017 | 3.3 |
| 08/07/2017 | 3.8 |
| 08/07/2017 | 3.9 |
| 08/07/2017 | 4 |
| 08/07/2017 | 3.9 |
| 08/07/2017 | 3.8 |
| 08/07/2017 | 3.5 |
| 08/07/2017 | 3.8 |
| 08/07/2017 | 3.4 |
| 08/07/2017 | 3.5 |
| 08/07/2017 | 3.4 |
| 08/07/2017 | 3.4 |
| 08/07/2017 | 3.5 |
| 08/07/2017 | 3.3 |
| 08/07/2017 | 2.9 |
| 08/07/2017 | 2.4 |
| 09/07/2017 | 2.4 |
| 09/07/2017 | 2.4 |
| 09/07/2017 | 2.1 |
| 09/07/2017 | 2.4 |
| 09/07/2017 | 2.2 |
| 09/07/2017 | 2.5 |
| 09/07/2017 | 2.3 |
| 09/07/2017 | 2.8 |
| 09/07/2017 | 3 |
| 09/07/2017 | 3.2 |
| 09/07/2017 | 3.2 |
| 09/07/2017 | 3.7 |
| 09/07/2017 | 3.4 |
| 09/07/2017 | 3.3 |
| 09/07/2017 | 3.1 |
| 09/07/2017 | 3.5 |
| 09/07/2017 | 3.3 |
| 09/07/2017 | 3.2 |
| 09/07/2017 | 3.6 |
| 09/07/2017 | 3.1 |
| 09/07/2017 | 3.3 |
| 09/07/2017 | 3 |
| 09/07/2017 | 2.9 |
| 09/07/2017 | 2.5 |
| 10/07/2017 | 2.4 |
| 10/07/2017 | 2.4 |
| 10/07/2017 | 2.3 |
| 10/07/2017 | 2.3 |
| 10/07/2017 | 2.6 |
| 10/07/2017 | 3.4 |
| 10/07/2017 | 3.6 |
| 10/07/2017 | 4.3 |
| 10/07/2017 | 4.5 |
| 10/07/2017 | 4.4 |
| 10/07/2017 | 4.8 |
| 10/07/2017 | 4.6 |
| 10/07/2017 | 4.9 |
| 10/07/2017 | 4.6 |
| 10/07/2017 | 4.7 |
| 10/07/2017 | 4.3 |
| 10/07/2017 | 4.2 |
| 10/07/2017 | 4.5 |
| 10/07/2017 | 4.5 |
| 10/07/2017 | 3.8 |
| 10/07/2017 | 3.7 |
| 10/07/2017 | 3.6 |
| 10/07/2017 | 2.9 |
| 10/07/2017 | 2.7 |
| 11/07/2017 | 2.4 |
| 11/07/2017 | 2.4 |
| 11/07/2017 | 2.2 |
| 11/07/2017 | 2.3 |
| 11/07/2017 | 2.5 |
| 11/07/2017 | 3.2 |
| 11/07/2017 | 3.9 |
| 11/07/2017 | 4.2 |
| 11/07/2017 | 4.3 |
| 11/07/2017 | 4.7 |
| 11/07/2017 | 4.6 |
| 11/07/2017 | 4.8 |
| 11/07/2017 | 4.6 |
| 11/07/2017 | 4.7 |
| 11/07/2017 | 4.4 |
| 11/07/2017 | 4.6 |
| 11/07/2017 | 4.6 |
| 11/07/2017 | 4.3 |
| 11/07/2017 | 4.2 |
| 11/07/2017 | 4 |
| 11/07/2017 | 3.9 |
| 11/07/2017 | 3.7 |
| 11/07/2017 | 3 |
| 11/07/2017 | 2.8 |
| 12/07/2017 | 2.5 |
| 12/07/2017 | 2.5 |
| 12/07/2017 | 2.3 |
| 12/07/2017 | 2.4 |
| 12/07/2017 | 2.6 |
| 12/07/2017 | 3.3 |
| 12/07/2017 | 4.1 |
| 12/07/2017 | 4.3 |
| 12/07/2017 | 4.6 |
| 12/07/2017 | 4.4 |
| 12/07/2017 | 4.8 |
| 12/07/2017 | 5 |
| 12/07/2017 | 4.8 |
| 12/07/2017 | 4.9 |
| 12/07/2017 | 4.5 |
| 12/07/2017 | 4.6 |
| 12/07/2017 | 4.5 |
| 12/07/2017 | 4.2 |
| 12/07/2017 | 4.2 |
| 12/07/2017 | 4 |
| 12/07/2017 | 3.9 |
| 12/07/2017 | 3.2 |
| 12/07/2017 | 3 |
| 12/07/2017 | 2.8 |
| 13/07/2017 | 2.5 |
| 13/07/2017 | 2.4 |
| 13/07/2017 | 2.3 |
| 13/07/2017 | 2.3 |
| 13/07/2017 | 2.6 |
| 13/07/2017 | 3.2 |
| 13/07/2017 | 4 |
| 13/07/2017 | 4.2 |
| 13/07/2017 | 4.3 |
| 13/07/2017 | 4.7 |
| 13/07/2017 | 4.6 |
| 13/07/2017 | 4.8 |
| 13/07/2017 | 4.5 |
| 13/07/2017 | 4.6 |
| 13/07/2017 | 4.7 |
| 13/07/2017 | 4.3 |
| 13/07/2017 | 4.7 |
| 13/07/2017 | 4.5 |
| 13/07/2017 | 4.5 |
| 13/07/2017 | 3.8 |
| 13/07/2017 | 3.8 |
| 13/07/2017 | 3.6 |
| 13/07/2017 | 3 |
| 13/07/2017 | 2.7 |
| 14/07/2017 | 2.5 |
| 14/07/2017 | 2.4 |
| 14/07/2017 | 2.3 |
| 14/07/2017 | 2.3 |
| 14/07/2017 | 2.5 |
| 14/07/2017 | 3 |
| 14/07/2017 | 3.8 |
| 14/07/2017 | 4.1 |
| 14/07/2017 | 4.3 |
| 14/07/2017 | 4.8 |
| 14/07/2017 | 4.5 |
| 14/07/2017 | 4.6 |
| 14/07/2017 | 4.7 |
| 14/07/2017 | 4.6 |
| 14/07/2017 | 4.6 |
| 14/07/2017 | 4.2 |
| 14/07/2017 | 4.5 |
| 14/07/2017 | 4.1 |
| 14/07/2017 | 3.9 |
| 14/07/2017 | 3.8 |
| 14/07/2017 | 3.4 |
| 14/07/2017 | 3.5 |
| 14/07/2017 | 3.2 |
| 14/07/2017 | 2.5 |
| 15/07/2017 | 2.4 |
| 15/07/2017 | 2.3 |
| 15/07/2017 | 2.5 |
| 15/07/2017 | 2.4 |
| 15/07/2017 | 2.5 |
| 15/07/2017 | 2.6 |
| 15/07/2017 | 2.5 |
| 15/07/2017 | 3.1 |
| 15/07/2017 | 3.7 |
| 15/07/2017 | 3.7 |
| 15/07/2017 | 3.8 |
| 15/07/2017 | 3.8 |
| 15/07/2017 | 3.8 |
| 15/07/2017 | 3.7 |
| 15/07/2017 | 3.4 |
| 15/07/2017 | 3.6 |
| 15/07/2017 | 3.7 |
| 15/07/2017 | 3.3 |
| 15/07/2017 | 3.7 |
| 15/07/2017 | 3.4 |
| 15/07/2017 | 3.1 |
| 15/07/2017 | 3.1 |
| 15/07/2017 | 2.7 |
| 15/07/2017 | 2.8 |
| 16/07/2017 | 2.4 |
| 16/07/2017 | 2.3 |
| 16/07/2017 | 2.1 |
| 16/07/2017 | 2.4 |
| 16/07/2017 | 2.3 |
| 16/07/2017 | 2.5 |
| 16/07/2017 | 2.3 |
| 16/07/2017 | 2.8 |
| 16/07/2017 | 2.9 |
| 16/07/2017 | 3.1 |
| 16/07/2017 | 3.6 |
| 16/07/2017 | 3.6 |
| 16/07/2017 | 3.2 |
| 16/07/2017 | 3.2 |
| 16/07/2017 | 3.5 |
| 16/07/2017 | 3.4 |
| 16/07/2017 | 3.1 |
| 16/07/2017 | 3.5 |
| 16/07/2017 | 3.4 |
| 16/07/2017 | 3.1 |
| 16/07/2017 | 3.4 |
| 16/07/2017 | 3.3 |
| 16/07/2017 | 2.8 |
| 16/07/2017 | 2.4 |
| 17/07/2017 | 2.3 |
| 17/07/2017 | 2.3 |
| 17/07/2017 | 2.3 |
| 17/07/2017 | 2.4 |
| 17/07/2017 | 2.7 |
| 17/07/2017 | 3.4 |
| 17/07/2017 | 3.5 |
| 17/07/2017 | 4.2 |
| 17/07/2017 | 4.4 |
| 17/07/2017 | 4.8 |
| 17/07/2017 | 4.7 |
| 17/07/2017 | 4.9 |
| 17/07/2017 | 4.7 |
| 17/07/2017 | 4.4 |
| 17/07/2017 | 4.6 |
| 17/07/2017 | 4.6 |
| 17/07/2017 | 4.5 |
| 17/07/2017 | 4.4 |
| 17/07/2017 | 4.3 |
| 17/07/2017 | 4.2 |
| 17/07/2017 | 3.8 |
| 17/07/2017 | 3.4 |
| 17/07/2017 | 3.2 |
| 17/07/2017 | 2.5 |
| 18/07/2017 | 2.4 |
| 18/07/2017 | 2.3 |
| 18/07/2017 | 2.2 |
| 18/07/2017 | 2.3 |
| 18/07/2017 | 2.6 |
| 18/07/2017 | 3.2 |
| 18/07/2017 | 3.9 |
| 18/07/2017 | 4.1 |
| 18/07/2017 | 4.7 |
| 18/07/2017 | 4.5 |
| 18/07/2017 | 4.9 |
| 18/07/2017 | 4.6 |
| 18/07/2017 | 4.9 |
| 18/07/2017 | 4.5 |
| 18/07/2017 | 4.7 |
| 18/07/2017 | 4.5 |
| 18/07/2017 | 4.4 |
| 18/07/2017 | 4.6 |
| 18/07/2017 | 4.5 |
| 18/07/2017 | 4 |
| 18/07/2017 | 4 |
| 18/07/2017 | 3.5 |
| 18/07/2017 | 2.8 |
| 18/07/2017 | 2.7 |
| 19/07/2017 | 2.5 |
| 19/07/2017 | 2.4 |
| 19/07/2017 | 2.3 |
| 19/07/2017 | 2.4 |
| 19/07/2017 | 2.7 |
| 19/07/2017 | 3.3 |
| 19/07/2017 | 4.1 |
| 19/07/2017 | 4.3 |
| 19/07/2017 | 4.4 |
| 19/07/2017 | 4.8 |
| 19/07/2017 | 4.6 |
| 19/07/2017 | 4.8 |
| 19/07/2017 | 4.6 |
| 19/07/2017 | 4.7 |
| 19/07/2017 | 4.4 |
| 19/07/2017 | 4.4 |
| 19/07/2017 | 4.3 |
| 19/07/2017 | 4.6 |
| 19/07/2017 | 4.6 |
| 19/07/2017 | 4 |
| 19/07/2017 | 4 |
| 19/07/2017 | 3.6 |
| 19/07/2017 | 2.9 |
| 19/07/2017 | 2.6 |
| 20/07/2017 | 2.4 |
| 20/07/2017 | 2.4 |
| 20/07/2017 | 2.2 |
| 20/07/2017 | 2.3 |
| 20/07/2017 | 2.9 |
| 20/07/2017 | 3.4 |
| 20/07/2017 | 3.8 |
| 20/07/2017 | 4.1 |
| 20/07/2017 | 4.5 |
| 20/07/2017 | 4.6 |
| 20/07/2017 | 4.5 |
| 20/07/2017 | 4.6 |
| 20/07/2017 | 4.8 |
| 20/07/2017 | 4.2 |
| 20/07/2017 | 4.3 |
| 20/07/2017 | 4.5 |
| 20/07/2017 | 4.4 |
| 20/07/2017 | 4.2 |
| 20/07/2017 | 4.1 |
| 20/07/2017 | 4.1 |
| 20/07/2017 | 3.9 |
| 20/07/2017 | 3.3 |
| 20/07/2017 | 3.2 |
| 20/07/2017 | 2.6 |
| 21/07/2017 | 2.4 |
| 21/07/2017 | 2.3 |
| 21/07/2017 | 2.2 |
| 21/07/2017 | 2.7 |
| 21/07/2017 | 2.8 |
| 21/07/2017 | 3.2 |
| 21/07/2017 | 3.6 |
| 21/07/2017 | 4.1 |
| 21/07/2017 | 4.6 |
| 21/07/2017 | 4.6 |
| 21/07/2017 | 4.4 |
| 21/07/2017 | 4.5 |
| 21/07/2017 | 4.4 |
| 21/07/2017 | 4.2 |
| 21/07/2017 | 4.2 |
| 21/07/2017 | 4.3 |
| 21/07/2017 | 4.2 |
| 21/07/2017 | 4.3 |
| 21/07/2017 | 4.1 |
| 21/07/2017 | 3.7 |
| 21/07/2017 | 3.5 |
| 21/07/2017 | 3.1 |
| 21/07/2017 | 3 |
| 21/07/2017 | 2.9 |
| 22/07/2017 | 2.3 |
| 22/07/2017 | 2.3 |
| 22/07/2017 | 2.5 |
| 22/07/2017 | 2.4 |
| 22/07/2017 | 2.4 |
| 22/07/2017 | 2.5 |
| 22/07/2017 | 2.7 |
| 22/07/2017 | 2.8 |
| 22/07/2017 | 3.5 |
| 22/07/2017 | 3.6 |
| 22/07/2017 | 3.7 |
| 22/07/2017 | 3.8 |
| 22/07/2017 | 3.6 |
| 22/07/2017 | 3.5 |
| 22/07/2017 | 3.7 |
| 22/07/2017 | 3.4 |
| 22/07/2017 | 3.5 |
| 22/07/2017 | 3.6 |
| 22/07/2017 | 3.5 |
| 22/07/2017 | 3.3 |
| 22/07/2017 | 3.2 |
| 22/07/2017 | 2.8 |
| 22/07/2017 | 3 |
| 22/07/2017 | 2.7 |
| 23/07/2017 | 2.3 |
| 23/07/2017 | 2.3 |
| 23/07/2017 | 2.5 |
| 23/07/2017 | 2.4 |
| 23/07/2017 | 2.1 |
| 23/07/2017 | 1.9 |
| 23/07/2017 | 2.1 |
| 23/07/2017 | 2.6 |
| 23/07/2017 | 2.8 |
| 23/07/2017 | 3.2 |
| 23/07/2017 | 3.1 |
| 23/07/2017 | 3.6 |
| 23/07/2017 | 3.1 |
| 23/07/2017 | 3 |
| 23/07/2017 | 3.3 |
| 23/07/2017 | 3.2 |
| 23/07/2017 | 3 |
| 23/07/2017 | 3.4 |
| 23/07/2017 | 3.2 |
| 23/07/2017 | 3 |
| 23/07/2017 | 3 |
| 23/07/2017 | 3 |
| 23/07/2017 | 3 |
| 23/07/2017 | 2.7 |
| 24/07/2017 | 2.2 |
| 24/07/2017 | 2.3 |
| 24/07/2017 | 2.2 |
| 24/07/2017 | 2.3 |
| 24/07/2017 | 2.5 |
| 24/07/2017 | 3.1 |
| 24/07/2017 | 3.4 |
| 24/07/2017 | 4.2 |
| 24/07/2017 | 4.1 |
| 24/07/2017 | 4.7 |
| 24/07/2017 | 4.6 |
| 24/07/2017 | 4.8 |
| 24/07/2017 | 4.5 |
| 24/07/2017 | 4.5 |
| 24/07/2017 | 4.2 |
| 24/07/2017 | 4.3 |
| 24/07/2017 | 4.2 |
| 24/07/2017 | 4 |
| 24/07/2017 | 4 |
| 24/07/2017 | 4 |
| 24/07/2017 | 3.9 |
| 24/07/2017 | 3.6 |
| 24/07/2017 | 3 |
| 24/07/2017 | 2.9 |
| 25/07/2017 | 2.3 |
| 25/07/2017 | 2.2 |
| 25/07/2017 | 2.2 |
| 25/07/2017 | 2.7 |
| 25/07/2017 | 2.9 |
| 25/07/2017 | 3.4 |
| 25/07/2017 | 3.7 |
| 25/07/2017 | 4 |
| 25/07/2017 | 4.4 |
| 25/07/2017 | 4.4 |
| 25/07/2017 | 4.8 |
| 25/07/2017 | 4.4 |
| 25/07/2017 | 4.6 |
| 25/07/2017 | 4.6 |
| 25/07/2017 | 4.3 |
| 25/07/2017 | 4.6 |
| 25/07/2017 | 4.5 |
| 25/07/2017 | 4.3 |
| 25/07/2017 | 4.2 |
| 25/07/2017 | 3.8 |
| 25/07/2017 | 3.6 |
| 25/07/2017 | 3.2 |
| 25/07/2017 | 3.1 |
| 25/07/2017 | 2.5 |
| 26/07/2017 | 2.4 |
| 26/07/2017 | 2.3 |
| 26/07/2017 | 2.2 |
| 26/07/2017 | 2.3 |
| 26/07/2017 | 3 |
| 26/07/2017 | 3 |
| 26/07/2017 | 3.9 |
| 26/07/2017 | 4.2 |
| 26/07/2017 | 4.1 |
| 26/07/2017 | 4.6 |
| 26/07/2017 | 4.5 |
| 26/07/2017 | 4.7 |
| 26/07/2017 | 4.4 |
| 26/07/2017 | 4.4 |
| 26/07/2017 | 4.5 |
| 26/07/2017 | 4.6 |
| 26/07/2017 | 4.5 |
| 26/07/2017 | 4.2 |
| 26/07/2017 | 4.2 |
| 26/07/2017 | 3.7 |
| 26/07/2017 | 3.5 |
| 26/07/2017 | 3.2 |
| 26/07/2017 | 3.1 |
| 26/07/2017 | 2.5 |
| 27/07/2017 | 2.4 |
| 27/07/2017 | 2.3 |
| 27/07/2017 | 2.2 |
| 27/07/2017 | 2.3 |
| 27/07/2017 | 2.9 |
| 27/07/2017 | 3.4 |
| 27/07/2017 | 3.8 |
| 27/07/2017 | 4.1 |
| 27/07/2017 | 4.4 |
| 27/07/2017 | 4.4 |
| 27/07/2017 | 4.3 |
| 27/07/2017 | 4.4 |
| 27/07/2017 | 4.6 |
| 27/07/2017 | 4.6 |
| 27/07/2017 | 4.2 |
| 27/07/2017 | 4.3 |
| 27/07/2017 | 4.2 |
| 27/07/2017 | 4 |
| 27/07/2017 | 3.9 |
| 27/07/2017 | 4.1 |
| 27/07/2017 | 3.5 |
| 27/07/2017 | 3.1 |
| 27/07/2017 | 3 |
| 27/07/2017 | 2.5 |
| 28/07/2017 | 2.3 |
| 28/07/2017 | 2.3 |
| 28/07/2017 | 2.2 |
| 28/07/2017 | 2.3 |
| 28/07/2017 | 2.9 |
| 28/07/2017 | 3.2 |
| 28/07/2017 | 3.6 |
| 28/07/2017 | 4 |
| 28/07/2017 | 4.4 |
| 28/07/2017 | 4.5 |
| 28/07/2017 | 4.8 |
| 28/07/2017 | 4.8 |
| 28/07/2017 | 4.2 |
| 28/07/2017 | 4.6 |
| 28/07/2017 | 4.1 |
| 28/07/2017 | 4.2 |
| 28/07/2017 | 4 |
| 28/07/2017 | 4.2 |
| 28/07/2017 | 3.9 |
| 28/07/2017 | 3.6 |
| 28/07/2017 | 3.6 |
| 28/07/2017 | 3 |
| 28/07/2017 | 2.8 |
| 28/07/2017 | 2.8 |
| 29/07/2017 | 2.3 |
| 29/07/2017 | 2.2 |
| 29/07/2017 | 2.5 |
| 29/07/2017 | 2.4 |
| 29/07/2017 | 2.4 |
| 29/07/2017 | 2.5 |
| 29/07/2017 | 2.7 |
| 29/07/2017 | 2.8 |
| 29/07/2017 | 3.4 |
| 29/07/2017 | 3.5 |
| 29/07/2017 | 3.6 |
| 29/07/2017 | 3.6 |
| 29/07/2017 | 3.5 |
| 29/07/2017 | 3.4 |
| 29/07/2017 | 3.5 |
| 29/07/2017 | 3.3 |
| 29/07/2017 | 3.3 |
| 29/07/2017 | 3.5 |
| 29/07/2017 | 3.3 |
| 29/07/2017 | 3.2 |
| 29/07/2017 | 3.3 |
| 29/07/2017 | 3.2 |
| 29/07/2017 | 2.8 |
| 29/07/2017 | 2.6 |
| 30/07/2017 | 2.2 |
| 30/07/2017 | 2.2 |
| 30/07/2017 | 2.5 |
| 30/07/2017 | 2.4 |
| 30/07/2017 | 2.2 |
| 30/07/2017 | 1.9 |
| 30/07/2017 | 2.1 |
| 30/07/2017 | 2.5 |
| 30/07/2017 | 2.7 |
| 30/07/2017 | 3 |
| 30/07/2017 | 3 |
| 30/07/2017 | 3.4 |
| 30/07/2017 | 3 |
| 30/07/2017 | 2.9 |
| 30/07/2017 | 3.2 |
| 30/07/2017 | 3.1 |
| 30/07/2017 | 3.3 |
| 30/07/2017 | 3.2 |
| 30/07/2017 | 3.1 |
| 30/07/2017 | 3 |
| 30/07/2017 | 3.1 |
| 30/07/2017 | 2.8 |
| 30/07/2017 | 2.9 |
| 30/07/2017 | 2.6 |
| 31/07/2017 | 2.2 |
| 31/07/2017 | 2.2 |
| 31/07/2017 | 2.2 |
| 31/07/2017 | 2.3 |
| 31/07/2017 | 2.5 |
| 31/07/2017 | 3.1 |
| 31/07/2017 | 3.4 |
| 31/07/2017 | 4.1 |
| 31/07/2017 | 4 |
| 31/07/2017 | 4.5 |
| 31/07/2017 | 4.4 |
| 31/07/2017 | 4.6 |
| 31/07/2017 | 4.3 |
| 31/07/2017 | 4.4 |
| 31/07/2017 | 4.5 |
| 31/07/2017 | 4.1 |
| 31/07/2017 | 4 |
| 31/07/2017 | 4.4 |
| 31/07/2017 | 4.3 |
| 31/07/2017 | 4 |
| 31/07/2017 | 3.5 |
| 31/07/2017 | 3.4 |
| 31/07/2017 | 2.8 |
| 31/07/2017 | 2.8 |
| 01/08/2017 | 2.7 |
| 01/08/2017 | 2.2 |
| 01/08/2017 | 2.1 |
| 01/08/2017 | 2.3 |
| 01/08/2017 | 2.9 |
| 01/08/2017 | 3.4 |
| 01/08/2017 | 3.7 |
| 01/08/2017 | 4 |
| 01/08/2017 | 4.3 |
| 01/08/2017 | 4.3 |
| 01/08/2017 | 4.6 |
| 01/08/2017 | 4.7 |
| 01/08/2017 | 4.5 |
| 01/08/2017 | 4.5 |
| 01/08/2017 | 4.2 |
| 01/08/2017 | 4.4 |
| 01/08/2017 | 4.3 |
| 01/08/2017 | 4.1 |
| 01/08/2017 | 4 |
| 01/08/2017 | 3.7 |
| 01/08/2017 | 3.7 |
| 01/08/2017 | 3.5 |
| 01/08/2017 | 2.9 |
| 01/08/2017 | 2.9 |
| 02/08/2017 | 2.3 |
| 02/08/2017 | 2.3 |
| 02/08/2017 | 2.2 |
| 02/08/2017 | 2.3 |
| 02/08/2017 | 2.5 |
| 02/08/2017 | 3 |
| 02/08/2017 | 3.9 |
| 02/08/2017 | 4.1 |
| 02/08/2017 | 4.5 |
| 02/08/2017 | 4.5 |
| 02/08/2017 | 4.4 |
| 02/08/2017 | 4.5 |
| 02/08/2017 | 4.7 |
| 02/08/2017 | 4.2 |
| 02/08/2017 | 4.3 |
| 02/08/2017 | 4.4 |
| 02/08/2017 | 4.3 |
| 02/08/2017 | 4.1 |
| 02/08/2017 | 4 |
| 02/08/2017 | 3.7 |
| 02/08/2017 | 3.6 |
| 02/08/2017 | 3.6 |
| 02/08/2017 | 2.9 |
| 02/08/2017 | 2.9 |
| 03/08/2017 | 2.3 |
| 03/08/2017 | 2.3 |
| 03/08/2017 | 2.2 |
| 03/08/2017 | 2.3 |
| 03/08/2017 | 2.5 |
| 03/08/2017 | 3.4 |
| 03/08/2017 | 3.8 |
| 03/08/2017 | 4 |
| 03/08/2017 | 4.3 |
| 03/08/2017 | 4.3 |
| 03/08/2017 | 4.7 |
| 03/08/2017 | 4.7 |
| 03/08/2017 | 4.4 |
| 03/08/2017 | 4.4 |
| 03/08/2017 | 4.5 |
| 03/08/2017 | 4.1 |
| 03/08/2017 | 4.5 |
| 03/08/2017 | 4.4 |
| 03/08/2017 | 4.2 |
| 03/08/2017 | 4 |
| 03/08/2017 | 3.6 |
| 03/08/2017 | 3.5 |
| 03/08/2017 | 2.9 |
| 03/08/2017 | 2.9 |
| 04/08/2017 | 2.3 |
| 04/08/2017 | 2.3 |
| 04/08/2017 | 2.2 |
| 04/08/2017 | 2.3 |
| 04/08/2017 | 2.9 |
| 04/08/2017 | 3.2 |
| 04/08/2017 | 3.6 |
| 04/08/2017 | 3.9 |
| 04/08/2017 | 4.3 |
| 04/08/2017 | 4.3 |
| 04/08/2017 | 4.6 |
| 04/08/2017 | 4.6 |
| 04/08/2017 | 4.6 |
| 04/08/2017 | 4.4 |
| 04/08/2017 | 4.5 |
| 04/08/2017 | 4 |
| 04/08/2017 | 4.3 |
| 04/08/2017 | 4 |
| 04/08/2017 | 3.7 |
| 04/08/2017 | 3.6 |
| 04/08/2017 | 3.7 |
| 04/08/2017 | 3.4 |
| 04/08/2017 | 3.1 |
| 04/08/2017 | 2.6 |
| 05/08/2017 | 2.7 |
| 05/08/2017 | 2.2 |
| 05/08/2017 | 2.4 |
| 05/08/2017 | 2.4 |
| 05/08/2017 | 2.5 |
| 05/08/2017 | 2.6 |
| 05/08/2017 | 2.7 |
| 05/08/2017 | 2.7 |
| 05/08/2017 | 3.3 |
| 05/08/2017 | 3.4 |
| 05/08/2017 | 3.4 |
| 05/08/2017 | 3.5 |
| 05/08/2017 | 3.4 |
| 05/08/2017 | 3.2 |
| 05/08/2017 | 3.4 |
| 05/08/2017 | 3.1 |
| 05/08/2017 | 3.2 |
| 05/08/2017 | 3.4 |
| 05/08/2017 | 3.2 |
| 05/08/2017 | 3.2 |
| 05/08/2017 | 3.4 |
| 05/08/2017 | 3 |
| 05/08/2017 | 2.7 |
| 05/08/2017 | 2.5 |
| 06/08/2017 | 2.2 |
| 06/08/2017 | 2.2 |
| 06/08/2017 | 2.5 |
| 06/08/2017 | 2.4 |
| 06/08/2017 | 2.2 |
| 06/08/2017 | 1.9 |
| 06/08/2017 | 2.1 |
| 06/08/2017 | 2.5 |
| 06/08/2017 | 2.6 |
| 06/08/2017 | 2.9 |
| 06/08/2017 | 3.4 |
| 06/08/2017 | 3.3 |
| 06/08/2017 | 3.4 |
| 06/08/2017 | 3.3 |
| 06/08/2017 | 3.1 |
| 06/08/2017 | 2.9 |
| 06/08/2017 | 3.2 |
| 06/08/2017 | 3.1 |
| 06/08/2017 | 2.9 |
| 06/08/2017 | 2.9 |
| 06/08/2017 | 3.2 |
| 06/08/2017 | 3.2 |
| 06/08/2017 | 2.7 |
| 06/08/2017 | 2.5 |
| 07/08/2017 | 2.6 |
| 07/08/2017 | 2.2 |
| 07/08/2017 | 2.2 |
| 07/08/2017 | 2.3 |
| 07/08/2017 | 2.6 |
| 07/08/2017 | 3.1 |
| 07/08/2017 | 3.4 |
| 07/08/2017 | 4 |
| 07/08/2017 | 4.4 |
| 07/08/2017 | 4.3 |
| 07/08/2017 | 4.2 |
| 07/08/2017 | 4.4 |
| 07/08/2017 | 4.7 |
| 07/08/2017 | 4.2 |
| 07/08/2017 | 4.4 |
| 07/08/2017 | 4.4 |
| 07/08/2017 | 4.3 |
| 07/08/2017 | 4.2 |
| 07/08/2017 | 4.1 |
| 07/08/2017 | 3.9 |
| 07/08/2017 | 3.6 |
| 07/08/2017 | 3.3 |
| 07/08/2017 | 3.2 |
| 07/08/2017 | 2.7 |
| 08/08/2017 | 2.6 |
| 08/08/2017 | 2.2 |
| 08/08/2017 | 2.6 |
| 08/08/2017 | 2.3 |
| 08/08/2017 | 2.5 |
| 08/08/2017 | 3.4 |
| 08/08/2017 | 3.7 |
| 08/08/2017 | 3.9 |
| 08/08/2017 | 4.2 |
| 08/08/2017 | 4.6 |
| 08/08/2017 | 4.4 |
| 08/08/2017 | 4.6 |
| 08/08/2017 | 4.3 |
| 08/08/2017 | 4.3 |
| 08/08/2017 | 4.5 |
| 08/08/2017 | 4.3 |
| 08/08/2017 | 4.1 |
| 08/08/2017 | 4.5 |
| 08/08/2017 | 4.3 |
| 08/08/2017 | 3.7 |
| 08/08/2017 | 3.8 |
| 08/08/2017 | 3.4 |
| 08/08/2017 | 2.7 |
| 08/08/2017 | 2.8 |
| 09/08/2017 | 2.3 |
| 09/08/2017 | 2.3 |
| 09/08/2017 | 2.2 |
| 09/08/2017 | 2.4 |
| 09/08/2017 | 2.6 |
| 09/08/2017 | 3 |
| 09/08/2017 | 3.9 |
| 09/08/2017 | 4.1 |
| 09/08/2017 | 4.4 |
| 09/08/2017 | 4.3 |
| 09/08/2017 | 4.7 |
| 09/08/2017 | 4.3 |
| 09/08/2017 | 4.5 |
| 09/08/2017 | 4.6 |
| 09/08/2017 | 4.2 |
| 09/08/2017 | 4.3 |
| 09/08/2017 | 4.1 |
| 09/08/2017 | 4.4 |
| 09/08/2017 | 4.4 |
| 09/08/2017 | 3.7 |
| 09/08/2017 | 3.7 |
| 09/08/2017 | 3.4 |
| 09/08/2017 | 2.8 |
| 09/08/2017 | 2.8 |
| 10/08/2017 | 2.2 |
| 10/08/2017 | 2.2 |
| 10/08/2017 | 2.2 |
| 10/08/2017 | 2.3 |
| 10/08/2017 | 2.5 |
| 10/08/2017 | 3.4 |
| 10/08/2017 | 3.8 |
| 10/08/2017 | 3.9 |
| 10/08/2017 | 4.2 |
| 10/08/2017 | 4.7 |
| 10/08/2017 | 4.5 |
| 10/08/2017 | 4.6 |
| 10/08/2017 | 4.3 |
| 10/08/2017 | 4.3 |
| 10/08/2017 | 4.4 |
| 10/08/2017 | 4 |
| 10/08/2017 | 4.3 |
| 10/08/2017 | 4.3 |
| 10/08/2017 | 4.2 |
| 10/08/2017 | 4.1 |
| 10/08/2017 | 3.6 |
| 10/08/2017 | 3.4 |
| 10/08/2017 | 2.7 |
| 10/08/2017 | 2.8 |
| 11/08/2017 | 2.7 |
| 11/08/2017 | 2.2 |
| 11/08/2017 | 2.1 |
| 11/08/2017 | 2.3 |
| 11/08/2017 | 2.9 |
| 11/08/2017 | 3.2 |
| 11/08/2017 | 3.6 |
| 11/08/2017 | 3.8 |
| 11/08/2017 | 4.2 |
| 11/08/2017 | 4.2 |
| 11/08/2017 | 4.5 |
| 11/08/2017 | 4.5 |
| 11/08/2017 | 4.5 |
| 11/08/2017 | 4.3 |
| 11/08/2017 | 4.4 |
| 11/08/2017 | 3.9 |
| 11/08/2017 | 4.2 |
| 11/08/2017 | 4 |
| 11/08/2017 | 3.8 |
| 11/08/2017 | 3.7 |
| 11/08/2017 | 3.7 |
| 11/08/2017 | 3.3 |
| 11/08/2017 | 3 |
| 11/08/2017 | 2.5 |
| 12/08/2017 | 2.6 |
| 12/08/2017 | 2.6 |
| 12/08/2017 | 2.4 |
| 12/08/2017 | 2.4 |
| 12/08/2017 | 2.5 |
| 12/08/2017 | 2.6 |
| 12/08/2017 | 2.7 |
| 12/08/2017 | 2.7 |
| 12/08/2017 | 3.3 |
| 12/08/2017 | 3.8 |
| 12/08/2017 | 3.9 |
| 12/08/2017 | 3.9 |
| 12/08/2017 | 3.8 |
| 12/08/2017 | 3.7 |
| 12/08/2017 | 3.3 |
| 12/08/2017 | 3.5 |
| 12/08/2017 | 3.6 |
| 12/08/2017 | 3.3 |
| 12/08/2017 | 3.3 |
| 12/08/2017 | 3.4 |
| 12/08/2017 | 3.4 |
| 12/08/2017 | 3 |
| 12/08/2017 | 2.6 |
| 12/08/2017 | 2.4 |
| 13/08/2017 | 2.6 |
| 13/08/2017 | 2.1 |
| 13/08/2017 | 2.4 |
| 13/08/2017 | 2.4 |
| 13/08/2017 | 2.2 |
| 13/08/2017 | 2 |
| 13/08/2017 | 2 |
| 13/08/2017 | 2.5 |
| 13/08/2017 | 2.6 |
| 13/08/2017 | 2.9 |
| 13/08/2017 | 3.3 |
| 13/08/2017 | 3.2 |
| 13/08/2017 | 3.3 |
| 13/08/2017 | 3.3 |
| 13/08/2017 | 3 |
| 13/08/2017 | 2.9 |
| 13/08/2017 | 3.1 |
| 13/08/2017 | 3.1 |
| 13/08/2017 | 3.1 |
| 13/08/2017 | 3.2 |
| 13/08/2017 | 3.2 |
| 13/08/2017 | 3.1 |
| 13/08/2017 | 2.6 |
| 13/08/2017 | 2.4 |
| 14/08/2017 | 2.5 |
| 14/08/2017 | 2.1 |
| 14/08/2017 | 2.1 |
| 14/08/2017 | 2.3 |
| 14/08/2017 | 2.6 |
| 14/08/2017 | 3.1 |
| 14/08/2017 | 3.3 |
| 14/08/2017 | 4 |
| 14/08/2017 | 4.4 |
| 14/08/2017 | 4.3 |
| 14/08/2017 | 4.7 |
| 14/08/2017 | 4.4 |
| 14/08/2017 | 4.6 |
| 14/08/2017 | 4.2 |
| 14/08/2017 | 4.3 |
| 14/08/2017 | 4.4 |
| 14/08/2017 | 4.3 |
| 14/08/2017 | 4.2 |
| 14/08/2017 | 3.9 |
| 14/08/2017 | 3.8 |
| 14/08/2017 | 3.6 |
| 14/08/2017 | 3.2 |
| 14/08/2017 | 3.1 |
| 14/08/2017 | 2.6 |
| 15/08/2017 | 2.6 |
| 15/08/2017 | 2.6 |
| 15/08/2017 | 2.5 |
| 15/08/2017 | 2.7 |
| 15/08/2017 | 3 |
| 15/08/2017 | 3.4 |
| 15/08/2017 | 3.7 |
| 15/08/2017 | 3.8 |
| 15/08/2017 | 4.2 |
| 15/08/2017 | 4.6 |
| 15/08/2017 | 4.5 |
| 15/08/2017 | 4.6 |
| 15/08/2017 | 4.3 |
| 15/08/2017 | 4.3 |
| 15/08/2017 | 4.4 |
| 15/08/2017 | 4.2 |
| 15/08/2017 | 4.1 |
| 15/08/2017 | 4 |
| 15/08/2017 | 4.2 |
| 15/08/2017 | 4.1 |
| 15/08/2017 | 3.8 |
| 15/08/2017 | 3.3 |
| 15/08/2017 | 3.2 |
| 15/08/2017 | 2.7 |
| 16/08/2017 | 2.7 |
| 16/08/2017 | 2.2 |
| 16/08/2017 | 2.6 |
| 16/08/2017 | 2.3 |
| 16/08/2017 | 2.5 |
| 16/08/2017 | 3 |
| 16/08/2017 | 3.8 |
| 16/08/2017 | 4 |
| 16/08/2017 | 4.4 |
| 16/08/2017 | 4.4 |
| 16/08/2017 | 4.7 |
| 16/08/2017 | 4.3 |
| 16/08/2017 | 4.5 |
| 16/08/2017 | 4.5 |
| 16/08/2017 | 4.1 |
| 16/08/2017 | 4.2 |
| 16/08/2017 | 4.1 |
| 16/08/2017 | 4.5 |
| 16/08/2017 | 4.3 |
| 16/08/2017 | 4.1 |
| 16/08/2017 | 3.7 |
| 16/08/2017 | 3.4 |
| 16/08/2017 | 2.7 |
| 16/08/2017 | 2.7 |
| 17/08/2017 | 2.7 |
| 17/08/2017 | 2.2 |
| 17/08/2017 | 2.6 |
| 17/08/2017 | 2.7 |
| 17/08/2017 | 2.5 |
| 17/08/2017 | 2.9 |
| 17/08/2017 | 3.7 |
| 17/08/2017 | 3.9 |
| 17/08/2017 | 4.2 |
| 17/08/2017 | 4.7 |
| 17/08/2017 | 4.5 |
| 17/08/2017 | 4.6 |
| 17/08/2017 | 4.3 |
| 17/08/2017 | 4.3 |
| 17/08/2017 | 4.3 |
| 17/08/2017 | 4.4 |
| 17/08/2017 | 4.3 |
| 17/08/2017 | 4.3 |
| 17/08/2017 | 4.1 |
| 17/08/2017 | 4 |
| 17/08/2017 | 3.6 |
| 17/08/2017 | 3.3 |
| 17/08/2017 | 3.2 |
| 17/08/2017 | 2.7 |
| 18/08/2017 | 2.6 |
| 18/08/2017 | 2.6 |
| 18/08/2017 | 2.5 |
| 18/08/2017 | 2.7 |
| 18/08/2017 | 2.9 |
| 18/08/2017 | 3.3 |
| 18/08/2017 | 3.5 |
| 18/08/2017 | 3.8 |
| 18/08/2017 | 4.2 |
| 18/08/2017 | 4.2 |
| 18/08/2017 | 4.5 |
| 18/08/2017 | 4.5 |
| 18/08/2017 | 4.4 |
| 18/08/2017 | 4.3 |
| 18/08/2017 | 4.3 |
| 18/08/2017 | 4.3 |
| 18/08/2017 | 4.1 |
| 18/08/2017 | 4 |
| 18/08/2017 | 4.2 |
| 18/08/2017 | 3.6 |
| 18/08/2017 | 3.7 |
| 18/08/2017 | 3.2 |
| 18/08/2017 | 2.9 |
| 18/08/2017 | 2.5 |
| 19/08/2017 | 2.5 |
| 19/08/2017 | 2.5 |
| 19/08/2017 | 2.3 |
| 19/08/2017 | 2.3 |
| 19/08/2017 | 2.4 |
| 19/08/2017 | 2.6 |
| 19/08/2017 | 2.6 |
| 19/08/2017 | 3.2 |
| 19/08/2017 | 3.3 |
| 19/08/2017 | 3.3 |
| 19/08/2017 | 3.9 |
| 19/08/2017 | 3.9 |
| 19/08/2017 | 3.8 |
| 19/08/2017 | 3.6 |
| 19/08/2017 | 3.3 |
| 19/08/2017 | 3.5 |
| 19/08/2017 | 3.6 |
| 19/08/2017 | 3.4 |
| 19/08/2017 | 3.6 |
| 19/08/2017 | 3.2 |
| 19/08/2017 | 3.4 |
| 19/08/2017 | 2.9 |
| 19/08/2017 | 2.5 |
| 19/08/2017 | 2.3 |
| 20/08/2017 | 2.5 |
| 20/08/2017 | 2.1 |
| 20/08/2017 | 2.3 |
| 20/08/2017 | 2.3 |
| 20/08/2017 | 2.2 |
| 20/08/2017 | 2 |
| 20/08/2017 | 2.5 |
| 20/08/2017 | 2.4 |
| 20/08/2017 | 2.6 |
| 20/08/2017 | 2.9 |
| 20/08/2017 | 3.3 |
| 20/08/2017 | 3.2 |
| 20/08/2017 | 3.3 |
| 20/08/2017 | 3.2 |
| 20/08/2017 | 3 |
| 20/08/2017 | 2.8 |
| 20/08/2017 | 3.1 |
| 20/08/2017 | 3.1 |
| 20/08/2017 | 3.4 |
| 20/08/2017 | 3 |
| 20/08/2017 | 3.2 |
| 20/08/2017 | 3.1 |
| 20/08/2017 | 2.6 |
| 20/08/2017 | 2.4 |
| 21/08/2017 | 2.5 |
| 21/08/2017 | 2 |
| 21/08/2017 | 2.5 |
| 21/08/2017 | 2.2 |
| 21/08/2017 | 2.5 |
| 21/08/2017 | 3.1 |
| 21/08/2017 | 3.8 |
| 21/08/2017 | 4 |
| 21/08/2017 | 4.4 |
| 21/08/2017 | 4.4 |
| 21/08/2017 | 4.2 |
| 21/08/2017 | 4.4 |
| 21/08/2017 | 4.6 |
| 21/08/2017 | 4.1 |
| 21/08/2017 | 4.2 |
| 21/08/2017 | 4.3 |
| 21/08/2017 | 4.2 |
| 21/08/2017 | 4.3 |
| 21/08/2017 | 4.3 |
| 21/08/2017 | 4.2 |
| 21/08/2017 | 3.6 |
| 21/08/2017 | 3.1 |
| 21/08/2017 | 3 |
| 21/08/2017 | 2.5 |
| 22/08/2017 | 2.5 |
| 22/08/2017 | 2.5 |
| 22/08/2017 | 2.5 |
| 22/08/2017 | 2.6 |
| 22/08/2017 | 2.9 |
| 22/08/2017 | 2.9 |
| 22/08/2017 | 3.6 |
| 22/08/2017 | 3.8 |
| 22/08/2017 | 4.2 |
| 22/08/2017 | 4.6 |
| 22/08/2017 | 4.5 |
| 22/08/2017 | 4.6 |
| 22/08/2017 | 4.2 |
| 22/08/2017 | 4.3 |
| 22/08/2017 | 4.4 |
| 22/08/2017 | 4.1 |
| 22/08/2017 | 4.1 |
| 22/08/2017 | 4 |
| 22/08/2017 | 4.1 |
| 22/08/2017 | 4 |
| 22/08/2017 | 3.7 |
| 22/08/2017 | 3.2 |
| 22/08/2017 | 3.1 |
| 22/08/2017 | 2.6 |
| 23/08/2017 | 2.6 |
| 23/08/2017 | 2.6 |
| 23/08/2017 | 2.5 |
| 23/08/2017 | 2.7 |
| 23/08/2017 | 2.5 |
| 23/08/2017 | 3 |
| 23/08/2017 | 3.8 |
| 23/08/2017 | 4 |
| 23/08/2017 | 4.4 |
| 23/08/2017 | 4.4 |
| 23/08/2017 | 4.7 |
| 23/08/2017 | 4.3 |
| 23/08/2017 | 4.5 |
| 23/08/2017 | 4.5 |
| 23/08/2017 | 4.5 |
| 23/08/2017 | 4.1 |
| 23/08/2017 | 4 |
| 23/08/2017 | 4 |
| 23/08/2017 | 4.2 |
| 23/08/2017 | 4 |
| 23/08/2017 | 3.7 |
| 23/08/2017 | 3.3 |
| 23/08/2017 | 3.1 |
| 23/08/2017 | 2.6 |
| 24/08/2017 | 2.6 |
| 24/08/2017 | 2.6 |
| 24/08/2017 | 2.5 |
| 24/08/2017 | 2.6 |
| 24/08/2017 | 2.5 |
| 24/08/2017 | 2.9 |
| 24/08/2017 | 3.7 |
| 24/08/2017 | 3.9 |
| 24/08/2017 | 4.2 |
| 24/08/2017 | 4.2 |
| 24/08/2017 | 4.5 |
| 24/08/2017 | 4.6 |
| 24/08/2017 | 4.2 |
| 24/08/2017 | 4.2 |
| 24/08/2017 | 4.3 |
| 24/08/2017 | 4.4 |
| 24/08/2017 | 4.3 |
| 24/08/2017 | 4.3 |
| 24/08/2017 | 4 |
| 24/08/2017 | 3.9 |
| 24/08/2017 | 3.6 |
| 24/08/2017 | 3.2 |
| 24/08/2017 | 3.1 |
| 24/08/2017 | 2.6 |
| 25/08/2017 | 2.5 |
| 25/08/2017 | 2.5 |
| 25/08/2017 | 2.5 |
| 25/08/2017 | 2.6 |
| 25/08/2017 | 2.9 |
| 25/08/2017 | 3.3 |
| 25/08/2017 | 3.5 |
| 25/08/2017 | 3.8 |
| 25/08/2017 | 4.3 |
| 25/08/2017 | 4.3 |
| 25/08/2017 | 4.5 |
| 25/08/2017 | 4.5 |
| 25/08/2017 | 4.4 |
| 25/08/2017 | 4.3 |
| 25/08/2017 | 4.2 |
| 25/08/2017 | 4.3 |
| 25/08/2017 | 4.1 |
| 25/08/2017 | 4 |
| 25/08/2017 | 4 |
| 25/08/2017 | 4 |
| 25/08/2017 | 3.7 |
| 25/08/2017 | 3.1 |
| 25/08/2017 | 2.9 |
| 25/08/2017 | 2.4 |
| 26/08/2017 | 2.5 |
| 26/08/2017 | 2.4 |
| 26/08/2017 | 2.2 |
| 26/08/2017 | 2.2 |
| 26/08/2017 | 2.4 |
| 26/08/2017 | 2.6 |
| 26/08/2017 | 2.6 |
| 26/08/2017 | 3.1 |
| 26/08/2017 | 3.3 |
| 26/08/2017 | 3.4 |
| 26/08/2017 | 3.9 |
| 26/08/2017 | 3.9 |
| 26/08/2017 | 3.7 |
| 26/08/2017 | 3.6 |
| 26/08/2017 | 3.2 |
| 26/08/2017 | 3.4 |
| 26/08/2017 | 3.5 |
| 26/08/2017 | 3.4 |
| 26/08/2017 | 3.5 |
| 26/08/2017 | 3.6 |
| 26/08/2017 | 3.4 |
| 26/08/2017 | 2.8 |
| 26/08/2017 | 2.9 |
| 26/08/2017 | 2.3 |
| 27/08/2017 | 2.4 |
| 27/08/2017 | 2.5 |
| 27/08/2017 | 2.3 |
| 27/08/2017 | 2.2 |
| 27/08/2017 | 2.2 |
| 27/08/2017 | 2 |
| 27/08/2017 | 2.5 |
| 27/08/2017 | 2.4 |
| 27/08/2017 | 2.6 |
| 27/08/2017 | 2.9 |
| 27/08/2017 | 3.4 |
| 27/08/2017 | 3.2 |
| 27/08/2017 | 3.3 |
| 27/08/2017 | 3.2 |
| 27/08/2017 | 2.9 |
| 27/08/2017 | 3.3 |
| 27/08/2017 | 3.1 |
| 27/08/2017 | 3.2 |
| 27/08/2017 | 3.2 |
| 27/08/2017 | 3.4 |
| 27/08/2017 | 3.2 |
| 27/08/2017 | 3 |
| 27/08/2017 | 2.5 |
| 27/08/2017 | 2.3 |
| 28/08/2017 | 2.4 |
| 28/08/2017 | 2.5 |
| 28/08/2017 | 2.4 |
| 28/08/2017 | 2.6 |
| 28/08/2017 | 2.5 |
| 28/08/2017 | 3.1 |
| 28/08/2017 | 3.8 |
| 28/08/2017 | 4 |
| 28/08/2017 | 4.4 |
| 28/08/2017 | 4.4 |
| 28/08/2017 | 4.2 |
| 28/08/2017 | 4.4 |
| 28/08/2017 | 4.5 |
| 28/08/2017 | 4.1 |
| 28/08/2017 | 4.2 |
| 28/08/2017 | 4.2 |
| 28/08/2017 | 4.2 |
| 28/08/2017 | 4.3 |
| 28/08/2017 | 4.2 |
| 28/08/2017 | 4.1 |
| 28/08/2017 | 3.5 |
| 28/08/2017 | 3.1 |
| 28/08/2017 | 2.9 |
| 28/08/2017 | 2.4 |
| 29/08/2017 | 2.4 |
| 29/08/2017 | 2.4 |
| 29/08/2017 | 2.4 |
| 29/08/2017 | 2.5 |
| 29/08/2017 | 2.9 |
| 29/08/2017 | 2.9 |
| 29/08/2017 | 3.6 |
| 29/08/2017 | 3.8 |
| 29/08/2017 | 4.2 |
| 29/08/2017 | 4.7 |
| 29/08/2017 | 4.5 |
| 29/08/2017 | 4.5 |
| 29/08/2017 | 4.7 |
| 29/08/2017 | 4.2 |
| 29/08/2017 | 4.3 |
| 29/08/2017 | 4.1 |
| 29/08/2017 | 4.1 |
| 29/08/2017 | 4.1 |
| 29/08/2017 | 4.5 |
| 29/08/2017 | 3.9 |
| 29/08/2017 | 3.7 |
| 29/08/2017 | 3.2 |
| 29/08/2017 | 3 |
| 29/08/2017 | 2.6 |
| 30/08/2017 | 2.5 |
| 30/08/2017 | 2.5 |
| 30/08/2017 | 2.4 |
| 30/08/2017 | 2.6 |
| 30/08/2017 | 2.5 |
| 30/08/2017 | 3.1 |
| 30/08/2017 | 3.7 |
| 30/08/2017 | 4 |
| 30/08/2017 | 4.4 |
| 30/08/2017 | 4.4 |
| 30/08/2017 | 4.7 |
| 30/08/2017 | 4.3 |
| 30/08/2017 | 4.4 |
| 30/08/2017 | 4.5 |
| 30/08/2017 | 4.5 |
| 30/08/2017 | 4.1 |
| 30/08/2017 | 4 |
| 30/08/2017 | 4 |
| 30/08/2017 | 4.6 |
| 30/08/2017 | 4 |
| 30/08/2017 | 3.7 |
| 30/08/2017 | 3.2 |
| 30/08/2017 | 3 |
| 30/08/2017 | 2.5 |
| 31/08/2017 | 2.5 |
| 31/08/2017 | 2.5 |
| 31/08/2017 | 2.4 |
| 31/08/2017 | 2.5 |
| 31/08/2017 | 2.9 |
| 31/08/2017 | 3 |
| 31/08/2017 | 3.6 |
| 31/08/2017 | 3.8 |
| 31/08/2017 | 4.2 |
| 31/08/2017 | 4.2 |
| 31/08/2017 | 4.6 |
| 31/08/2017 | 4.6 |
| 31/08/2017 | 4.7 |
| 31/08/2017 | 4.2 |
| 31/08/2017 | 4.2 |
| 31/08/2017 | 4.3 |
| 31/08/2017 | 4.2 |
| 31/08/2017 | 4.3 |
| 31/08/2017 | 4.4 |
| 31/08/2017 | 4.3 |
| 31/08/2017 | 3.6 |
| 31/08/2017 | 3.1 |
| 31/08/2017 | 3 |
| 31/08/2017 | 2.5 |
| 01/09/2017 | 2.5 |
| 01/09/2017 | 2.5 |
| 01/09/2017 | 2.4 |
| 01/09/2017 | 2.5 |
| 01/09/2017 | 2.9 |
| 01/09/2017 | 3.3 |
| 01/09/2017 | 3.4 |
| 01/09/2017 | 4.3 |
| 01/09/2017 | 4.3 |
| 01/09/2017 | 4.3 |
| 01/09/2017 | 4.5 |
| 01/09/2017 | 4.5 |
| 01/09/2017 | 4.4 |
| 01/09/2017 | 4.2 |
| 01/09/2017 | 4.1 |
| 01/09/2017 | 4.2 |
| 01/09/2017 | 4.1 |
| 01/09/2017 | 4 |
| 01/09/2017 | 3.9 |
| 01/09/2017 | 3.9 |
| 01/09/2017 | 3.7 |
| 01/09/2017 | 3.1 |
| 01/09/2017 | 2.8 |
| 01/09/2017 | 2.8 |
| 02/09/2017 | 2.4 |
| 02/09/2017 | 2.4 |
| 02/09/2017 | 2.2 |
| 02/09/2017 | 2.2 |
| 02/09/2017 | 2.6 |
| 02/09/2017 | 2.7 |
| 02/09/2017 | 2.8 |
| 02/09/2017 | 2.8 |
| 02/09/2017 | 3.3 |
| 02/09/2017 | 3.8 |
| 02/09/2017 | 3.8 |
| 02/09/2017 | 3.8 |
| 02/09/2017 | 3.7 |
| 02/09/2017 | 3.6 |
| 02/09/2017 | 3.3 |
| 02/09/2017 | 3.5 |
| 02/09/2017 | 3.5 |
| 02/09/2017 | 3.5 |
| 02/09/2017 | 3.9 |
| 02/09/2017 | 3.6 |
| 02/09/2017 | 3.4 |
| 02/09/2017 | 3 |
| 02/09/2017 | 2.5 |
| 02/09/2017 | 2.7 |
| 03/09/2017 | 2.4 |
| 03/09/2017 | 2.4 |
| 03/09/2017 | 2.2 |
| 03/09/2017 | 2.2 |
| 03/09/2017 | 2.4 |
| 03/09/2017 | 2.1 |
| 03/09/2017 | 2.1 |
| 03/09/2017 | 2.5 |
| 03/09/2017 | 3.1 |
| 03/09/2017 | 3.3 |
| 03/09/2017 | 3.2 |
| 03/09/2017 | 3.6 |
| 03/09/2017 | 3.2 |
| 03/09/2017 | 3.2 |
| 03/09/2017 | 2.9 |
| 03/09/2017 | 3.2 |
| 03/09/2017 | 3.1 |
| 03/09/2017 | 3.2 |
| 03/09/2017 | 3.7 |
| 03/09/2017 | 3.3 |
| 03/09/2017 | 3.1 |
| 03/09/2017 | 3.1 |
| 03/09/2017 | 2.5 |
| 03/09/2017 | 2.7 |
| 04/09/2017 | 2.3 |
| 04/09/2017 | 2.4 |
| 04/09/2017 | 2.4 |
| 04/09/2017 | 2.6 |
| 04/09/2017 | 2.7 |
| 04/09/2017 | 3.5 |
| 04/09/2017 | 3.8 |
| 04/09/2017 | 4.4 |
| 04/09/2017 | 4.5 |
| 04/09/2017 | 4.3 |
| 04/09/2017 | 4.6 |
| 04/09/2017 | 4.3 |
| 04/09/2017 | 4.6 |
| 04/09/2017 | 4.3 |
| 04/09/2017 | 4.3 |
| 04/09/2017 | 4.4 |
| 04/09/2017 | 4.3 |
| 04/09/2017 | 4.5 |
| 04/09/2017 | 4.3 |
| 04/09/2017 | 4.2 |
| 04/09/2017 | 3.6 |
| 04/09/2017 | 3.2 |
| 04/09/2017 | 2.9 |
| 04/09/2017 | 2.4 |
| 05/09/2017 | 2.3 |
| 05/09/2017 | 2.4 |
| 05/09/2017 | 2.3 |
| 05/09/2017 | 2.5 |
| 05/09/2017 | 2.6 |
| 05/09/2017 | 3.3 |
| 05/09/2017 | 3.6 |
| 05/09/2017 | 4.2 |
| 05/09/2017 | 4.3 |
| 05/09/2017 | 4.6 |
| 05/09/2017 | 4.4 |
| 05/09/2017 | 4.5 |
| 05/09/2017 | 4.7 |
| 05/09/2017 | 4.4 |
| 05/09/2017 | 4.5 |
| 05/09/2017 | 4.2 |
| 05/09/2017 | 4.2 |
| 05/09/2017 | 4.3 |
| 05/09/2017 | 4.6 |
| 05/09/2017 | 4.6 |
| 05/09/2017 | 3.8 |
| 05/09/2017 | 3.3 |
| 05/09/2017 | 3 |
| 05/09/2017 | 2.5 |
| 06/09/2017 | 2.4 |
| 06/09/2017 | 2.5 |
| 06/09/2017 | 2.4 |
| 06/09/2017 | 2.6 |
| 06/09/2017 | 2.7 |
| 06/09/2017 | 3.4 |
| 06/09/2017 | 3.8 |
| 06/09/2017 | 4.4 |
| 06/09/2017 | 4.6 |
| 06/09/2017 | 4.4 |
| 06/09/2017 | 4.6 |
| 06/09/2017 | 4.8 |
| 06/09/2017 | 4.5 |
| 06/09/2017 | 4.6 |
| 06/09/2017 | 4.6 |
| 06/09/2017 | 4.2 |
| 06/09/2017 | 4.1 |
| 06/09/2017 | 4.3 |
| 06/09/2017 | 4.7 |
| 06/09/2017 | 4.1 |
| 06/09/2017 | 3.7 |
| 06/09/2017 | 3.4 |
| 06/09/2017 | 3.1 |
| 06/09/2017 | 2.5 |
| 07/09/2017 | 2.4 |
| 07/09/2017 | 2.4 |
| 07/09/2017 | 2.4 |
| 07/09/2017 | 2.5 |
| 07/09/2017 | 2.7 |
| 07/09/2017 | 3.3 |
| 07/09/2017 | 3.7 |
| 07/09/2017 | 4.2 |
| 07/09/2017 | 4.4 |
| 07/09/2017 | 4.7 |
| 07/09/2017 | 4.5 |
| 07/09/2017 | 4.6 |
| 07/09/2017 | 4.7 |
| 07/09/2017 | 4.3 |
| 07/09/2017 | 4.4 |
| 07/09/2017 | 4.4 |
| 07/09/2017 | 4.3 |
| 07/09/2017 | 4.6 |
| 07/09/2017 | 4.5 |
| 07/09/2017 | 4.5 |
| 07/09/2017 | 3.6 |
| 07/09/2017 | 3.3 |
| 07/09/2017 | 3 |
| 07/09/2017 | 2.5 |
| 08/09/2017 | 2.4 |
| 08/09/2017 | 2.4 |
| 08/09/2017 | 2.3 |
| 08/09/2017 | 2.5 |
| 08/09/2017 | 2.6 |
| 08/09/2017 | 3.2 |
| 08/09/2017 | 4 |
| 08/09/2017 | 4.2 |
| 08/09/2017 | 4.4 |
| 08/09/2017 | 4.7 |
| 08/09/2017 | 4.4 |
| 08/09/2017 | 4.5 |
| 08/09/2017 | 4.4 |
| 08/09/2017 | 4.4 |
| 08/09/2017 | 4.3 |
| 08/09/2017 | 4.3 |
| 08/09/2017 | 4.2 |
| 08/09/2017 | 4.2 |
| 08/09/2017 | 4.6 |
| 08/09/2017 | 4 |
| 08/09/2017 | 3.7 |
| 08/09/2017 | 3.2 |
| 08/09/2017 | 2.8 |
| 08/09/2017 | 2.7 |
| 09/09/2017 | 2.3 |
| 09/09/2017 | 2.3 |
| 09/09/2017 | 2.1 |
| 09/09/2017 | 2.1 |
| 09/09/2017 | 2.6 |
| 09/09/2017 | 2.3 |
| 09/09/2017 | 2.8 |
| 09/09/2017 | 2.8 |
| 09/09/2017 | 3.3 |
| 09/09/2017 | 3.8 |
| 09/09/2017 | 3.8 |
| 09/09/2017 | 3.8 |
| 09/09/2017 | 3.7 |
| 09/09/2017 | 3.6 |
| 09/09/2017 | 3.2 |
| 09/09/2017 | 3.4 |
| 09/09/2017 | 3.5 |
| 09/09/2017 | 3.5 |
| 09/09/2017 | 3.8 |
| 09/09/2017 | 3.5 |
| 09/09/2017 | 3.3 |
| 09/09/2017 | 2.9 |
| 09/09/2017 | 2.9 |
| 09/09/2017 | 2.6 |
| 10/09/2017 | 2.3 |
| 10/09/2017 | 2.3 |
| 10/09/2017 | 2.2 |
| 10/09/2017 | 2.1 |
| 10/09/2017 | 2.3 |
| 10/09/2017 | 2.1 |
| 10/09/2017 | 2.6 |
| 10/09/2017 | 2.5 |
| 10/09/2017 | 3.1 |
| 10/09/2017 | 3.3 |
| 10/09/2017 | 3.2 |
| 10/09/2017 | 3.6 |
| 10/09/2017 | 3.2 |
| 10/09/2017 | 3.2 |
| 10/09/2017 | 3.4 |
| 10/09/2017 | 3.2 |
| 10/09/2017 | 3 |
| 10/09/2017 | 3.2 |
| 10/09/2017 | 3.5 |
| 10/09/2017 | 3.7 |
| 10/09/2017 | 3.1 |
| 10/09/2017 | 3.1 |
| 10/09/2017 | 2.9 |
| 10/09/2017 | 2.6 |
| 11/09/2017 | 2.2 |
| 11/09/2017 | 2.3 |
| 11/09/2017 | 2.3 |
| 11/09/2017 | 2.5 |
| 11/09/2017 | 2.7 |
| 11/09/2017 | 3 |
| 11/09/2017 | 3.8 |
| 11/09/2017 | 4.3 |
| 11/09/2017 | 4.6 |
| 11/09/2017 | 4.4 |
| 11/09/2017 | 4.6 |
| 11/09/2017 | 4.3 |
| 11/09/2017 | 4.6 |
| 11/09/2017 | 4.2 |
| 11/09/2017 | 4.3 |
| 11/09/2017 | 4.3 |
| 11/09/2017 | 4.3 |
| 11/09/2017 | 4.5 |
| 11/09/2017 | 4.8 |
| 11/09/2017 | 4.2 |
| 11/09/2017 | 3.6 |
| 11/09/2017 | 3.1 |
| 11/09/2017 | 2.9 |
| 11/09/2017 | 2.8 |
| 12/09/2017 | 2.3 |
| 12/09/2017 | 2.3 |
| 12/09/2017 | 2.3 |
| 12/09/2017 | 2.4 |
| 12/09/2017 | 2.6 |
| 12/09/2017 | 3.3 |
| 12/09/2017 | 3.6 |
| 12/09/2017 | 4.2 |
| 12/09/2017 | 4.4 |
| 12/09/2017 | 4.7 |
| 12/09/2017 | 4.4 |
| 12/09/2017 | 4.5 |
| 12/09/2017 | 4.7 |
| 12/09/2017 | 4.3 |
| 12/09/2017 | 4.4 |
| 12/09/2017 | 4.1 |
| 12/09/2017 | 4.1 |
| 12/09/2017 | 4.3 |
| 12/09/2017 | 4.6 |
| 12/09/2017 | 4.5 |
| 12/09/2017 | 3.8 |
| 12/09/2017 | 3.2 |
| 12/09/2017 | 3 |
| 12/09/2017 | 2.4 |
| 13/09/2017 | 2.4 |
| 13/09/2017 | 2.4 |
| 13/09/2017 | 2.3 |
| 13/09/2017 | 2.5 |
| 13/09/2017 | 2.7 |
| 13/09/2017 | 3.5 |
| 13/09/2017 | 3.8 |
| 13/09/2017 | 4.4 |
| 13/09/2017 | 4.6 |
| 13/09/2017 | 4.4 |
| 13/09/2017 | 4.7 |
| 13/09/2017 | 4.8 |
| 13/09/2017 | 4.5 |
| 13/09/2017 | 4.6 |
| 13/09/2017 | 4.6 |
| 13/09/2017 | 4.1 |
| 13/09/2017 | 4.6 |
| 13/09/2017 | 4.3 |
| 13/09/2017 | 4.7 |
| 13/09/2017 | 4.5 |
| 13/09/2017 | 3.7 |
| 13/09/2017 | 3.3 |
| 13/09/2017 | 3 |
| 13/09/2017 | 2.4 |
| 14/09/2017 | 2.4 |
| 14/09/2017 | 2.4 |
| 14/09/2017 | 2.3 |
| 14/09/2017 | 2.5 |
| 14/09/2017 | 2.7 |
| 14/09/2017 | 3.4 |
| 14/09/2017 | 3.7 |
| 14/09/2017 | 4.2 |
| 14/09/2017 | 4.4 |
| 14/09/2017 | 4.7 |
| 14/09/2017 | 4.5 |
| 14/09/2017 | 4.6 |
| 14/09/2017 | 4.7 |
| 14/09/2017 | 4.3 |
| 14/09/2017 | 4.3 |
| 14/09/2017 | 4.4 |
| 14/09/2017 | 4.3 |
| 14/09/2017 | 4.1 |
| 14/09/2017 | 4.5 |
| 14/09/2017 | 4.4 |
| 14/09/2017 | 3.6 |
| 14/09/2017 | 3.2 |
| 14/09/2017 | 3 |
| 14/09/2017 | 2.4 |
| 15/09/2017 | 2.3 |
| 15/09/2017 | 2.4 |
| 15/09/2017 | 2.3 |
| 15/09/2017 | 2.4 |
| 15/09/2017 | 2.6 |
| 15/09/2017 | 3.2 |
| 15/09/2017 | 4 |
| 15/09/2017 | 4.2 |
| 15/09/2017 | 4.5 |
| 15/09/2017 | 4.8 |
| 15/09/2017 | 4.5 |
| 15/09/2017 | 4.5 |
| 15/09/2017 | 4.4 |
| 15/09/2017 | 4.3 |
| 15/09/2017 | 4.3 |
| 15/09/2017 | 4.3 |
| 15/09/2017 | 4.2 |
| 15/09/2017 | 4.4 |
| 15/09/2017 | 4.5 |
| 15/09/2017 | 4.3 |
| 15/09/2017 | 3.7 |
| 15/09/2017 | 3.2 |
| 15/09/2017 | 2.8 |
| 15/09/2017 | 2.7 |
| 16/09/2017 | 2.3 |
| 16/09/2017 | 2.3 |
| 16/09/2017 | 2.1 |
| 16/09/2017 | 2.1 |
| 16/09/2017 | 2.6 |
| 16/09/2017 | 2.3 |
| 16/09/2017 | 2.9 |
| 16/09/2017 | 2.9 |
| 16/09/2017 | 3.4 |
| 16/09/2017 | 3.8 |
| 16/09/2017 | 3.8 |
| 16/09/2017 | 3.8 |
| 16/09/2017 | 3.7 |
| 16/09/2017 | 3.6 |
| 16/09/2017 | 3.7 |
| 16/09/2017 | 3.4 |
| 16/09/2017 | 3.6 |
| 16/09/2017 | 3.7 |
| 16/09/2017 | 3.7 |
| 16/09/2017 | 3.7 |
| 16/09/2017 | 3.4 |
| 16/09/2017 | 2.9 |
| 16/09/2017 | 2.9 |
| 16/09/2017 | 2.6 |
| 17/09/2017 | 2.3 |
| 17/09/2017 | 2.3 |
| 17/09/2017 | 2.1 |
| 17/09/2017 | 2.1 |
| 17/09/2017 | 2.3 |
| 17/09/2017 | 2.1 |
| 17/09/2017 | 2.2 |
| 17/09/2017 | 2.6 |
| 17/09/2017 | 2.7 |
| 17/09/2017 | 3.4 |
| 17/09/2017 | 3.2 |
| 17/09/2017 | 3.1 |
| 17/09/2017 | 3.2 |
| 17/09/2017 | 3.2 |
| 17/09/2017 | 3.4 |
| 17/09/2017 | 3.2 |
| 17/09/2017 | 3.2 |
| 17/09/2017 | 3.5 |
| 17/09/2017 | 3.4 |
| 17/09/2017 | 3.4 |
| 17/09/2017 | 3.1 |
| 17/09/2017 | 3.1 |
| 17/09/2017 | 3 |
| 17/09/2017 | 2.7 |
| 18/09/2017 | 2.2 |
| 18/09/2017 | 2.4 |
| 18/09/2017 | 2.3 |
| 18/09/2017 | 2.5 |
| 18/09/2017 | 2.7 |
| 18/09/2017 | 3.1 |
| 18/09/2017 | 3.9 |
| 18/09/2017 | 4 |
| 18/09/2017 | 4.2 |
| 18/09/2017 | 4.5 |
| 18/09/2017 | 4.7 |
| 18/09/2017 | 4.4 |
| 18/09/2017 | 4.6 |
| 18/09/2017 | 4.2 |
| 18/09/2017 | 4.3 |
| 18/09/2017 | 4.4 |
| 18/09/2017 | 4.5 |
| 18/09/2017 | 4.5 |
| 18/09/2017 | 4.7 |
| 18/09/2017 | 4.4 |
| 18/09/2017 | 3.6 |
| 18/09/2017 | 3.2 |
| 18/09/2017 | 2.9 |
| 18/09/2017 | 2.8 |
| 19/09/2017 | 2.3 |
| 19/09/2017 | 2.3 |
| 19/09/2017 | 2.3 |
| 19/09/2017 | 2.4 |
| 19/09/2017 | 2.6 |
| 19/09/2017 | 3.5 |
| 19/09/2017 | 3.8 |
| 19/09/2017 | 4.4 |
| 19/09/2017 | 4.5 |
| 19/09/2017 | 4.8 |
| 19/09/2017 | 4.5 |
| 19/09/2017 | 4.6 |
| 19/09/2017 | 4.8 |
| 19/09/2017 | 4.4 |
| 19/09/2017 | 4.4 |
| 19/09/2017 | 4.2 |
| 19/09/2017 | 4.4 |
| 19/09/2017 | 4.4 |
| 19/09/2017 | 4.5 |
| 19/09/2017 | 4.6 |
| 19/09/2017 | 3.8 |
| 19/09/2017 | 3.3 |
| 19/09/2017 | 3 |
| 19/09/2017 | 2.5 |
| 20/09/2017 | 2.4 |
| 20/09/2017 | 2.4 |
| 20/09/2017 | 2.4 |
| 20/09/2017 | 2.5 |
| 20/09/2017 | 2.7 |
| 20/09/2017 | 3.1 |
| 20/09/2017 | 4.1 |
| 20/09/2017 | 4.1 |
| 20/09/2017 | 4.3 |
| 20/09/2017 | 4.6 |
| 20/09/2017 | 4.8 |
| 20/09/2017 | 4.9 |
| 20/09/2017 | 4.5 |
| 20/09/2017 | 4.6 |
| 20/09/2017 | 4.6 |
| 20/09/2017 | 4.3 |
| 20/09/2017 | 4.4 |
| 20/09/2017 | 4.5 |
| 20/09/2017 | 4.6 |
| 20/09/2017 | 4.6 |
| 20/09/2017 | 3.8 |
| 20/09/2017 | 3.4 |
| 20/09/2017 | 3.1 |
| 20/09/2017 | 2.5 |
| 21/09/2017 | 2.4 |
| 21/09/2017 | 2.4 |
| 21/09/2017 | 2.4 |
| 21/09/2017 | 2.5 |
| 21/09/2017 | 2.7 |
| 21/09/2017 | 3.6 |
| 21/09/2017 | 4 |
| 21/09/2017 | 4 |
| 21/09/2017 | 4.6 |
| 21/09/2017 | 4.4 |
| 21/09/2017 | 4.6 |
| 21/09/2017 | 4.7 |
| 21/09/2017 | 4.3 |
| 21/09/2017 | 4.4 |
| 21/09/2017 | 4.4 |
| 21/09/2017 | 4.5 |
| 21/09/2017 | 4.2 |
| 21/09/2017 | 4.4 |
| 21/09/2017 | 4.5 |
| 21/09/2017 | 4.4 |
| 21/09/2017 | 3.7 |
| 21/09/2017 | 3.3 |
| 21/09/2017 | 3.1 |
| 21/09/2017 | 2.5 |
| 22/09/2017 | 2.4 |
| 22/09/2017 | 2.4 |
| 22/09/2017 | 2.3 |
| 22/09/2017 | 2.5 |
| 22/09/2017 | 2.6 |
| 22/09/2017 | 3.4 |
| 22/09/2017 | 3.8 |
| 22/09/2017 | 4.5 |
| 22/09/2017 | 4.7 |
| 22/09/2017 | 4.5 |
| 22/09/2017 | 4.6 |
| 22/09/2017 | 4.6 |
| 22/09/2017 | 4.5 |
| 22/09/2017 | 4.4 |
| 22/09/2017 | 4.3 |
| 22/09/2017 | 4.5 |
| 22/09/2017 | 4.1 |
| 22/09/2017 | 4.1 |
| 22/09/2017 | 4.5 |
| 22/09/2017 | 4.4 |
| 22/09/2017 | 3.8 |
| 22/09/2017 | 3.2 |
| 22/09/2017 | 2.9 |
| 22/09/2017 | 2.8 |
| 23/09/2017 | 2.3 |
| 23/09/2017 | 2.3 |
| 23/09/2017 | 2.1 |
| 23/09/2017 | 2.1 |
| 23/09/2017 | 2.6 |
| 23/09/2017 | 2.5 |
| 23/09/2017 | 2.6 |
| 23/09/2017 | 3.1 |
| 23/09/2017 | 3.6 |
| 23/09/2017 | 3.5 |
| 23/09/2017 | 3.9 |
| 23/09/2017 | 3.9 |
| 23/09/2017 | 3.7 |
| 23/09/2017 | 3.6 |
| 23/09/2017 | 3.3 |
| 23/09/2017 | 3.5 |
| 23/09/2017 | 3.4 |
| 23/09/2017 | 3.9 |
| 23/09/2017 | 4.1 |
| 23/09/2017 | 3.8 |
| 23/09/2017 | 3.4 |
| 23/09/2017 | 2.9 |
| 23/09/2017 | 2.5 |
| 23/09/2017 | 2.7 |
| 24/09/2017 | 2.3 |
| 24/09/2017 | 2.4 |
| 24/09/2017 | 2.2 |
| 24/09/2017 | 2.2 |
| 24/09/2017 | 2.4 |
| 24/09/2017 | 2.3 |
| 24/09/2017 | 2.4 |
| 24/09/2017 | 2.7 |
| 24/09/2017 | 2.8 |
| 24/09/2017 | 3 |
| 24/09/2017 | 3.3 |
| 24/09/2017 | 3.2 |
| 24/09/2017 | 3.3 |
| 24/09/2017 | 3.2 |
| 24/09/2017 | 2.9 |
| 24/09/2017 | 3.4 |
| 24/09/2017 | 3.5 |
| 24/09/2017 | 3.6 |
| 24/09/2017 | 3.8 |
| 24/09/2017 | 3.4 |
| 24/09/2017 | 3.2 |
| 24/09/2017 | 3.1 |
| 24/09/2017 | 2.5 |
| 24/09/2017 | 2.7 |
| 25/09/2017 | 2.3 |
| 25/09/2017 | 2.4 |
| 25/09/2017 | 2.4 |
| 25/09/2017 | 2.6 |
| 25/09/2017 | 2.8 |
| 25/09/2017 | 3.3 |
| 25/09/2017 | 3.7 |
| 25/09/2017 | 4.3 |
| 25/09/2017 | 4.4 |
| 25/09/2017 | 4.6 |
| 25/09/2017 | 4.4 |
| 25/09/2017 | 4.5 |
| 25/09/2017 | 4.7 |
| 25/09/2017 | 4.3 |
| 25/09/2017 | 4.4 |
| 25/09/2017 | 4.5 |
| 25/09/2017 | 4.4 |
| 25/09/2017 | 4.7 |
| 25/09/2017 | 4.7 |
| 25/09/2017 | 4.4 |
| 25/09/2017 | 3.6 |
| 25/09/2017 | 3.2 |
| 25/09/2017 | 3 |
| 25/09/2017 | 2.4 |
| 26/09/2017 | 2.3 |
| 26/09/2017 | 2.4 |
| 26/09/2017 | 2.3 |
| 26/09/2017 | 2.5 |
| 26/09/2017 | 2.7 |
| 26/09/2017 | 3.2 |
| 26/09/2017 | 4.1 |
| 26/09/2017 | 4.1 |
| 26/09/2017 | 4.2 |
| 26/09/2017 | 4.4 |
| 26/09/2017 | 4.6 |
| 26/09/2017 | 4.7 |
| 26/09/2017 | 4.4 |
| 26/09/2017 | 4.4 |
| 26/09/2017 | 4.5 |
| 26/09/2017 | 4.4 |
| 26/09/2017 | 4.3 |
| 26/09/2017 | 4.6 |
| 26/09/2017 | 4.5 |
| 26/09/2017 | 4.7 |
| 26/09/2017 | 3.8 |
| 26/09/2017 | 3.4 |
| 26/09/2017 | 3.1 |
| 26/09/2017 | 2.5 |
| 27/09/2017 | 2.4 |
| 27/09/2017 | 2.5 |
| 27/09/2017 | 2.4 |
| 27/09/2017 | 2.6 |
| 27/09/2017 | 2.8 |
| 27/09/2017 | 3.3 |
| 27/09/2017 | 3.9 |
| 27/09/2017 | 4.4 |
| 27/09/2017 | 4.5 |
| 27/09/2017 | 4.7 |
| 27/09/2017 | 4.4 |
| 27/09/2017 | 4.5 |
| 27/09/2017 | 4.6 |
| 27/09/2017 | 4.7 |
| 27/09/2017 | 4.2 |
| 27/09/2017 | 4.4 |
| 27/09/2017 | 4.3 |
| 27/09/2017 | 4.7 |
| 27/09/2017 | 4.6 |
| 27/09/2017 | 4.7 |
| 27/09/2017 | 3.8 |
| 27/09/2017 | 3.4 |
| 27/09/2017 | 3.2 |
| 27/09/2017 | 2.5 |
| 28/09/2017 | 2.5 |
| 28/09/2017 | 2.5 |
| 28/09/2017 | 2.4 |
| 28/09/2017 | 2.6 |
| 28/09/2017 | 2.8 |
| 28/09/2017 | 3.2 |
| 28/09/2017 | 3.8 |
| 28/09/2017 | 4.3 |
| 28/09/2017 | 4.3 |
| 28/09/2017 | 4.6 |
| 28/09/2017 | 4.8 |
| 28/09/2017 | 4.8 |
| 28/09/2017 | 4.4 |
| 28/09/2017 | 4.4 |
| 28/09/2017 | 4.5 |
| 28/09/2017 | 4.2 |
| 28/09/2017 | 4.6 |
| 28/09/2017 | 4.6 |
| 28/09/2017 | 5 |
| 28/09/2017 | 4.5 |
| 28/09/2017 | 3.7 |
| 28/09/2017 | 3.4 |
| 28/09/2017 | 3.2 |
| 28/09/2017 | 2.5 |
| 29/09/2017 | 2.4 |
| 29/09/2017 | 2.5 |
| 29/09/2017 | 2.4 |
| 29/09/2017 | 2.5 |
| 29/09/2017 | 2.7 |
| 29/09/2017 | 3.6 |
| 29/09/2017 | 4.1 |
| 29/09/2017 | 4.2 |
| 29/09/2017 | 4.4 |
| 29/09/2017 | 4.6 |
| 29/09/2017 | 4.7 |
| 29/09/2017 | 4.7 |
| 29/09/2017 | 4.6 |
| 29/09/2017 | 4.5 |
| 29/09/2017 | 4.4 |
| 29/09/2017 | 4.1 |
| 29/09/2017 | 4.5 |
| 29/09/2017 | 4.3 |
| 29/09/2017 | 4.4 |
| 29/09/2017 | 4.5 |
| 29/09/2017 | 3.8 |
| 29/09/2017 | 3.3 |
| 29/09/2017 | 3 |
| 29/09/2017 | 2.8 |
| 30/09/2017 | 2.4 |
| 30/09/2017 | 2.4 |
| 30/09/2017 | 2.2 |
| 30/09/2017 | 2.2 |
| 30/09/2017 | 2.2 |
| 30/09/2017 | 2.6 |
| 30/09/2017 | 2.8 |
| 30/09/2017 | 3.3 |
| 30/09/2017 | 3.7 |
| 30/09/2017 | 3.6 |
| 30/09/2017 | 4 |
| 30/09/2017 | 4 |
| 30/09/2017 | 3.8 |
| 30/09/2017 | 3.7 |
| 30/09/2017 | 3.3 |
| 30/09/2017 | 3.7 |
| 30/09/2017 | 3.7 |
| 30/09/2017 | 4 |
| 30/09/2017 | 4 |
| 30/09/2017 | 3.8 |
| 30/09/2017 | 3.4 |
| 30/09/2017 | 3 |
| 30/09/2017 | 2.6 |
| 30/09/2017 | 2.7 |
| 01/10/2017 | 2.4 |
| 01/10/2017 | 2.4 |
| 01/10/2017 | 2.2 |
| 01/10/2017 | 2.2 |
| 01/10/2017 | 2.4 |
| 01/10/2017 | 2.4 |
| 01/10/2017 | 2.6 |
| 01/10/2017 | 2.9 |
| 01/10/2017 | 3 |
| 01/10/2017 | 3.1 |
| 01/10/2017 | 3.4 |
| 01/10/2017 | 3.3 |
| 01/10/2017 | 3.3 |
| 01/10/2017 | 3.3 |
| 01/10/2017 | 3 |
| 01/10/2017 | 3 |
| 01/10/2017 | 3.3 |
| 01/10/2017 | 3.7 |
| 01/10/2017 | 3.7 |
| 01/10/2017 | 3.5 |
| 01/10/2017 | 3.2 |
| 01/10/2017 | 3.2 |
| 01/10/2017 | 2.6 |
| 01/10/2017 | 2.7 |
| 02/10/2017 | 2.2 |
| 02/10/2017 | 2.3 |
| 02/10/2017 | 2.1 |
| 02/10/2017 | 2.5 |
| 02/10/2017 | 2.6 |
| 02/10/2017 | 2.8 |
| 02/10/2017 | 2.9 |
| 02/10/2017 | 3.4 |
| 02/10/2017 | 3.6 |
| 02/10/2017 | 4.2 |
| 02/10/2017 | 3.9 |
| 02/10/2017 | 3.9 |
| 02/10/2017 | 3.9 |
| 02/10/2017 | 3.7 |
| 02/10/2017 | 3.8 |
| 02/10/2017 | 3.5 |
| 02/10/2017 | 3.9 |
| 02/10/2017 | 4.1 |
| 02/10/2017 | 4.5 |
| 02/10/2017 | 3.9 |
| 02/10/2017 | 3.7 |
| 02/10/2017 | 3.2 |
| 02/10/2017 | 2.7 |
| 02/10/2017 | 2.6 |
| 03/10/2017 | 2.2 |
| 03/10/2017 | 2.2 |
| 03/10/2017 | 2.5 |
| 03/10/2017 | 2.5 |
| 03/10/2017 | 2.3 |
| 03/10/2017 | 2.4 |
| 03/10/2017 | 2.8 |
| 03/10/2017 | 2.8 |
| 03/10/2017 | 3.3 |
| 03/10/2017 | 3.3 |
| 03/10/2017 | 3.4 |
| 03/10/2017 | 3.6 |
| 03/10/2017 | 3.5 |
| 03/10/2017 | 3.4 |
| 03/10/2017 | 3.1 |
| 03/10/2017 | 3 |
| 03/10/2017 | 3.4 |
| 03/10/2017 | 3.4 |
| 03/10/2017 | 3.9 |
| 03/10/2017 | 3.4 |
| 03/10/2017 | 3.1 |
| 03/10/2017 | 3.1 |
| 03/10/2017 | 2.8 |
| 03/10/2017 | 2.6 |
| 04/10/2017 | 2.5 |
| 04/10/2017 | 2.5 |
| 04/10/2017 | 2.5 |
| 04/10/2017 | 2.6 |
| 04/10/2017 | 2.8 |
| 04/10/2017 | 3.5 |
| 04/10/2017 | 4.2 |
| 04/10/2017 | 4.2 |
| 04/10/2017 | 4.7 |
| 04/10/2017 | 4.9 |
| 04/10/2017 | 4.6 |
| 04/10/2017 | 4.6 |
| 04/10/2017 | 4.7 |
| 04/10/2017 | 4.7 |
| 04/10/2017 | 4.3 |
| 04/10/2017 | 4.6 |
| 04/10/2017 | 4.7 |
| 04/10/2017 | 5 |
| 04/10/2017 | 4.7 |
| 04/10/2017 | 4.2 |
| 04/10/2017 | 3.9 |
| 04/10/2017 | 3.5 |
| 04/10/2017 | 2.8 |
| 04/10/2017 | 2.6 |
| 05/10/2017 | 2.5 |
| 05/10/2017 | 2.5 |
| 05/10/2017 | 2.5 |
| 05/10/2017 | 2.6 |
| 05/10/2017 | 2.8 |
| 05/10/2017 | 3.4 |
| 05/10/2017 | 4.1 |
| 05/10/2017 | 4.5 |
| 05/10/2017 | 4.5 |
| 05/10/2017 | 4.7 |
| 05/10/2017 | 4.9 |
| 05/10/2017 | 4.9 |
| 05/10/2017 | 4.5 |
| 05/10/2017 | 4.5 |
| 05/10/2017 | 4.6 |
| 05/10/2017 | 4.4 |
| 05/10/2017 | 4.5 |
| 05/10/2017 | 4.9 |
| 05/10/2017 | 5 |
| 05/10/2017 | 4.6 |
| 05/10/2017 | 3.8 |
| 05/10/2017 | 3.4 |
| 05/10/2017 | 2.8 |
| 05/10/2017 | 2.6 |
| 06/10/2017 | 2.5 |
| 06/10/2017 | 2.5 |
| 06/10/2017 | 2.5 |
| 06/10/2017 | 2.6 |
| 06/10/2017 | 2.7 |
| 06/10/2017 | 3.3 |
| 06/10/2017 | 3.9 |
| 06/10/2017 | 4.5 |
| 06/10/2017 | 4.6 |
| 06/10/2017 | 4.8 |
| 06/10/2017 | 4.9 |
| 06/10/2017 | 4.8 |
| 06/10/2017 | 4.7 |
| 06/10/2017 | 4.5 |
| 06/10/2017 | 4.5 |
| 06/10/2017 | 4.3 |
| 06/10/2017 | 4.3 |
| 06/10/2017 | 4.6 |
| 06/10/2017 | 4.4 |
| 06/10/2017 | 4 |
| 06/10/2017 | 3.8 |
| 06/10/2017 | 3.4 |
| 06/10/2017 | 3.1 |
| 06/10/2017 | 2.4 |
| 07/10/2017 | 2.4 |
| 07/10/2017 | 2.4 |
| 07/10/2017 | 2.2 |
| 07/10/2017 | 2.3 |
| 07/10/2017 | 2.2 |
| 07/10/2017 | 2.7 |
| 07/10/2017 | 3 |
| 07/10/2017 | 3 |
| 07/10/2017 | 3.4 |
| 07/10/2017 | 3.7 |
| 07/10/2017 | 3.7 |
| 07/10/2017 | 3.6 |
| 07/10/2017 | 3.9 |
| 07/10/2017 | 3.7 |
| 07/10/2017 | 3.4 |
| 07/10/2017 | 3.3 |
| 07/10/2017 | 3.6 |
| 07/10/2017 | 4.1 |
| 07/10/2017 | 4 |
| 07/10/2017 | 3.9 |
| 07/10/2017 | 3.5 |
| 07/10/2017 | 3.1 |
| 07/10/2017 | 2.7 |
| 07/10/2017 | 2.3 |
| 08/10/2017 | 2.4 |
| 08/10/2017 | 2.5 |
| 08/10/2017 | 2.3 |
| 08/10/2017 | 2.3 |
| 08/10/2017 | 2.5 |
| 08/10/2017 | 2.5 |
| 08/10/2017 | 2.3 |
| 08/10/2017 | 2.6 |
| 08/10/2017 | 3.1 |
| 08/10/2017 | 3.2 |
| 08/10/2017 | 3.5 |
| 08/10/2017 | 3.4 |
| 08/10/2017 | 3.4 |
| 08/10/2017 | 3.3 |
| 08/10/2017 | 3 |
| 08/10/2017 | 3.1 |
| 08/10/2017 | 3.6 |
| 08/10/2017 | 3.9 |
| 08/10/2017 | 3.6 |
| 08/10/2017 | 3.5 |
| 08/10/2017 | 3.2 |
| 08/10/2017 | 3.3 |
| 08/10/2017 | 2.7 |
| 08/10/2017 | 2.3 |
| 09/10/2017 | 2.4 |
| 09/10/2017 | 2.5 |
| 09/10/2017 | 2.5 |
| 09/10/2017 | 2.2 |
| 09/10/2017 | 2.9 |
| 09/10/2017 | 3.2 |
| 09/10/2017 | 3.9 |
| 09/10/2017 | 4.3 |
| 09/10/2017 | 4.3 |
| 09/10/2017 | 4.5 |
| 09/10/2017 | 4.6 |
| 09/10/2017 | 4.7 |
| 09/10/2017 | 4.4 |
| 09/10/2017 | 4.4 |
| 09/10/2017 | 4.6 |
| 09/10/2017 | 4.4 |
| 09/10/2017 | 4.6 |
| 09/10/2017 | 4.7 |
| 09/10/2017 | 4.7 |
| 09/10/2017 | 4.5 |
| 09/10/2017 | 3.7 |
| 09/10/2017 | 3.4 |
| 09/10/2017 | 3.2 |
| 09/10/2017 | 2.5 |
| 10/10/2017 | 2.4 |
| 10/10/2017 | 2.5 |
| 10/10/2017 | 2.4 |
| 10/10/2017 | 2.6 |
| 10/10/2017 | 2.8 |
| 10/10/2017 | 3.5 |
| 10/10/2017 | 4.2 |
| 10/10/2017 | 4.2 |
| 10/10/2017 | 4.6 |
| 10/10/2017 | 4.8 |
| 10/10/2017 | 4.9 |
| 10/10/2017 | 4.4 |
| 10/10/2017 | 4.5 |
| 10/10/2017 | 4.5 |
| 10/10/2017 | 4.7 |
| 10/10/2017 | 4.2 |
| 10/10/2017 | 4.6 |
| 10/10/2017 | 4.7 |
| 10/10/2017 | 5.1 |
| 10/10/2017 | 4.3 |
| 10/10/2017 | 3.9 |
| 10/10/2017 | 3.5 |
| 10/10/2017 | 2.8 |
| 10/10/2017 | 2.6 |
| 11/10/2017 | 2.6 |
| 11/10/2017 | 2.6 |
| 11/10/2017 | 2.5 |
| 11/10/2017 | 2.7 |
| 11/10/2017 | 2.9 |
| 11/10/2017 | 3.7 |
| 11/10/2017 | 4 |
| 11/10/2017 | 4.4 |
| 11/10/2017 | 4.4 |
| 11/10/2017 | 4.5 |
| 11/10/2017 | 4.7 |
| 11/10/2017 | 4.7 |
| 11/10/2017 | 4.8 |
| 11/10/2017 | 4.8 |
| 11/10/2017 | 4.4 |
| 11/10/2017 | 4.3 |
| 11/10/2017 | 4.6 |
| 11/10/2017 | 4.7 |
| 11/10/2017 | 5.2 |
| 11/10/2017 | 4.3 |
| 11/10/2017 | 3.9 |
| 11/10/2017 | 3.6 |
| 11/10/2017 | 2.9 |
| 11/10/2017 | 2.6 |
| 12/10/2017 | 2.6 |
| 12/10/2017 | 2.6 |
| 12/10/2017 | 2.5 |
| 12/10/2017 | 2.7 |
| 12/10/2017 | 2.9 |
| 12/10/2017 | 3.6 |
| 12/10/2017 | 3.9 |
| 12/10/2017 | 4.3 |
| 12/10/2017 | 4.7 |
| 12/10/2017 | 4.9 |
| 12/10/2017 | 4.5 |
| 12/10/2017 | 4.5 |
| 12/10/2017 | 4.6 |
| 12/10/2017 | 4.5 |
| 12/10/2017 | 4.6 |
| 12/10/2017 | 4.5 |
| 12/10/2017 | 4.4 |
| 12/10/2017 | 5.1 |
| 12/10/2017 | 5 |
| 12/10/2017 | 4.6 |
| 12/10/2017 | 3.8 |
| 12/10/2017 | 3.5 |
| 12/10/2017 | 2.9 |
| 12/10/2017 | 2.6 |
| 13/10/2017 | 2.6 |
| 13/10/2017 | 2.6 |
| 13/10/2017 | 2.5 |
| 13/10/2017 | 2.7 |
| 13/10/2017 | 2.8 |
| 13/10/2017 | 3.5 |
| 13/10/2017 | 4.2 |
| 13/10/2017 | 4.3 |
| 13/10/2017 | 4.8 |
| 13/10/2017 | 4.5 |
| 13/10/2017 | 4.5 |
| 13/10/2017 | 4.4 |
| 13/10/2017 | 4.8 |
| 13/10/2017 | 4.6 |
| 13/10/2017 | 4.6 |
| 13/10/2017 | 4.5 |
| 13/10/2017 | 4.2 |
| 13/10/2017 | 4.8 |
| 13/10/2017 | 4.9 |
| 13/10/2017 | 4.1 |
| 13/10/2017 | 3.9 |
| 13/10/2017 | 3.4 |
| 13/10/2017 | 3.2 |
| 13/10/2017 | 2.4 |
| 14/10/2017 | 2.5 |
| 14/10/2017 | 2.5 |
| 14/10/2017 | 2.3 |
| 14/10/2017 | 2.3 |
| 14/10/2017 | 2.3 |
| 14/10/2017 | 2.4 |
| 14/10/2017 | 2.8 |
| 14/10/2017 | 3.2 |
| 14/10/2017 | 3.5 |
| 14/10/2017 | 3.9 |
| 14/10/2017 | 3.8 |
| 14/10/2017 | 3.7 |
| 14/10/2017 | 3.5 |
| 14/10/2017 | 3.8 |
| 14/10/2017 | 3.5 |
| 14/10/2017 | 3.5 |
| 14/10/2017 | 3.9 |
| 14/10/2017 | 3.8 |
| 14/10/2017 | 3.9 |
| 14/10/2017 | 3.9 |
| 14/10/2017 | 3.5 |
| 14/10/2017 | 3.1 |
| 14/10/2017 | 2.7 |
| 14/10/2017 | 2.3 |
| 15/10/2017 | 2.5 |
| 15/10/2017 | 2 |
| 15/10/2017 | 2.3 |
| 15/10/2017 | 2.3 |
| 15/10/2017 | 2.5 |
| 15/10/2017 | 2.6 |
| 15/10/2017 | 2.5 |
| 15/10/2017 | 2.8 |
| 15/10/2017 | 3.2 |
| 15/10/2017 | 3.3 |
| 15/10/2017 | 3.1 |
| 15/10/2017 | 3.5 |
| 15/10/2017 | 3.5 |
| 15/10/2017 | 3.3 |
| 15/10/2017 | 3.1 |
| 15/10/2017 | 3.3 |
| 15/10/2017 | 3.4 |
| 15/10/2017 | 4 |
| 15/10/2017 | 4 |
| 15/10/2017 | 3.6 |
| 15/10/2017 | 3.3 |
| 15/10/2017 | 2.8 |
| 15/10/2017 | 2.8 |
| 15/10/2017 | 2.4 |
| 16/10/2017 | 2.4 |
| 16/10/2017 | 2.5 |
| 16/10/2017 | 2.5 |
| 16/10/2017 | 2.6 |
| 16/10/2017 | 2.7 |
| 16/10/2017 | 3.5 |
| 16/10/2017 | 4 |
| 16/10/2017 | 4.1 |
| 16/10/2017 | 4.3 |
| 16/10/2017 | 4.7 |
| 16/10/2017 | 4.4 |
| 16/10/2017 | 4.4 |
| 16/10/2017 | 4.4 |
| 16/10/2017 | 4.3 |
| 16/10/2017 | 4.4 |
| 16/10/2017 | 4.4 |
| 16/10/2017 | 4.4 |
| 16/10/2017 | 4.8 |
| 16/10/2017 | 5 |
| 16/10/2017 | 4.4 |
| 16/10/2017 | 3.7 |
| 16/10/2017 | 3.2 |
| 16/10/2017 | 3.2 |
| 16/10/2017 | 2.5 |
| 17/10/2017 | 2.5 |
| 17/10/2017 | 2.5 |
| 17/10/2017 | 2.5 |
| 17/10/2017 | 2.6 |
| 17/10/2017 | 2.6 |
| 17/10/2017 | 3.3 |
| 17/10/2017 | 3.9 |
| 17/10/2017 | 4.5 |
| 17/10/2017 | 4.7 |
| 17/10/2017 | 4.5 |
| 17/10/2017 | 4.6 |
| 17/10/2017 | 4.6 |
| 17/10/2017 | 4.5 |
| 17/10/2017 | 4.4 |
| 17/10/2017 | 4.5 |
| 17/10/2017 | 4.2 |
| 17/10/2017 | 4.3 |
| 17/10/2017 | 4.7 |
| 17/10/2017 | 4.8 |
| 17/10/2017 | 4.1 |
| 17/10/2017 | 3.9 |
| 17/10/2017 | 3.3 |
| 17/10/2017 | 2.8 |
| 17/10/2017 | 2.7 |
| 18/10/2017 | 2.6 |
| 18/10/2017 | 2.6 |
| 18/10/2017 | 2.5 |
| 18/10/2017 | 2.7 |
| 18/10/2017 | 2.7 |
| 18/10/2017 | 3.5 |
| 18/10/2017 | 4.1 |
| 18/10/2017 | 4.2 |
| 18/10/2017 | 4.4 |
| 18/10/2017 | 4.7 |
| 18/10/2017 | 4.9 |
| 18/10/2017 | 4.9 |
| 18/10/2017 | 4.8 |
| 18/10/2017 | 4.6 |
| 18/10/2017 | 4.2 |
| 18/10/2017 | 4.2 |
| 18/10/2017 | 4.3 |
| 18/10/2017 | 4.8 |
| 18/10/2017 | 4.9 |
| 18/10/2017 | 4.1 |
| 18/10/2017 | 3.9 |
| 18/10/2017 | 3.4 |
| 18/10/2017 | 2.9 |
| 18/10/2017 | 2.7 |
| 19/10/2017 | 2.6 |
| 19/10/2017 | 2.6 |
| 19/10/2017 | 2.5 |
| 19/10/2017 | 2.6 |
| 19/10/2017 | 2.6 |
| 19/10/2017 | 3.4 |
| 19/10/2017 | 4.1 |
| 19/10/2017 | 4.1 |
| 19/10/2017 | 4.3 |
| 19/10/2017 | 4.6 |
| 19/10/2017 | 4.8 |
| 19/10/2017 | 4.7 |
| 19/10/2017 | 4.6 |
| 19/10/2017 | 4.4 |
| 19/10/2017 | 4.5 |
| 19/10/2017 | 4.5 |
| 19/10/2017 | 4.6 |
| 19/10/2017 | 4.7 |
| 19/10/2017 | 4.7 |
| 19/10/2017 | 4.4 |
| 19/10/2017 | 3.8 |
| 19/10/2017 | 3.3 |
| 19/10/2017 | 2.8 |
| 19/10/2017 | 2.7 |
| 20/10/2017 | 2.6 |
| 20/10/2017 | 2.6 |
| 20/10/2017 | 2.5 |
| 20/10/2017 | 2.6 |
| 20/10/2017 | 2.6 |
| 20/10/2017 | 3.3 |
| 20/10/2017 | 3.9 |
| 20/10/2017 | 4.1 |
| 20/10/2017 | 4.3 |
| 20/10/2017 | 4.7 |
| 20/10/2017 | 4.7 |
| 20/10/2017 | 4.6 |
| 20/10/2017 | 4.3 |
| 20/10/2017 | 4.4 |
| 20/10/2017 | 4.4 |
| 20/10/2017 | 4.5 |
| 20/10/2017 | 4.5 |
| 20/10/2017 | 4.9 |
| 20/10/2017 | 4.7 |
| 20/10/2017 | 3.9 |
| 20/10/2017 | 3.4 |
| 20/10/2017 | 3.3 |
| 20/10/2017 | 3.1 |
| 20/10/2017 | 2.5 |
| 21/10/2017 | 2.6 |
| 21/10/2017 | 2.5 |
| 21/10/2017 | 2.3 |
| 21/10/2017 | 2.3 |
| 21/10/2017 | 2.6 |
| 21/10/2017 | 2.4 |
| 21/10/2017 | 2.6 |
| 21/10/2017 | 3.2 |
| 21/10/2017 | 3.7 |
| 21/10/2017 | 3.7 |
| 21/10/2017 | 3.6 |
| 21/10/2017 | 4 |
| 21/10/2017 | 3.6 |
| 21/10/2017 | 3.3 |
| 21/10/2017 | 3.5 |
| 21/10/2017 | 3.6 |
| 21/10/2017 | 3.7 |
| 21/10/2017 | 3.8 |
| 21/10/2017 | 4.2 |
| 21/10/2017 | 3.9 |
| 21/10/2017 | 3.1 |
| 21/10/2017 | 3 |
| 21/10/2017 | 2.8 |
| 21/10/2017 | 2.4 |
| 22/10/2017 | 2.6 |
| 22/10/2017 | 2.1 |
| 22/10/2017 | 2.4 |
| 22/10/2017 | 2.3 |
| 22/10/2017 | 2.4 |
| 22/10/2017 | 2.2 |
| 22/10/2017 | 2.4 |
| 22/10/2017 | 2.8 |
| 22/10/2017 | 3 |
| 22/10/2017 | 3.2 |
| 22/10/2017 | 3.6 |
| 22/10/2017 | 3.3 |
| 22/10/2017 | 3.2 |
| 22/10/2017 | 3 |
| 22/10/2017 | 3.3 |
| 22/10/2017 | 3.1 |
| 22/10/2017 | 3.3 |
| 22/10/2017 | 4 |
| 22/10/2017 | 3.8 |
| 22/10/2017 | 3.6 |
| 22/10/2017 | 3.5 |
| 22/10/2017 | 2.8 |
| 22/10/2017 | 2.9 |
| 22/10/2017 | 2.5 |
| 23/10/2017 | 2.6 |
| 23/10/2017 | 2.2 |
| 23/10/2017 | 2.1 |
| 23/10/2017 | 2.2 |
| 23/10/2017 | 2.8 |
| 23/10/2017 | 3.2 |
| 23/10/2017 | 3.9 |
| 23/10/2017 | 4.5 |
| 23/10/2017 | 4.7 |
| 23/10/2017 | 4.5 |
| 23/10/2017 | 4.7 |
| 23/10/2017 | 4.8 |
| 23/10/2017 | 4.7 |
| 23/10/2017 | 4.6 |
| 23/10/2017 | 4.3 |
| 23/10/2017 | 4.4 |
| 23/10/2017 | 4.5 |
| 23/10/2017 | 5 |
| 23/10/2017 | 4.9 |
| 23/10/2017 | 4.2 |
| 23/10/2017 | 4 |
| 23/10/2017 | 3.5 |
| 23/10/2017 | 2.9 |
| 23/10/2017 | 2.8 |
| 24/10/2017 | 2.7 |
| 24/10/2017 | 2.2 |
| 24/10/2017 | 2.6 |
| 24/10/2017 | 2.7 |
| 24/10/2017 | 2.7 |
| 24/10/2017 | 3.6 |
| 24/10/2017 | 3.8 |
| 24/10/2017 | 4.4 |
| 24/10/2017 | 4.6 |
| 24/10/2017 | 4.4 |
| 24/10/2017 | 4.6 |
| 24/10/2017 | 4.6 |
| 24/10/2017 | 4.5 |
| 24/10/2017 | 4.3 |
| 24/10/2017 | 4.6 |
| 24/10/2017 | 4.4 |
| 24/10/2017 | 4.5 |
| 24/10/2017 | 4.8 |
| 24/10/2017 | 4.8 |
| 24/10/2017 | 4.5 |
| 24/10/2017 | 3.7 |
| 24/10/2017 | 3.2 |
| 24/10/2017 | 3.1 |
| 24/10/2017 | 2.9 |
| 25/10/2017 | 2.3 |
| 25/10/2017 | 2.3 |
| 25/10/2017 | 2.2 |
| 25/10/2017 | 2.3 |
| 25/10/2017 | 2.9 |
| 25/10/2017 | 3.3 |
| 25/10/2017 | 4 |
| 25/10/2017 | 4.2 |
| 25/10/2017 | 4.4 |
| 25/10/2017 | 4.8 |
| 25/10/2017 | 5 |
| 25/10/2017 | 5 |
| 25/10/2017 | 4.9 |
| 25/10/2017 | 4.7 |
| 25/10/2017 | 4.4 |
| 25/10/2017 | 4.6 |
| 25/10/2017 | 4.6 |
| 25/10/2017 | 4.9 |
| 25/10/2017 | 4.9 |
| 25/10/2017 | 4.6 |
| 25/10/2017 | 3.8 |
| 25/10/2017 | 3.3 |
| 25/10/2017 | 3.2 |
| 25/10/2017 | 2.5 |
| 26/10/2017 | 2.4 |
| 26/10/2017 | 2.3 |
| 26/10/2017 | 2.2 |
| 26/10/2017 | 2.3 |
| 26/10/2017 | 2.8 |
| 26/10/2017 | 3.2 |
| 26/10/2017 | 4 |
| 26/10/2017 | 4.6 |
| 26/10/2017 | 4.8 |
| 26/10/2017 | 4.7 |
| 26/10/2017 | 4.9 |
| 26/10/2017 | 4.8 |
| 26/10/2017 | 4.7 |
| 26/10/2017 | 4.5 |
| 26/10/2017 | 4.2 |
| 26/10/2017 | 4.5 |
| 26/10/2017 | 4.9 |
| 26/10/2017 | 5.2 |
| 26/10/2017 | 5.2 |
| 26/10/2017 | 4.5 |
| 26/10/2017 | 3.8 |
| 26/10/2017 | 3.3 |
| 26/10/2017 | 3.2 |
| 26/10/2017 | 2.5 |
| 27/10/2017 | 2.4 |
| 27/10/2017 | 2.4 |
| 27/10/2017 | 2.2 |
| 27/10/2017 | 2.3 |
| 27/10/2017 | 2.8 |
| 27/10/2017 | 3.6 |
| 27/10/2017 | 3.8 |
| 27/10/2017 | 4.6 |
| 27/10/2017 | 4.4 |
| 27/10/2017 | 4.8 |
| 27/10/2017 | 5 |
| 27/10/2017 | 4.8 |
| 27/10/2017 | 4.5 |
| 27/10/2017 | 4.7 |
| 27/10/2017 | 4.3 |
| 27/10/2017 | 4.6 |
| 27/10/2017 | 4.8 |
| 27/10/2017 | 4.9 |
| 27/10/2017 | 4.6 |
| 27/10/2017 | 4 |
| 27/10/2017 | 3.9 |
| 27/10/2017 | 3.3 |
| 27/10/2017 | 3.1 |
| 27/10/2017 | 2.9 |
| 28/10/2017 | 2.4 |
| 28/10/2017 | 2.3 |
| 28/10/2017 | 2.6 |
| 28/10/2017 | 2.6 |
| 28/10/2017 | 2.5 |
| 28/10/2017 | 2.8 |
| 28/10/2017 | 2.9 |
| 28/10/2017 | 3.3 |
| 28/10/2017 | 3.8 |
| 28/10/2017 | 3.7 |
| 28/10/2017 | 4.1 |
| 28/10/2017 | 4 |
| 28/10/2017 | 3.7 |
| 28/10/2017 | 3.6 |
| 28/10/2017 | 3.9 |
| 28/10/2017 | 3.7 |
| 28/10/2017 | 4 |
| 28/10/2017 | 4.4 |
| 28/10/2017 | 4.3 |
| 28/10/2017 | 4.1 |
| 28/10/2017 | 3.6 |
| 28/10/2017 | 3.2 |
| 28/10/2017 | 2.8 |
| 28/10/2017 | 2.5 |
| 29/10/2017 | 2.2 |
| 29/10/2017 | 2.2 |
| 29/10/2017 | 2.2 |
| 29/10/2017 | 2.5 |
| 29/10/2017 | 2 |
| 29/10/2017 | 2.2 |
| 29/10/2017 | 2.3 |
| 29/10/2017 | 2.7 |
| 29/10/2017 | 3.1 |
| 29/10/2017 | 3 |
| 29/10/2017 | 3.5 |
| 29/10/2017 | 3.3 |
| 29/10/2017 | 3.7 |
| 29/10/2017 | 3.3 |
| 29/10/2017 | 3.3 |
| 29/10/2017 | 3.2 |
| 29/10/2017 | 3.3 |
| 29/10/2017 | 4.1 |
| 29/10/2017 | 4.4 |
| 29/10/2017 | 4.2 |
| 29/10/2017 | 3.5 |
| 29/10/2017 | 3.4 |
| 29/10/2017 | 3.1 |
| 29/10/2017 | 2.9 |
| 30/10/2017 | 2.6 |
| 30/10/2017 | 2.2 |
| 30/10/2017 | 2.3 |
| 30/10/2017 | 2.2 |
| 30/10/2017 | 2.5 |
| 30/10/2017 | 2.7 |
| 30/10/2017 | 3.6 |
| 30/10/2017 | 4 |
| 30/10/2017 | 4.5 |
| 30/10/2017 | 4.4 |
| 30/10/2017 | 4.4 |
| 30/10/2017 | 4.6 |
| 30/10/2017 | 4.7 |
| 30/10/2017 | 4.9 |
| 30/10/2017 | 4.7 |
| 30/10/2017 | 4.6 |
| 30/10/2017 | 4.7 |
| 30/10/2017 | 5 |
| 30/10/2017 | 5.3 |
| 30/10/2017 | 5 |
| 30/10/2017 | 4.5 |
| 30/10/2017 | 3.9 |
| 30/10/2017 | 3.2 |
| 30/10/2017 | 2.9 |
| 30/10/2017 | 2.9 |
| 31/10/2017 | 2.3 |
| 31/10/2017 | 2.3 |
| 31/10/2017 | 2.2 |
| 31/10/2017 | 2.4 |
| 31/10/2017 | 2.7 |
| 31/10/2017 | 3.5 |
| 31/10/2017 | 3.9 |
| 31/10/2017 | 4.5 |
| 31/10/2017 | 4.8 |
| 31/10/2017 | 4.8 |
| 31/10/2017 | 5 |
| 31/10/2017 | 5 |
| 31/10/2017 | 4.7 |
| 31/10/2017 | 4.9 |
| 31/10/2017 | 4.9 |
| 31/10/2017 | 4.7 |
| 31/10/2017 | 5.1 |
| 31/10/2017 | 5.2 |
| 31/10/2017 | 5.4 |
| 31/10/2017 | 4.4 |
| 31/10/2017 | 3.7 |
| 31/10/2017 | 3.4 |
| 31/10/2017 | 3.1 |
| 31/10/2017 | 2.6 |
| 01/11/2017 | 2.4 |
| 01/11/2017 | 2.4 |
| 01/11/2017 | 2.4 |
| 01/11/2017 | 2.6 |
| 01/11/2017 | 2.8 |
| 01/11/2017 | 3.6 |
| 01/11/2017 | 4.2 |
| 01/11/2017 | 4.8 |
| 01/11/2017 | 4.7 |
| 01/11/2017 | 4.7 |
| 01/11/2017 | 4.9 |
| 01/11/2017 | 4.9 |
| 01/11/2017 | 4.6 |
| 01/11/2017 | 4.8 |
| 01/11/2017 | 4.7 |
| 01/11/2017 | 4.9 |
| 01/11/2017 | 5.2 |
| 01/11/2017 | 5.3 |
| 01/11/2017 | 5.5 |
| 01/11/2017 | 4.5 |
| 01/11/2017 | 3.8 |
| 01/11/2017 | 3.6 |
| 01/11/2017 | 3.2 |
| 01/11/2017 | 2.6 |
| 02/11/2017 | 2.5 |
| 02/11/2017 | 2.4 |
| 02/11/2017 | 2.4 |
| 02/11/2017 | 2.6 |
| 02/11/2017 | 2.8 |
| 02/11/2017 | 3.6 |
| 02/11/2017 | 4.1 |
| 02/11/2017 | 4.7 |
| 02/11/2017 | 4.5 |
| 02/11/2017 | 4.6 |
| 02/11/2017 | 4.8 |
| 02/11/2017 | 4.7 |
| 02/11/2017 | 4.9 |
| 02/11/2017 | 4.6 |
| 02/11/2017 | 4.6 |
| 02/11/2017 | 4.8 |
| 02/11/2017 | 5.5 |
| 02/11/2017 | 5.6 |
| 02/11/2017 | 5.3 |
| 02/11/2017 | 4.4 |
| 02/11/2017 | 3.7 |
| 02/11/2017 | 3.6 |
| 02/11/2017 | 3.3 |
| 02/11/2017 | 2.7 |
| 03/11/2017 | 2.5 |
| 03/11/2017 | 2.5 |
| 03/11/2017 | 2.4 |
| 03/11/2017 | 2.6 |
| 03/11/2017 | 2.7 |
| 03/11/2017 | 3.4 |
| 03/11/2017 | 4 |
| 03/11/2017 | 4.7 |
| 03/11/2017 | 4.7 |
| 03/11/2017 | 4.7 |
| 03/11/2017 | 4.9 |
| 03/11/2017 | 4.7 |
| 03/11/2017 | 4.7 |
| 03/11/2017 | 4.7 |
| 03/11/2017 | 4.6 |
| 03/11/2017 | 4.8 |
| 03/11/2017 | 5.4 |
| 03/11/2017 | 5.2 |
| 03/11/2017 | 5.2 |
| 03/11/2017 | 4.4 |
| 03/11/2017 | 3.9 |
| 03/11/2017 | 3.6 |
| 03/11/2017 | 3.1 |
| 03/11/2017 | 2.5 |
| 04/11/2017 | 2.5 |
| 04/11/2017 | 2.4 |
| 04/11/2017 | 2.2 |
| 04/11/2017 | 2.2 |
| 04/11/2017 | 2.7 |
| 04/11/2017 | 2.7 |
| 04/11/2017 | 2.8 |
| 04/11/2017 | 3.4 |
| 04/11/2017 | 3.8 |
| 04/11/2017 | 4.1 |
| 04/11/2017 | 4.1 |
| 04/11/2017 | 4 |
| 04/11/2017 | 3.8 |
| 04/11/2017 | 3.9 |
| 04/11/2017 | 3.9 |
| 04/11/2017 | 4 |
| 04/11/2017 | 4.5 |
| 04/11/2017 | 4.3 |
| 04/11/2017 | 4.5 |
| 04/11/2017 | 3.8 |
| 04/11/2017 | 3.5 |
| 04/11/2017 | 3.3 |
| 04/11/2017 | 2.7 |
| 04/11/2017 | 2.4 |
| 05/11/2017 | 2.5 |
| 05/11/2017 | 2.5 |
| 05/11/2017 | 2.2 |
| 05/11/2017 | 2.2 |
| 05/11/2017 | 2.4 |
| 05/11/2017 | 2.5 |
| 05/11/2017 | 2.5 |
| 05/11/2017 | 2.9 |
| 05/11/2017 | 3 |
| 05/11/2017 | 3.5 |
| 05/11/2017 | 3.4 |
| 05/11/2017 | 3.8 |
| 05/11/2017 | 3.3 |
| 05/11/2017 | 3.4 |
| 05/11/2017 | 3.5 |
| 05/11/2017 | 3.7 |
| 05/11/2017 | 3.9 |
| 05/11/2017 | 4.3 |
| 05/11/2017 | 4.1 |
| 05/11/2017 | 3.5 |
| 05/11/2017 | 3.3 |
| 05/11/2017 | 3 |
| 05/11/2017 | 2.8 |
| 05/11/2017 | 2.5 |
| 06/11/2017 | 2.5 |
| 06/11/2017 | 2.5 |
| 06/11/2017 | 2.5 |
| 06/11/2017 | 2.7 |
| 06/11/2017 | 3 |
| 06/11/2017 | 3.4 |
| 06/11/2017 | 4 |
| 06/11/2017 | 4.5 |
| 06/11/2017 | 4.5 |
| 06/11/2017 | 4.6 |
| 06/11/2017 | 4.9 |
| 06/11/2017 | 4.9 |
| 06/11/2017 | 4.7 |
| 06/11/2017 | 5 |
| 06/11/2017 | 4.5 |
| 06/11/2017 | 4.9 |
| 06/11/2017 | 5.5 |
| 06/11/2017 | 5.4 |
| 06/11/2017 | 5 |
| 06/11/2017 | 4.7 |
| 06/11/2017 | 4 |
| 06/11/2017 | 3.3 |
| 06/11/2017 | 2.9 |
| 06/11/2017 | 2.7 |
| 07/11/2017 | 2.6 |
| 07/11/2017 | 2.5 |
| 07/11/2017 | 2.5 |
| 07/11/2017 | 2.7 |
| 07/11/2017 | 2.9 |
| 07/11/2017 | 3.8 |
| 07/11/2017 | 4.4 |
| 07/11/2017 | 4.5 |
| 07/11/2017 | 4.9 |
| 07/11/2017 | 5 |
| 07/11/2017 | 4.7 |
| 07/11/2017 | 4.7 |
| 07/11/2017 | 4.9 |
| 07/11/2017 | 4.7 |
| 07/11/2017 | 4.8 |
| 07/11/2017 | 5 |
| 07/11/2017 | 5.5 |
| 07/11/2017 | 5.8 |
| 07/11/2017 | 5.3 |
| 07/11/2017 | 4.5 |
| 07/11/2017 | 4.2 |
| 07/11/2017 | 3.5 |
| 07/11/2017 | 3.1 |
| 07/11/2017 | 2.9 |
| 08/11/2017 | 2.7 |
| 08/11/2017 | 2.7 |
| 08/11/2017 | 2.6 |
| 08/11/2017 | 2.8 |
| 08/11/2017 | 3 |
| 08/11/2017 | 3.5 |
| 08/11/2017 | 4.2 |
| 08/11/2017 | 4.8 |
| 08/11/2017 | 4.8 |
| 08/11/2017 | 4.9 |
| 08/11/2017 | 5.1 |
| 08/11/2017 | 5.1 |
| 08/11/2017 | 4.8 |
| 08/11/2017 | 5.1 |
| 08/11/2017 | 4.6 |
| 08/11/2017 | 5.2 |
| 08/11/2017 | 5.6 |
| 08/11/2017 | 5.3 |
| 08/11/2017 | 5.4 |
| 08/11/2017 | 4.6 |
| 08/11/2017 | 3.8 |
| 08/11/2017 | 3.6 |
| 08/11/2017 | 3.2 |
| 08/11/2017 | 3 |
| 09/11/2017 | 2.8 |
| 09/11/2017 | 2.7 |
| 09/11/2017 | 2.6 |
| 09/11/2017 | 2.8 |
| 09/11/2017 | 3 |
| 09/11/2017 | 3.4 |
| 09/11/2017 | 4.1 |
| 09/11/2017 | 4.7 |
| 09/11/2017 | 4.7 |
| 09/11/2017 | 4.8 |
| 09/11/2017 | 5 |
| 09/11/2017 | 5 |
| 09/11/2017 | 4.7 |
| 09/11/2017 | 4.9 |
| 09/11/2017 | 5 |
| 09/11/2017 | 5.1 |
| 09/11/2017 | 5.4 |
| 09/11/2017 | 5.7 |
| 09/11/2017 | 5.2 |
| 09/11/2017 | 4.5 |
| 09/11/2017 | 3.8 |
| 09/11/2017 | 3.6 |
| 09/11/2017 | 3.2 |
| 09/11/2017 | 3 |
| 10/11/2017 | 2.8 |
| 10/11/2017 | 2.7 |
| 10/11/2017 | 2.6 |
| 10/11/2017 | 2.8 |
| 10/11/2017 | 3 |
| 10/11/2017 | 3.8 |
| 10/11/2017 | 4.5 |
| 10/11/2017 | 4.7 |
| 10/11/2017 | 4.8 |
| 10/11/2017 | 4.9 |
| 10/11/2017 | 5.1 |
| 10/11/2017 | 5 |
| 10/11/2017 | 4.9 |
| 10/11/2017 | 5 |
| 10/11/2017 | 4.5 |
| 10/11/2017 | 5.1 |
| 10/11/2017 | 5.3 |
| 10/11/2017 | 5.3 |
| 10/11/2017 | 5.1 |
| 10/11/2017 | 4.5 |
| 10/11/2017 | 3.9 |
| 10/11/2017 | 3.6 |
| 10/11/2017 | 3.1 |
| 10/11/2017 | 2.8 |
| 11/11/2017 | 2.8 |
| 11/11/2017 | 2.7 |
| 11/11/2017 | 2.4 |
| 11/11/2017 | 2.4 |
| 11/11/2017 | 2.4 |
| 11/11/2017 | 2.5 |
| 11/11/2017 | 3.2 |
| 11/11/2017 | 3.3 |
| 11/11/2017 | 3.8 |
| 11/11/2017 | 4.2 |
| 11/11/2017 | 4.2 |
| 11/11/2017 | 4.1 |
| 11/11/2017 | 4 |
| 11/11/2017 | 4 |
| 11/11/2017 | 3.7 |
| 11/11/2017 | 4.1 |
| 11/11/2017 | 4.3 |
| 11/11/2017 | 4.8 |
| 11/11/2017 | 4.4 |
| 11/11/2017 | 3.9 |
| 11/11/2017 | 3.5 |
| 11/11/2017 | 3.3 |
| 11/11/2017 | 3.2 |
| 11/11/2017 | 2.7 |
| 12/11/2017 | 2.2 |
| 12/11/2017 | 2.2 |
| 12/11/2017 | 2.5 |
| 12/11/2017 | 2.4 |
| 12/11/2017 | 2.6 |
| 12/11/2017 | 2.7 |
| 12/11/2017 | 2.8 |
| 12/11/2017 | 2.8 |
| 12/11/2017 | 3.4 |
| 12/11/2017 | 3.5 |
| 12/11/2017 | 3.5 |
| 12/11/2017 | 3.9 |
| 12/11/2017 | 3.4 |
| 12/11/2017 | 3.5 |
| 12/11/2017 | 3.7 |
| 12/11/2017 | 3.8 |
| 12/11/2017 | 4.1 |
| 12/11/2017 | 4.3 |
| 12/11/2017 | 3.9 |
| 12/11/2017 | 3.5 |
| 12/11/2017 | 3.3 |
| 12/11/2017 | 3 |
| 12/11/2017 | 2.8 |
| 12/11/2017 | 2.8 |
| 13/11/2017 | 2.3 |
| 13/11/2017 | 2.3 |
| 13/11/2017 | 2.2 |
| 13/11/2017 | 2.4 |
| 13/11/2017 | 2.7 |
| 13/11/2017 | 3.7 |
| 13/11/2017 | 4.4 |
| 13/11/2017 | 4.6 |
| 13/11/2017 | 4.6 |
| 13/11/2017 | 4.8 |
| 13/11/2017 | 5.1 |
| 13/11/2017 | 5.2 |
| 13/11/2017 | 4.9 |
| 13/11/2017 | 4.8 |
| 13/11/2017 | 5 |
| 13/11/2017 | 5.2 |
| 13/11/2017 | 5.4 |
| 13/11/2017 | 5.4 |
| 13/11/2017 | 5.4 |
| 13/11/2017 | 4.8 |
| 13/11/2017 | 4 |
| 13/11/2017 | 3.8 |
| 13/11/2017 | 3.3 |
| 13/11/2017 | 2.6 |
| 14/11/2017 | 2.4 |
| 14/11/2017 | 2.3 |
| 14/11/2017 | 2.7 |
| 14/11/2017 | 2.4 |
| 14/11/2017 | 3.1 |
| 14/11/2017 | 3.6 |
| 14/11/2017 | 4.4 |
| 14/11/2017 | 4.5 |
| 14/11/2017 | 5.1 |
| 14/11/2017 | 5.2 |
| 14/11/2017 | 5 |
| 14/11/2017 | 5 |
| 14/11/2017 | 5.2 |
| 14/11/2017 | 5 |
| 14/11/2017 | 4.8 |
| 14/11/2017 | 5.3 |
| 14/11/2017 | 5.5 |
| 14/11/2017 | 5.8 |
| 14/11/2017 | 5.3 |
| 14/11/2017 | 4.7 |
| 14/11/2017 | 4.3 |
| 14/11/2017 | 3.5 |
| 14/11/2017 | 3 |
| 14/11/2017 | 2.8 |
| 15/11/2017 | 2.5 |
| 15/11/2017 | 2.5 |
| 15/11/2017 | 2.3 |
| 15/11/2017 | 2.5 |
| 15/11/2017 | 2.8 |
| 15/11/2017 | 3.8 |
| 15/11/2017 | 4.2 |
| 15/11/2017 | 4.8 |
| 15/11/2017 | 4.9 |
| 15/11/2017 | 5.1 |
| 15/11/2017 | 4.9 |
| 15/11/2017 | 4.9 |
| 15/11/2017 | 5.1 |
| 15/11/2017 | 4.9 |
| 15/11/2017 | 5.1 |
| 15/11/2017 | 5.5 |
| 15/11/2017 | 5.6 |
| 15/11/2017 | 5.9 |
| 15/11/2017 | 5.4 |
| 15/11/2017 | 4.8 |
| 15/11/2017 | 4.3 |
| 15/11/2017 | 3.7 |
| 15/11/2017 | 3.2 |
| 15/11/2017 | 2.9 |
| 16/11/2017 | 2.6 |
| 16/11/2017 | 2.5 |
| 16/11/2017 | 2.3 |
| 16/11/2017 | 2.5 |
| 16/11/2017 | 2.8 |
| 16/11/2017 | 3.7 |
| 16/11/2017 | 4.1 |
| 16/11/2017 | 4.7 |
| 16/11/2017 | 4.8 |
| 16/11/2017 | 5 |
| 16/11/2017 | 5.3 |
| 16/11/2017 | 5.3 |
| 16/11/2017 | 4.9 |
| 16/11/2017 | 5.2 |
| 16/11/2017 | 5 |
| 16/11/2017 | 5.4 |
| 16/11/2017 | 5.4 |
| 16/11/2017 | 5.7 |
| 16/11/2017 | 5.2 |
| 16/11/2017 | 4.6 |
| 16/11/2017 | 4.3 |
| 16/11/2017 | 3.7 |
| 16/11/2017 | 3.2 |
| 16/11/2017 | 2.9 |
| 17/11/2017 | 2.6 |
| 17/11/2017 | 2.5 |
| 17/11/2017 | 2.4 |
| 17/11/2017 | 2.5 |
| 17/11/2017 | 2.7 |
| 17/11/2017 | 3.6 |
| 17/11/2017 | 4.5 |
| 17/11/2017 | 4.7 |
| 17/11/2017 | 4.9 |
| 17/11/2017 | 5.1 |
| 17/11/2017 | 4.9 |
| 17/11/2017 | 5.3 |
| 17/11/2017 | 5.2 |
| 17/11/2017 | 4.8 |
| 17/11/2017 | 5 |
| 17/11/2017 | 5.4 |
| 17/11/2017 | 5.7 |
| 17/11/2017 | 5.3 |
| 17/11/2017 | 5 |
| 17/11/2017 | 4.6 |
| 17/11/2017 | 3.9 |
| 17/11/2017 | 3.6 |
| 17/11/2017 | 3 |
| 17/11/2017 | 2.7 |
| 18/11/2017 | 2.6 |
| 18/11/2017 | 2.4 |
| 18/11/2017 | 2.6 |
| 18/11/2017 | 2.6 |
| 18/11/2017 | 2.6 |
| 18/11/2017 | 2.7 |
| 18/11/2017 | 3 |
| 18/11/2017 | 3.2 |
| 18/11/2017 | 3.8 |
| 18/11/2017 | 4.3 |
| 18/11/2017 | 4.4 |
| 18/11/2017 | 4.3 |
| 18/11/2017 | 4.1 |
| 18/11/2017 | 4.2 |
| 18/11/2017 | 4 |
| 18/11/2017 | 4.2 |
| 18/11/2017 | 4.7 |
| 18/11/2017 | 4.8 |
| 18/11/2017 | 4.3 |
| 18/11/2017 | 3.9 |
| 18/11/2017 | 3.5 |
| 18/11/2017 | 3.3 |
| 18/11/2017 | 3.1 |
| 18/11/2017 | 2.6 |
| 19/11/2017 | 2.5 |
| 19/11/2017 | 2.5 |
| 19/11/2017 | 2.2 |
| 19/11/2017 | 2.6 |
| 19/11/2017 | 2.3 |
| 19/11/2017 | 2.4 |
| 19/11/2017 | 2.6 |
| 19/11/2017 | 3.1 |
| 19/11/2017 | 3.4 |
| 19/11/2017 | 3.6 |
| 19/11/2017 | 3.6 |
| 19/11/2017 | 4 |
| 19/11/2017 | 3.5 |
| 19/11/2017 | 3.7 |
| 19/11/2017 | 3.5 |
| 19/11/2017 | 3.8 |
| 19/11/2017 | 4.4 |
| 19/11/2017 | 4.3 |
| 19/11/2017 | 4.3 |
| 19/11/2017 | 4.1 |
| 19/11/2017 | 3.8 |
| 19/11/2017 | 3.5 |
| 19/11/2017 | 3.2 |
| 19/11/2017 | 2.7 |
| 20/11/2017 | 2.5 |
| 20/11/2017 | 2.5 |
| 20/11/2017 | 2.4 |
| 20/11/2017 | 2.6 |
| 20/11/2017 | 2.9 |
| 20/11/2017 | 3.5 |
| 20/11/2017 | 4.4 |
| 20/11/2017 | 4.6 |
| 20/11/2017 | 4.8 |
| 20/11/2017 | 5 |
| 20/11/2017 | 4.9 |
| 20/11/2017 | 5 |
| 20/11/2017 | 5.2 |
| 20/11/2017 | 5.1 |
| 20/11/2017 | 5 |
| 20/11/2017 | 5.5 |
| 20/11/2017 | 5.9 |
| 20/11/2017 | 5.5 |
| 20/11/2017 | 5.4 |
| 20/11/2017 | 5 |
| 20/11/2017 | 4.1 |
| 20/11/2017 | 3.9 |
| 20/11/2017 | 3.3 |
| 20/11/2017 | 3 |
| 21/11/2017 | 2.7 |
| 21/11/2017 | 2.6 |
| 21/11/2017 | 2.4 |
| 21/11/2017 | 2.6 |
| 21/11/2017 | 2.9 |
| 21/11/2017 | 3.9 |
| 21/11/2017 | 4.4 |
| 21/11/2017 | 4.6 |
| 21/11/2017 | 5.2 |
| 21/11/2017 | 4.9 |
| 21/11/2017 | 5.3 |
| 21/11/2017 | 5.3 |
| 21/11/2017 | 5 |
| 21/11/2017 | 5.3 |
| 21/11/2017 | 5.3 |
| 21/11/2017 | 5.6 |
| 21/11/2017 | 6 |
| 21/11/2017 | 5.9 |
| 21/11/2017 | 5.2 |
| 21/11/2017 | 4.8 |
| 21/11/2017 | 4.4 |
| 21/11/2017 | 3.6 |
| 21/11/2017 | 3 |
| 21/11/2017 | 2.7 |
| 22/11/2017 | 2.8 |
| 22/11/2017 | 2.7 |
| 22/11/2017 | 2.6 |
| 22/11/2017 | 2.7 |
| 22/11/2017 | 3 |
| 22/11/2017 | 3.6 |
| 22/11/2017 | 4.7 |
| 22/11/2017 | 4.9 |
| 22/11/2017 | 5.1 |
| 22/11/2017 | 5.3 |
| 22/11/2017 | 5.2 |
| 22/11/2017 | 5.2 |
| 22/11/2017 | 5.4 |
| 22/11/2017 | 5.2 |
| 22/11/2017 | 5.1 |
| 22/11/2017 | 5.8 |
| 22/11/2017 | 6.1 |
| 22/11/2017 | 6 |
| 22/11/2017 | 5.3 |
| 22/11/2017 | 4.9 |
| 22/11/2017 | 4.4 |
| 22/11/2017 | 3.7 |
| 22/11/2017 | 3.1 |
| 22/11/2017 | 2.7 |
| 23/11/2017 | 2.9 |
| 23/11/2017 | 2.8 |
| 23/11/2017 | 2.6 |
| 23/11/2017 | 2.7 |
| 23/11/2017 | 3 |
| 23/11/2017 | 3.6 |
| 23/11/2017 | 4.6 |
| 23/11/2017 | 4.8 |
| 23/11/2017 | 4.9 |
| 23/11/2017 | 5.2 |
| 23/11/2017 | 5.1 |
| 23/11/2017 | 5.1 |
| 23/11/2017 | 5.2 |
| 23/11/2017 | 5.1 |
| 23/11/2017 | 5 |
| 23/11/2017 | 5.7 |
| 23/11/2017 | 5.9 |
| 23/11/2017 | 5.8 |
| 23/11/2017 | 5.6 |
| 23/11/2017 | 4.8 |
| 23/11/2017 | 4.4 |
| 23/11/2017 | 3.7 |
| 23/11/2017 | 3.2 |
| 23/11/2017 | 2.8 |
| 24/11/2017 | 2.9 |
| 24/11/2017 | 2.8 |
| 24/11/2017 | 2.6 |
| 24/11/2017 | 2.7 |
| 24/11/2017 | 3 |
| 24/11/2017 | 3.9 |
| 24/11/2017 | 4.5 |
| 24/11/2017 | 4.8 |
| 24/11/2017 | 5 |
| 24/11/2017 | 5.4 |
| 24/11/2017 | 5.2 |
| 24/11/2017 | 5.1 |
| 24/11/2017 | 5 |
| 24/11/2017 | 5.2 |
| 24/11/2017 | 5 |
| 24/11/2017 | 5.7 |
| 24/11/2017 | 5.7 |
| 24/11/2017 | 5.4 |
| 24/11/2017 | 5 |
| 24/11/2017 | 4.8 |
| 24/11/2017 | 3.9 |
| 24/11/2017 | 3.7 |
| 24/11/2017 | 3 |
| 24/11/2017 | 3.1 |
| 25/11/2017 | 2.9 |
| 25/11/2017 | 2.7 |
| 25/11/2017 | 2.4 |
| 25/11/2017 | 2.3 |
| 25/11/2017 | 2.8 |
| 25/11/2017 | 3 |
| 25/11/2017 | 2.9 |
| 25/11/2017 | 3.7 |
| 25/11/2017 | 3.9 |
| 25/11/2017 | 4.4 |
| 25/11/2017 | 4.6 |
| 25/11/2017 | 4.5 |
| 25/11/2017 | 4.3 |
| 25/11/2017 | 3.9 |
| 25/11/2017 | 4.3 |
| 25/11/2017 | 4.4 |
| 25/11/2017 | 4.5 |
| 25/11/2017 | 4.8 |
| 25/11/2017 | 4.7 |
| 25/11/2017 | 4 |
| 25/11/2017 | 3.5 |
| 25/11/2017 | 3.3 |
| 25/11/2017 | 3.1 |
| 25/11/2017 | 2.9 |
| 26/11/2017 | 2.8 |
| 26/11/2017 | 2.7 |
| 26/11/2017 | 2.4 |
| 26/11/2017 | 2.3 |
| 26/11/2017 | 2.5 |
| 26/11/2017 | 2.6 |
| 26/11/2017 | 2.9 |
| 26/11/2017 | 3 |
| 26/11/2017 | 3.3 |
| 26/11/2017 | 3.6 |
| 26/11/2017 | 3.7 |
| 26/11/2017 | 4.1 |
| 26/11/2017 | 3.6 |
| 26/11/2017 | 3.8 |
| 26/11/2017 | 3.7 |
| 26/11/2017 | 4.3 |
| 26/11/2017 | 4.6 |
| 26/11/2017 | 4.2 |
| 26/11/2017 | 4.2 |
| 26/11/2017 | 4.1 |
| 26/11/2017 | 3.8 |
| 26/11/2017 | 3.5 |
| 26/11/2017 | 3.2 |
| 26/11/2017 | 3 |
| 27/11/2017 | 2.8 |
| 27/11/2017 | 2.7 |
| 27/11/2017 | 2.6 |
| 27/11/2017 | 2.8 |
| 27/11/2017 | 3.1 |
| 27/11/2017 | 3.8 |
| 27/11/2017 | 4.3 |
| 27/11/2017 | 5 |
| 27/11/2017 | 5.2 |
| 27/11/2017 | 5 |
| 27/11/2017 | 5 |
| 27/11/2017 | 5.1 |
| 27/11/2017 | 5.3 |
| 27/11/2017 | 5.2 |
| 27/11/2017 | 5.3 |
| 27/11/2017 | 5.6 |
| 27/11/2017 | 6.1 |
| 27/11/2017 | 5.9 |
| 27/11/2017 | 5.2 |
| 27/11/2017 | 5 |
| 27/11/2017 | 4 |
| 27/11/2017 | 3.8 |
| 27/11/2017 | 3.2 |
| 27/11/2017 | 2.7 |
| 28/11/2017 | 2.9 |
| 28/11/2017 | 2.8 |
| 28/11/2017 | 2.6 |
| 28/11/2017 | 2.7 |
| 28/11/2017 | 3 |
| 28/11/2017 | 3.6 |
| 28/11/2017 | 4.6 |
| 28/11/2017 | 4.8 |
| 28/11/2017 | 5 |
| 28/11/2017 | 5.3 |
| 28/11/2017 | 5.2 |
| 28/11/2017 | 5.3 |
| 28/11/2017 | 5.4 |
| 28/11/2017 | 5.3 |
| 28/11/2017 | 5.4 |
| 28/11/2017 | 5.9 |
| 28/11/2017 | 6 |
| 28/11/2017 | 5.7 |
| 28/11/2017 | 5.5 |
| 28/11/2017 | 4.7 |
| 28/11/2017 | 4.2 |
| 28/11/2017 | 3.9 |
| 28/11/2017 | 3.3 |
| 28/11/2017 | 2.9 |
| 29/11/2017 | 2.5 |
| 29/11/2017 | 2.4 |
| 29/11/2017 | 2.7 |
| 29/11/2017 | 2.8 |
| 29/11/2017 | 3.1 |
| 29/11/2017 | 3.7 |
| 29/11/2017 | 4.3 |
| 29/11/2017 | 5 |
| 29/11/2017 | 5.2 |
| 29/11/2017 | 5 |
| 29/11/2017 | 5.5 |
| 29/11/2017 | 5.5 |
| 29/11/2017 | 5.2 |
| 29/11/2017 | 5.1 |
| 29/11/2017 | 5.1 |
| 29/11/2017 | 5.9 |
| 29/11/2017 | 5.9 |
| 29/11/2017 | 5.6 |
| 29/11/2017 | 5.5 |
| 29/11/2017 | 4.7 |
| 29/11/2017 | 4.2 |
| 29/11/2017 | 4 |
| 29/11/2017 | 3.4 |
| 29/11/2017 | 2.9 |
| 30/11/2017 | 2.5 |
| 30/11/2017 | 2.4 |
| 30/11/2017 | 2.7 |
| 30/11/2017 | 2.8 |
| 30/11/2017 | 3.1 |
| 30/11/2017 | 3.6 |
| 30/11/2017 | 4.6 |
| 30/11/2017 | 4.8 |
| 30/11/2017 | 5 |
| 30/11/2017 | 5.3 |
| 30/11/2017 | 5.2 |
| 30/11/2017 | 5.3 |
| 30/11/2017 | 5.4 |
| 30/11/2017 | 5.3 |
| 30/11/2017 | 5.3 |
| 30/11/2017 | 5.6 |
| 30/11/2017 | 6 |
| 30/11/2017 | 5.9 |
| 30/11/2017 | 5.2 |
| 30/11/2017 | 5 |
| 30/11/2017 | 4 |
| 30/11/2017 | 3.9 |
| 30/11/2017 | 3.4 |
| 30/11/2017 | 2.9 |
| 01/12/2017 | 2.5 |
| 01/12/2017 | 2.4 |
| 01/12/2017 | 2.7 |
| 01/12/2017 | 2.7 |
| 01/12/2017 | 3 |
| 01/12/2017 | 3.8 |
| 01/12/2017 | 4.4 |
| 01/12/2017 | 4.7 |
| 01/12/2017 | 5 |
| 01/12/2017 | 5.3 |
| 01/12/2017 | 5.2 |
| 01/12/2017 | 5.1 |
| 01/12/2017 | 5 |
| 01/12/2017 | 5.2 |
| 01/12/2017 | 5.1 |
| 01/12/2017 | 5.3 |
| 01/12/2017 | 5.6 |
| 01/12/2017 | 5.3 |
| 01/12/2017 | 5 |
| 01/12/2017 | 4.8 |
| 01/12/2017 | 4 |
| 01/12/2017 | 3.7 |
| 01/12/2017 | 3.1 |
| 01/12/2017 | 3.2 |
| 02/12/2017 | 2.9 |
| 02/12/2017 | 2.8 |
| 02/12/2017 | 2.4 |
| 02/12/2017 | 2.3 |
| 02/12/2017 | 2.8 |
| 02/12/2017 | 2.9 |
| 02/12/2017 | 3.3 |
| 02/12/2017 | 3.5 |
| 02/12/2017 | 3.7 |
| 02/12/2017 | 4.2 |
| 02/12/2017 | 4.4 |
| 02/12/2017 | 4.4 |
| 02/12/2017 | 4.2 |
| 02/12/2017 | 3.9 |
| 02/12/2017 | 4.3 |
| 02/12/2017 | 4.8 |
| 02/12/2017 | 4.8 |
| 02/12/2017 | 4.6 |
| 02/12/2017 | 4.7 |
| 02/12/2017 | 4 |
| 02/12/2017 | 3.5 |
| 02/12/2017 | 3.3 |
| 02/12/2017 | 3.1 |
| 02/12/2017 | 3 |
| 03/12/2017 | 2.8 |
| 03/12/2017 | 2.7 |
| 03/12/2017 | 2.4 |
| 03/12/2017 | 2.3 |
| 03/12/2017 | 2.4 |
| 03/12/2017 | 2.5 |
| 03/12/2017 | 2.8 |
| 03/12/2017 | 2.8 |
| 03/12/2017 | 3.6 |
| 03/12/2017 | 3.3 |
| 03/12/2017 | 4 |
| 03/12/2017 | 3.9 |
| 03/12/2017 | 3.9 |
| 03/12/2017 | 3.7 |
| 03/12/2017 | 3.6 |
| 03/12/2017 | 4.1 |
| 03/12/2017 | 4.3 |
| 03/12/2017 | 4.5 |
| 03/12/2017 | 4.1 |
| 03/12/2017 | 4 |
| 03/12/2017 | 3.7 |
| 03/12/2017 | 3.5 |
| 03/12/2017 | 3.1 |
| 03/12/2017 | 3 |
| 04/12/2017 | 2.8 |
| 04/12/2017 | 2.2 |
| 04/12/2017 | 2.6 |
| 04/12/2017 | 2.7 |
| 04/12/2017 | 3 |
| 04/12/2017 | 3.6 |
| 04/12/2017 | 4.6 |
| 04/12/2017 | 4.7 |
| 04/12/2017 | 4.9 |
| 04/12/2017 | 5.2 |
| 04/12/2017 | 5.2 |
| 04/12/2017 | 5.4 |
| 04/12/2017 | 5.1 |
| 04/12/2017 | 5.1 |
| 04/12/2017 | 5.2 |
| 04/12/2017 | 5.8 |
| 04/12/2017 | 5.7 |
| 04/12/2017 | 5.7 |
| 04/12/2017 | 5.6 |
| 04/12/2017 | 4.8 |
| 04/12/2017 | 4.4 |
| 04/12/2017 | 3.8 |
| 04/12/2017 | 3.2 |
| 04/12/2017 | 2.8 |
| 05/12/2017 | 2.9 |
| 05/12/2017 | 2.8 |
| 05/12/2017 | 2.6 |
| 05/12/2017 | 2.7 |
| 05/12/2017 | 3 |
| 05/12/2017 | 3.9 |
| 05/12/2017 | 4.4 |
| 05/12/2017 | 4.6 |
| 05/12/2017 | 5.2 |
| 05/12/2017 | 5 |
| 05/12/2017 | 5.4 |
| 05/12/2017 | 5 |
| 05/12/2017 | 5.2 |
| 05/12/2017 | 5.2 |
| 05/12/2017 | 5.3 |
| 05/12/2017 | 5.7 |
| 05/12/2017 | 5.6 |
| 05/12/2017 | 6 |
| 05/12/2017 | 5.3 |
| 05/12/2017 | 5.1 |
| 05/12/2017 | 4.1 |
| 05/12/2017 | 3.9 |
| 05/12/2017 | 3.3 |
| 05/12/2017 | 2.9 |
| 06/12/2017 | 2.6 |
| 06/12/2017 | 2.4 |
| 06/12/2017 | 2.7 |
| 06/12/2017 | 2.8 |
| 06/12/2017 | 3.1 |
| 06/12/2017 | 3.5 |
| 06/12/2017 | 4.6 |
| 06/12/2017 | 4.8 |
| 06/12/2017 | 4.9 |
| 06/12/2017 | 5.2 |
| 06/12/2017 | 5.2 |
| 06/12/2017 | 5.3 |
| 06/12/2017 | 5 |
| 06/12/2017 | 5.5 |
| 06/12/2017 | 5.5 |
| 06/12/2017 | 5.7 |
| 06/12/2017 | 6 |
| 06/12/2017 | 5.9 |
| 06/12/2017 | 5.4 |
| 06/12/2017 | 5 |
| 06/12/2017 | 4.1 |
| 06/12/2017 | 4 |
| 06/12/2017 | 3.4 |
| 06/12/2017 | 3 |
| 07/12/2017 | 2.6 |
| 07/12/2017 | 2.4 |
| 07/12/2017 | 2.7 |
| 07/12/2017 | 2.8 |
| 07/12/2017 | 3 |
| 07/12/2017 | 3.9 |
| 07/12/2017 | 4.4 |
| 07/12/2017 | 4.5 |
| 07/12/2017 | 5.2 |
| 07/12/2017 | 5 |
| 07/12/2017 | 5.5 |
| 07/12/2017 | 5.1 |
| 07/12/2017 | 5.2 |
| 07/12/2017 | 5.1 |
| 07/12/2017 | 5.2 |
| 07/12/2017 | 5.8 |
| 07/12/2017 | 5.6 |
| 07/12/2017 | 5.6 |
| 07/12/2017 | 5.6 |
| 07/12/2017 | 4.8 |
| 07/12/2017 | 4.5 |
| 07/12/2017 | 3.9 |
| 07/12/2017 | 3.3 |
| 07/12/2017 | 2.9 |
| 08/12/2017 | 2.5 |
| 08/12/2017 | 2.4 |
| 08/12/2017 | 2.7 |
| 08/12/2017 | 2.7 |
| 08/12/2017 | 2.9 |
| 08/12/2017 | 3.7 |
| 08/12/2017 | 4.1 |
| 08/12/2017 | 4.9 |
| 08/12/2017 | 5.2 |
| 08/12/2017 | 5 |
| 08/12/2017 | 5.4 |
| 08/12/2017 | 5.4 |
| 08/12/2017 | 5.3 |
| 08/12/2017 | 5.1 |
| 08/12/2017 | 5 |
| 08/12/2017 | 5.6 |
| 08/12/2017 | 5.8 |
| 08/12/2017 | 5.6 |
| 08/12/2017 | 5.3 |
| 08/12/2017 | 4.7 |
| 08/12/2017 | 4 |
| 08/12/2017 | 3.7 |
| 08/12/2017 | 3.1 |
| 08/12/2017 | 2.7 |
| 09/12/2017 | 2.5 |
| 09/12/2017 | 2.8 |
| 09/12/2017 | 2.4 |
| 09/12/2017 | 2.3 |
| 09/12/2017 | 2.7 |
| 09/12/2017 | 2.8 |
| 09/12/2017 | 3.1 |
| 09/12/2017 | 3.3 |
| 09/12/2017 | 3.9 |
| 09/12/2017 | 4 |
| 09/12/2017 | 4.2 |
| 09/12/2017 | 4.2 |
| 09/12/2017 | 4 |
| 09/12/2017 | 4.3 |
| 09/12/2017 | 4.2 |
| 09/12/2017 | 4.6 |
| 09/12/2017 | 4.5 |
| 09/12/2017 | 4.4 |
| 09/12/2017 | 4.5 |
| 09/12/2017 | 4.3 |
| 09/12/2017 | 3.9 |
| 09/12/2017 | 3.2 |
| 09/12/2017 | 3.1 |
| 09/12/2017 | 3 |
| 10/12/2017 | 2.4 |
| 10/12/2017 | 2.3 |
| 10/12/2017 | 2.4 |
| 10/12/2017 | 2.2 |
| 10/12/2017 | 2.4 |
| 10/12/2017 | 2.4 |
| 10/12/2017 | 2.6 |
| 10/12/2017 | 3.1 |
| 10/12/2017 | 3.3 |
| 10/12/2017 | 3.6 |
| 10/12/2017 | 3.8 |
| 10/12/2017 | 3.8 |
| 10/12/2017 | 3.8 |
| 10/12/2017 | 3.5 |
| 10/12/2017 | 4 |
| 10/12/2017 | 3.9 |
| 10/12/2017 | 4.5 |
| 10/12/2017 | 4.3 |
| 10/12/2017 | 4.4 |
| 10/12/2017 | 3.9 |
| 10/12/2017 | 3.7 |
| 10/12/2017 | 3.5 |
| 10/12/2017 | 3.1 |
| 10/12/2017 | 2.6 |
| 11/12/2017 | 2.8 |
| 11/12/2017 | 2.3 |
| 11/12/2017 | 2.6 |
| 11/12/2017 | 2.7 |
| 11/12/2017 | 3 |
| 11/12/2017 | 3.4 |
| 11/12/2017 | 4.3 |
| 11/12/2017 | 4.5 |
| 11/12/2017 | 5.1 |
| 11/12/2017 | 4.9 |
| 11/12/2017 | 4.9 |
| 11/12/2017 | 5.2 |
| 11/12/2017 | 4.9 |
| 11/12/2017 | 5 |
| 11/12/2017 | 5 |
| 11/12/2017 | 5.6 |
| 11/12/2017 | 5.9 |
| 11/12/2017 | 5.4 |
| 11/12/2017 | 5.5 |
| 11/12/2017 | 4.7 |
| 11/12/2017 | 4.4 |
| 11/12/2017 | 3.7 |
| 11/12/2017 | 3.2 |
| 11/12/2017 | 2.8 |
| 12/12/2017 | 3 |
| 12/12/2017 | 2.8 |
| 12/12/2017 | 2.6 |
| 12/12/2017 | 2.7 |
| 12/12/2017 | 2.9 |
| 12/12/2017 | 3.7 |
| 12/12/2017 | 4.2 |
| 12/12/2017 | 4.8 |
| 12/12/2017 | 4.9 |
| 12/12/2017 | 5.2 |
| 12/12/2017 | 5.2 |
| 12/12/2017 | 5.3 |
| 12/12/2017 | 5.1 |
| 12/12/2017 | 5.1 |
| 12/12/2017 | 5.2 |
| 12/12/2017 | 5.4 |
| 12/12/2017 | 5.7 |
| 12/12/2017 | 5.7 |
| 12/12/2017 | 5.2 |
| 12/12/2017 | 4.9 |
| 12/12/2017 | 4.1 |
| 12/12/2017 | 3.8 |
| 12/12/2017 | 3.3 |
| 12/12/2017 | 3 |
| 13/12/2017 | 2.6 |
| 13/12/2017 | 2.4 |
| 13/12/2017 | 2.7 |
| 13/12/2017 | 2.8 |
| 13/12/2017 | 3 |
| 13/12/2017 | 3.8 |
| 13/12/2017 | 4.3 |
| 13/12/2017 | 5 |
| 13/12/2017 | 5.1 |
| 13/12/2017 | 4.9 |
| 13/12/2017 | 5.4 |
| 13/12/2017 | 5.1 |
| 13/12/2017 | 5.3 |
| 13/12/2017 | 5.3 |
| 13/12/2017 | 5.4 |
| 13/12/2017 | 5.4 |
| 13/12/2017 | 5.6 |
| 13/12/2017 | 5.7 |
| 13/12/2017 | 5.2 |
| 13/12/2017 | 4.9 |
| 13/12/2017 | 4 |
| 13/12/2017 | 3.9 |
| 13/12/2017 | 3.3 |
| 13/12/2017 | 3 |
| 14/12/2017 | 2.6 |
| 14/12/2017 | 2.4 |
| 14/12/2017 | 2.7 |
| 14/12/2017 | 2.8 |
| 14/12/2017 | 2.9 |
| 14/12/2017 | 3.7 |
| 14/12/2017 | 4.2 |
| 14/12/2017 | 4.8 |
| 14/12/2017 | 4.9 |
| 14/12/2017 | 5.2 |
| 14/12/2017 | 5.2 |
| 14/12/2017 | 5.3 |
| 14/12/2017 | 5 |
| 14/12/2017 | 5 |
| 14/12/2017 | 5.1 |
| 14/12/2017 | 5.6 |
| 14/12/2017 | 5.8 |
| 14/12/2017 | 5.9 |
| 14/12/2017 | 5.4 |
| 14/12/2017 | 4.7 |
| 14/12/2017 | 4.4 |
| 14/12/2017 | 3.8 |
| 14/12/2017 | 3.3 |
| 14/12/2017 | 3 |
| 15/12/2017 | 2.6 |
| 15/12/2017 | 2.4 |
| 15/12/2017 | 2.7 |
| 15/12/2017 | 2.7 |
| 15/12/2017 | 2.8 |
| 15/12/2017 | 3.5 |
| 15/12/2017 | 4.4 |
| 15/12/2017 | 4.7 |
| 15/12/2017 | 4.9 |
| 15/12/2017 | 5.2 |
| 15/12/2017 | 5.1 |
| 15/12/2017 | 5.2 |
| 15/12/2017 | 5.1 |
| 15/12/2017 | 5 |
| 15/12/2017 | 4.9 |
| 15/12/2017 | 5.3 |
| 15/12/2017 | 5.4 |
| 15/12/2017 | 5.3 |
| 15/12/2017 | 5.2 |
| 15/12/2017 | 4.5 |
| 15/12/2017 | 3.9 |
| 15/12/2017 | 3.7 |
| 15/12/2017 | 3.1 |
| 15/12/2017 | 2.8 |
| 16/12/2017 | 2.5 |
| 16/12/2017 | 2.8 |
| 16/12/2017 | 2.4 |
| 16/12/2017 | 2.3 |
| 16/12/2017 | 2.6 |
| 16/12/2017 | 2.6 |
| 16/12/2017 | 2.9 |
| 16/12/2017 | 3.6 |
| 16/12/2017 | 3.7 |
| 16/12/2017 | 4.2 |
| 16/12/2017 | 4.5 |
| 16/12/2017 | 4 |
| 16/12/2017 | 3.9 |
| 16/12/2017 | 4.2 |
| 16/12/2017 | 4.1 |
| 16/12/2017 | 4.4 |
| 16/12/2017 | 4.6 |
| 16/12/2017 | 4.7 |
| 16/12/2017 | 4.4 |
| 16/12/2017 | 4.2 |
| 16/12/2017 | 3.9 |
| 16/12/2017 | 3.2 |
| 16/12/2017 | 3 |
| 16/12/2017 | 3.1 |
| 17/12/2017 | 2.4 |
| 17/12/2017 | 2.3 |
| 17/12/2017 | 2.4 |
| 17/12/2017 | 2.2 |
| 17/12/2017 | 2.3 |
| 17/12/2017 | 2.3 |
| 17/12/2017 | 2.9 |
| 17/12/2017 | 2.9 |
| 17/12/2017 | 3.1 |
| 17/12/2017 | 3.4 |
| 17/12/2017 | 3.6 |
| 17/12/2017 | 3.6 |
| 17/12/2017 | 3.7 |
| 17/12/2017 | 3.4 |
| 17/12/2017 | 4 |
| 17/12/2017 | 4.2 |
| 17/12/2017 | 4.2 |
| 17/12/2017 | 4.1 |
| 17/12/2017 | 4.3 |
| 17/12/2017 | 3.8 |
| 17/12/2017 | 3.6 |
| 17/12/2017 | 3.4 |
| 17/12/2017 | 3.1 |
| 17/12/2017 | 2.6 |
| 18/12/2017 | 2.4 |
| 18/12/2017 | 2.3 |
| 18/12/2017 | 2.6 |
| 18/12/2017 | 2.7 |
| 18/12/2017 | 2.9 |
| 18/12/2017 | 3.8 |
| 18/12/2017 | 4.1 |
| 18/12/2017 | 4.7 |
| 18/12/2017 | 4.8 |
| 18/12/2017 | 5.1 |
| 18/12/2017 | 5.2 |
| 18/12/2017 | 4.9 |
| 18/12/2017 | 5.2 |
| 18/12/2017 | 5.3 |
| 18/12/2017 | 5.4 |
| 18/12/2017 | 5.3 |
| 18/12/2017 | 5.5 |
| 18/12/2017 | 5.7 |
| 18/12/2017 | 5.3 |
| 18/12/2017 | 5 |
| 18/12/2017 | 4.3 |
| 18/12/2017 | 3.7 |
| 18/12/2017 | 3.2 |
| 18/12/2017 | 2.9 |
| 19/12/2017 | 2.5 |
| 19/12/2017 | 2.8 |
| 19/12/2017 | 2.6 |
| 19/12/2017 | 2.7 |
| 19/12/2017 | 2.8 |
| 19/12/2017 | 3.6 |
| 19/12/2017 | 4.4 |
| 19/12/2017 | 4.6 |
| 19/12/2017 | 5.1 |
| 19/12/2017 | 4.9 |
| 19/12/2017 | 4.9 |
| 19/12/2017 | 5.1 |
| 19/12/2017 | 4.9 |
| 19/12/2017 | 4.9 |
| 19/12/2017 | 5.1 |
| 19/12/2017 | 5.7 |
| 19/12/2017 | 5.9 |
| 19/12/2017 | 5.5 |
| 19/12/2017 | 5.6 |
| 19/12/2017 | 4.8 |
| 19/12/2017 | 4 |
| 19/12/2017 | 3.8 |
| 19/12/2017 | 3.3 |
| 19/12/2017 | 3 |
| 20/12/2017 | 2.6 |
| 20/12/2017 | 2.4 |
| 20/12/2017 | 2.7 |
| 20/12/2017 | 2.8 |
| 20/12/2017 | 2.9 |
| 20/12/2017 | 3.7 |
| 20/12/2017 | 4.6 |
| 20/12/2017 | 4.7 |
| 20/12/2017 | 4.8 |
| 20/12/2017 | 5.1 |
| 20/12/2017 | 5.2 |
| 20/12/2017 | 5.4 |
| 20/12/2017 | 5.1 |
| 20/12/2017 | 5.2 |
| 20/12/2017 | 5.3 |
| 20/12/2017 | 5.7 |
| 20/12/2017 | 5.8 |
| 20/12/2017 | 5.4 |
| 20/12/2017 | 5.6 |
| 20/12/2017 | 4.7 |
| 20/12/2017 | 4.5 |
| 20/12/2017 | 3.9 |
| 20/12/2017 | 3.3 |
| 20/12/2017 | 3 |
| 21/12/2017 | 2.6 |
| 21/12/2017 | 2.4 |
| 21/12/2017 | 2.7 |
| 21/12/2017 | 2.7 |
| 21/12/2017 | 2.9 |
| 21/12/2017 | 3.5 |
| 21/12/2017 | 4.4 |
| 21/12/2017 | 4.5 |
| 21/12/2017 | 5.1 |
| 21/12/2017 | 4.9 |
| 21/12/2017 | 4.9 |
| 21/12/2017 | 5.1 |
| 21/12/2017 | 5.3 |
| 21/12/2017 | 4.9 |
| 21/12/2017 | 5 |
| 21/12/2017 | 5.3 |
| 21/12/2017 | 5.9 |
| 21/12/2017 | 5.6 |
| 21/12/2017 | 5.3 |
| 21/12/2017 | 5 |
| 21/12/2017 | 4.4 |
| 21/12/2017 | 3.8 |
| 21/12/2017 | 3.3 |
| 21/12/2017 | 3 |
| 22/12/2017 | 2.6 |
| 22/12/2017 | 2.4 |
| 22/12/2017 | 2.6 |
| 22/12/2017 | 2.6 |
| 22/12/2017 | 3 |
| 22/12/2017 | 3.4 |
| 22/12/2017 | 4 |
| 22/12/2017 | 4.4 |
| 22/12/2017 | 4.9 |
| 22/12/2017 | 4.9 |
| 22/12/2017 | 4.9 |
| 22/12/2017 | 5 |
| 22/12/2017 | 4.8 |
| 22/12/2017 | 5.1 |
| 22/12/2017 | 5 |
| 22/12/2017 | 5.3 |
| 22/12/2017 | 5.3 |
| 22/12/2017 | 5.3 |
| 22/12/2017 | 4.8 |
| 22/12/2017 | 4.6 |
| 22/12/2017 | 3.8 |
| 22/12/2017 | 3.4 |
| 22/12/2017 | 3.4 |
| 22/12/2017 | 2.8 |
| 23/12/2017 | 2.5 |
| 23/12/2017 | 2.8 |
| 23/12/2017 | 2.3 |
| 23/12/2017 | 2.7 |
| 23/12/2017 | 2.3 |
| 23/12/2017 | 2.8 |
| 23/12/2017 | 2.9 |
| 23/12/2017 | 3.1 |
| 23/12/2017 | 3.9 |
| 23/12/2017 | 4.1 |
| 23/12/2017 | 4.4 |
| 23/12/2017 | 3.9 |
| 23/12/2017 | 4.2 |
| 23/12/2017 | 3.9 |
| 23/12/2017 | 3.8 |
| 23/12/2017 | 4.5 |
| 23/12/2017 | 4.7 |
| 23/12/2017 | 4.3 |
| 23/12/2017 | 4.6 |
| 23/12/2017 | 3.9 |
| 23/12/2017 | 3.8 |
| 23/12/2017 | 3.4 |
| 23/12/2017 | 2.9 |
| 23/12/2017 | 2.6 |
| 24/12/2017 | 2.4 |
| 24/12/2017 | 2.3 |
| 24/12/2017 | 2.3 |
| 24/12/2017 | 2.6 |
| 24/12/2017 | 2.5 |
| 24/12/2017 | 2.5 |
| 24/12/2017 | 2.5 |
| 24/12/2017 | 2.6 |
| 24/12/2017 | 2.9 |
| 24/12/2017 | 3.3 |
| 24/12/2017 | 3.5 |
| 24/12/2017 | 3.5 |
| 24/12/2017 | 3.5 |
| 24/12/2017 | 3.7 |
| 24/12/2017 | 3.7 |
| 24/12/2017 | 3.9 |
| 24/12/2017 | 4.3 |
| 24/12/2017 | 4.2 |
| 24/12/2017 | 4 |
| 24/12/2017 | 4 |
| 24/12/2017 | 3.6 |
| 24/12/2017 | 3.1 |
| 24/12/2017 | 3 |
| 24/12/2017 | 2.4 |
| 25/12/2017 | 2.5 |
| 25/12/2017 | 2.5 |
| 25/12/2017 | 2.3 |
| 25/12/2017 | 2.2 |
| 25/12/2017 | 2.3 |
| 25/12/2017 | 2.2 |
| 25/12/2017 | 2.5 |
| 25/12/2017 | 2.8 |
| 25/12/2017 | 3 |
| 25/12/2017 | 3.6 |
| 25/12/2017 | 3.4 |
| 25/12/2017 | 3.6 |
| 25/12/2017 | 3.4 |
| 25/12/2017 | 3.5 |
| 25/12/2017 | 3.4 |
| 25/12/2017 | 3.8 |
| 25/12/2017 | 3.5 |
| 25/12/2017 | 3.6 |
| 25/12/2017 | 3.6 |
| 25/12/2017 | 3.6 |
| 25/12/2017 | 3 |
| 25/12/2017 | 3.2 |
| 25/12/2017 | 3.1 |
| 25/12/2017 | 2.4 |
| 26/12/2017 | 2.5 |
| 26/12/2017 | 2.5 |
| 26/12/2017 | 2.3 |
| 26/12/2017 | 2.2 |
| 26/12/2017 | 2.3 |
| 26/12/2017 | 2.2 |
| 26/12/2017 | 2.5 |
| 26/12/2017 | 2.7 |
| 26/12/2017 | 2.9 |
| 26/12/2017 | 3.5 |
| 26/12/2017 | 3.4 |
| 26/12/2017 | 3.5 |
| 26/12/2017 | 3.4 |
| 26/12/2017 | 3.5 |
| 26/12/2017 | 3.4 |
| 26/12/2017 | 3.8 |
| 26/12/2017 | 3.9 |
| 26/12/2017 | 3.6 |
| 26/12/2017 | 3.6 |
| 26/12/2017 | 3.6 |
| 26/12/2017 | 3 |
| 26/12/2017 | 3.2 |
| 26/12/2017 | 3.1 |
| 26/12/2017 | 2.6 |
| 27/12/2017 | 2.8 |
| 27/12/2017 | 2.6 |
| 27/12/2017 | 2.2 |
| 27/12/2017 | 2.5 |
| 27/12/2017 | 2.5 |
| 27/12/2017 | 2.7 |
| 27/12/2017 | 3.4 |
| 27/12/2017 | 3.4 |
| 27/12/2017 | 4.3 |
| 27/12/2017 | 4.4 |
| 27/12/2017 | 4.5 |
| 27/12/2017 | 4.2 |
| 27/12/2017 | 4.3 |
| 27/12/2017 | 4.1 |
| 27/12/2017 | 4.5 |
| 27/12/2017 | 4.6 |
| 27/12/2017 | 5 |
| 27/12/2017 | 5.1 |
| 27/12/2017 | 4.6 |
| 27/12/2017 | 4.1 |
| 27/12/2017 | 3.6 |
| 27/12/2017 | 3.5 |
| 27/12/2017 | 3.2 |
| 27/12/2017 | 2.6 |
| 28/12/2017 | 2.8 |
| 28/12/2017 | 2.6 |
| 28/12/2017 | 2.2 |
| 28/12/2017 | 2.5 |
| 28/12/2017 | 2.5 |
| 28/12/2017 | 3.2 |
| 28/12/2017 | 3.3 |
| 28/12/2017 | 3.9 |
| 28/12/2017 | 4.2 |
| 28/12/2017 | 4.4 |
| 28/12/2017 | 4.5 |
| 28/12/2017 | 4.2 |
| 28/12/2017 | 4.3 |
| 28/12/2017 | 4.1 |
| 28/12/2017 | 4.5 |
| 28/12/2017 | 4.6 |
| 28/12/2017 | 5 |
| 28/12/2017 | 5 |
| 28/12/2017 | 4.6 |
| 28/12/2017 | 4.1 |
| 28/12/2017 | 3.6 |
| 28/12/2017 | 3.5 |
| 28/12/2017 | 3.2 |
| 28/12/2017 | 2.7 |
| 29/12/2017 | 2.8 |
| 29/12/2017 | 2.6 |
| 29/12/2017 | 2.2 |
| 29/12/2017 | 2.5 |
| 29/12/2017 | 2.4 |
| 29/12/2017 | 3.2 |
| 29/12/2017 | 3.3 |
| 29/12/2017 | 3.9 |
| 29/12/2017 | 4.2 |
| 29/12/2017 | 4.3 |
| 29/12/2017 | 4.5 |
| 29/12/2017 | 4.2 |
| 29/12/2017 | 4.2 |
| 29/12/2017 | 4.1 |
| 29/12/2017 | 4.5 |
| 29/12/2017 | 4.5 |
| 29/12/2017 | 4.9 |
| 29/12/2017 | 5 |
| 29/12/2017 | 4.6 |
| 29/12/2017 | 4 |
| 29/12/2017 | 3.6 |
| 29/12/2017 | 3.4 |
| 29/12/2017 | 3.2 |
| 29/12/2017 | 2.7 |
| 30/12/2017 | 2.8 |
| 30/12/2017 | 2.6 |
| 30/12/2017 | 2.2 |
| 30/12/2017 | 2.5 |
| 30/12/2017 | 2.4 |
| 30/12/2017 | 3.1 |
| 30/12/2017 | 3.3 |
| 30/12/2017 | 3.9 |
| 30/12/2017 | 4.2 |
| 30/12/2017 | 4.3 |
| 30/12/2017 | 4.4 |
| 30/12/2017 | 4.2 |
| 30/12/2017 | 4.2 |
| 30/12/2017 | 4.1 |
| 30/12/2017 | 4.5 |
| 30/12/2017 | 4.5 |
| 30/12/2017 | 4.9 |
| 30/12/2017 | 5 |
| 30/12/2017 | 4.6 |
| 30/12/2017 | 4 |
| 30/12/2017 | 3.6 |
| 30/12/2017 | 3.4 |
| 30/12/2017 | 3.2 |
| 30/12/2017 | 2.8 |
| 31/12/2017 | 2.8 |
| 31/12/2017 | 2.5 |
| 31/12/2017 | 2.6 |
| 31/12/2017 | 2.5 |
| 31/12/2017 | 2.4 |
| 31/12/2017 | 2.8 |
| 31/12/2017 | 3.1 |
| 31/12/2017 | 3.2 |
| 31/12/2017 | 3.9 |
| 31/12/2017 | 4 |
| 31/12/2017 | 4 |
| 31/12/2017 | 4.4 |
| 31/12/2017 | 4.2 |
| 31/12/2017 | 4.3 |
| 31/12/2017 | 4.1 |
| 31/12/2017 | 4.3 |
| 31/12/2017 | 4.2 |
| 31/12/2017 | 4.4 |
| 31/12/2017 | 3.8 |
| 31/12/2017 | 3.6 |
| 31/12/2017 | 3.4 |
| 31/12/2017 | 3 |
| 31/12/2017 | 3.1 |